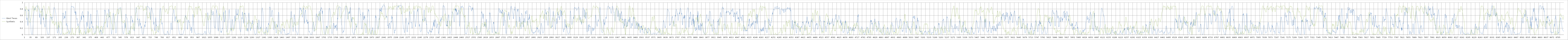
| Category | West Texas | Synthetic |
|---|---|---|
| 0 | 0.784 | 0.587 |
| 1 | 0.75 | 0.593 |
| 2 | 0.752 | 0.647 |
| 3 | 0.768 | 0.708 |
| 4 | 0.758 | 0.78 |
| 5 | 0.784 | 0.848 |
| 6 | 0.752 | 0.876 |
| 7 | 0.745 | 0.877 |
| 8 | 0.735 | 0.852 |
| 9 | 0.659 | 0.816 |
| 10 | 0.537 | 0.811 |
| 11 | 0.461 | 0.797 |
| 12 | 0.528 | 0.788 |
| 13 | 0.52 | 0.793 |
| 14 | 0.455 | 0.777 |
| 15 | 0.418 | 0.781 |
| 16 | 0.34 | 0.776 |
| 17 | 0.283 | 0.763 |
| 18 | 0.382 | 0.736 |
| 19 | 0.768 | 0.706 |
| 20 | 0.746 | 0.644 |
| 21 | 0.776 | 0.585 |
| 22 | 0.76 | 0.512 |
| 23 | 0.782 | 0.446 |
| 24 | 0.774 | 0.43 |
| 25 | 0.742 | 0.412 |
| 26 | 0.676 | 0.408 |
| 27 | 0.636 | 0.401 |
| 28 | 0.6 | 0.382 |
| 29 | 0.525 | 0.377 |
| 30 | 0.513 | 0.388 |
| 31 | 0.477 | 0.403 |
| 32 | 0.336 | 0.44 |
| 33 | 0.295 | 0.468 |
| 34 | 0.255 | 0.489 |
| 35 | 0.139 | 0.522 |
| 36 | 0.075 | 0.544 |
| 37 | 0.039 | 0.585 |
| 38 | 0.024 | 0.638 |
| 39 | 0.014 | 0.69 |
| 40 | 0.007 | 0.742 |
| 41 | 0.006 | 0.796 |
| 42 | 0.007 | 0.834 |
| 43 | 0.03 | 0.865 |
| 44 | 0.072 | 0.89 |
| 45 | 0.156 | 0.893 |
| 46 | 0.248 | 0.891 |
| 47 | 0.354 | 0.893 |
| 48 | 0.509 | 0.876 |
| 49 | 0.614 | 0.836 |
| 50 | 0.647 | 0.804 |
| 51 | 0.668 | 0.762 |
| 52 | 0.686 | 0.74 |
| 53 | 0.753 | 0.752 |
| 54 | 0.813 | 0.773 |
| 55 | 0.819 | 0.802 |
| 56 | 0.828 | 0.841 |
| 57 | 0.768 | 0.86 |
| 58 | 0.772 | 0.868 |
| 59 | 0.813 | 0.87 |
| 60 | 0.834 | 0.853 |
| 61 | 0.848 | 0.829 |
| 62 | 0.856 | 0.796 |
| 63 | 0.864 | 0.762 |
| 64 | 0.871 | 0.736 |
| 65 | 0.867 | 0.735 |
| 66 | 0.867 | 0.738 |
| 67 | 0.892 | 0.735 |
| 68 | 0.904 | 0.731 |
| 69 | 0.901 | 0.725 |
| 70 | 0.908 | 0.745 |
| 71 | 0.907 | 0.794 |
| 72 | 0.901 | 0.84 |
| 73 | 0.883 | 0.881 |
| 74 | 0.87 | 0.899 |
| 75 | 0.856 | 0.9 |
| 76 | 0.835 | 0.9 |
| 77 | 0.821 | 0.9 |
| 78 | 0.802 | 0.892 |
| 79 | 0.8 | 0.875 |
| 80 | 0.784 | 0.859 |
| 81 | 0.71 | 0.842 |
| 82 | 0.619 | 0.821 |
| 83 | 0.544 | 0.793 |
| 84 | 0.533 | 0.758 |
| 85 | 0.579 | 0.722 |
| 86 | 0.666 | 0.697 |
| 87 | 0.541 | 0.681 |
| 88 | 0.541 | 0.686 |
| 89 | 0.43 | 0.696 |
| 90 | 0.35 | 0.712 |
| 91 | 0.316 | 0.737 |
| 92 | 0.399 | 0.746 |
| 93 | 0.521 | 0.734 |
| 94 | 0.576 | 0.713 |
| 95 | 0.664 | 0.681 |
| 96 | 0.709 | 0.625 |
| 97 | 0.798 | 0.595 |
| 98 | 0.792 | 0.581 |
| 99 | 0.811 | 0.622 |
| 100 | 0.758 | 0.697 |
| 101 | 0.75 | 0.761 |
| 102 | 0.707 | 0.821 |
| 103 | 0.699 | 0.844 |
| 104 | 0.503 | 0.858 |
| 105 | 0.462 | 0.881 |
| 106 | 0.532 | 0.894 |
| 107 | 0.476 | 0.898 |
| 108 | 0.373 | 0.9 |
| 109 | 0.347 | 0.883 |
| 110 | 0.317 | 0.859 |
| 111 | 0.314 | 0.813 |
| 112 | 0.314 | 0.778 |
| 113 | 0.289 | 0.759 |
| 114 | 0.231 | 0.737 |
| 115 | 0.288 | 0.729 |
| 116 | 0.362 | 0.68 |
| 117 | 0.452 | 0.614 |
| 118 | 0.534 | 0.554 |
| 119 | 0.57 | 0.49 |
| 120 | 0.604 | 0.481 |
| 121 | 0.641 | 0.493 |
| 122 | 0.567 | 0.532 |
| 123 | 0.436 | 0.591 |
| 124 | 0.326 | 0.619 |
| 125 | 0.202 | 0.652 |
| 126 | 0.126 | 0.667 |
| 127 | 0.098 | 0.684 |
| 128 | 0.052 | 0.699 |
| 129 | 0.022 | 0.713 |
| 130 | 0.017 | 0.744 |
| 131 | 0.023 | 0.76 |
| 132 | 0.019 | 0.798 |
| 133 | 0.008 | 0.831 |
| 134 | 0.006 | 0.85 |
| 135 | 0.008 | 0.875 |
| 136 | 0.013 | 0.882 |
| 137 | 0.028 | 0.878 |
| 138 | 0.07 | 0.85 |
| 139 | 0.104 | 0.819 |
| 140 | 0.162 | 0.779 |
| 141 | 0.233 | 0.736 |
| 142 | 0.368 | 0.705 |
| 143 | 0.542 | 0.653 |
| 144 | 0.559 | 0.628 |
| 145 | 0.545 | 0.616 |
| 146 | 0.552 | 0.618 |
| 147 | 0.531 | 0.636 |
| 148 | 0.532 | 0.633 |
| 149 | 0.502 | 0.609 |
| 150 | 0.507 | 0.575 |
| 151 | 0.554 | 0.543 |
| 152 | 0.548 | 0.509 |
| 153 | 0.45 | 0.479 |
| 154 | 0.449 | 0.442 |
| 155 | 0.451 | 0.404 |
| 156 | 0.501 | 0.375 |
| 157 | 0.548 | 0.351 |
| 158 | 0.533 | 0.354 |
| 159 | 0.543 | 0.37 |
| 160 | 0.621 | 0.408 |
| 161 | 0.677 | 0.429 |
| 162 | 0.696 | 0.424 |
| 163 | 0.778 | 0.42 |
| 164 | 0.82 | 0.379 |
| 165 | 0.827 | 0.356 |
| 166 | 0.85 | 0.328 |
| 167 | 0.83 | 0.294 |
| 168 | 0.832 | 0.295 |
| 169 | 0.83 | 0.294 |
| 170 | 0.82 | 0.31 |
| 171 | 0.807 | 0.331 |
| 172 | 0.778 | 0.325 |
| 173 | 0.737 | 0.331 |
| 174 | 0.711 | 0.348 |
| 175 | 0.687 | 0.372 |
| 176 | 0.674 | 0.39 |
| 177 | 0.585 | 0.401 |
| 178 | 0.556 | 0.386 |
| 179 | 0.472 | 0.344 |
| 180 | 0.388 | 0.307 |
| 181 | 0.273 | 0.263 |
| 182 | 0.181 | 0.219 |
| 183 | 0.129 | 0.202 |
| 184 | 0.074 | 0.186 |
| 185 | 0.046 | 0.194 |
| 186 | 0.052 | 0.231 |
| 187 | 0.082 | 0.27 |
| 188 | 0.112 | 0.328 |
| 189 | 0.18 | 0.386 |
| 190 | 0.301 | 0.401 |
| 191 | 0.292 | 0.395 |
| 192 | 0.257 | 0.369 |
| 193 | 0.215 | 0.313 |
| 194 | 0.145 | 0.268 |
| 195 | 0.106 | 0.244 |
| 196 | 0.068 | 0.221 |
| 197 | 0.053 | 0.26 |
| 198 | 0.044 | 0.318 |
| 199 | 0.044 | 0.356 |
| 200 | 0.027 | 0.413 |
| 201 | 0.016 | 0.41 |
| 202 | 0.008 | 0.397 |
| 203 | 0.007 | 0.398 |
| 204 | 0.01 | 0.392 |
| 205 | 0.019 | 0.4 |
| 206 | 0.026 | 0.4 |
| 207 | 0.023 | 0.39 |
| 208 | 0.026 | 0.362 |
| 209 | 0.066 | 0.316 |
| 210 | 0.142 | 0.287 |
| 211 | 0.262 | 0.269 |
| 212 | 0.413 | 0.238 |
| 213 | 0.514 | 0.222 |
| 214 | 0.601 | 0.178 |
| 215 | 0.663 | 0.115 |
| 216 | 0.661 | 0.068 |
| 217 | 0.681 | 0.028 |
| 218 | 0.648 | 0.013 |
| 219 | 0.64 | 0.029 |
| 220 | 0.614 | 0.04 |
| 221 | 0.474 | 0.046 |
| 222 | 0.502 | 0.04 |
| 223 | 0.528 | 0.028 |
| 224 | 0.532 | 0.016 |
| 225 | 0.574 | 0.01 |
| 226 | 0.535 | 0.01 |
| 227 | 0.514 | 0 |
| 228 | 0.614 | 0.008 |
| 229 | 0.652 | 0.022 |
| 230 | 0.661 | 0.044 |
| 231 | 0.712 | 0.06 |
| 232 | 0.741 | 0.059 |
| 233 | 0.599 | 0.049 |
| 234 | 0.293 | 0.034 |
| 235 | 0.281 | 0.027 |
| 236 | 0.321 | 0.033 |
| 237 | 0.341 | 0.046 |
| 238 | 0.351 | 0.066 |
| 239 | 0.31 | 0.076 |
| 240 | 0.27 | 0.08 |
| 241 | 0.288 | 0.067 |
| 242 | 0.272 | 0.049 |
| 243 | 0.2 | 0.043 |
| 244 | 0.16 | 0.054 |
| 245 | 0.166 | 0.086 |
| 246 | 0.166 | 0.115 |
| 247 | 0.144 | 0.127 |
| 248 | 0.106 | 0.126 |
| 249 | 0.074 | 0.122 |
| 250 | 0.025 | 0.113 |
| 251 | 0.021 | 0.118 |
| 252 | 0.037 | 0.124 |
| 253 | 0.063 | 0.112 |
| 254 | 0.076 | 0.1 |
| 255 | 0.09 | 0.078 |
| 256 | 0.088 | 0.047 |
| 257 | 0.072 | 0.036 |
| 258 | 0.095 | 0.019 |
| 259 | 0.197 | 0.01 |
| 260 | 0.325 | 0.01 |
| 261 | 0.525 | 0 |
| 262 | 0.762 | 0 |
| 263 | 0.857 | 0.005 |
| 264 | 0.886 | 0.018 |
| 265 | 0.891 | 0.036 |
| 266 | 0.872 | 0.059 |
| 267 | 0.869 | 0.108 |
| 268 | 0.866 | 0.165 |
| 269 | 0.87 | 0.213 |
| 270 | 0.879 | 0.211 |
| 271 | 0.883 | 0.157 |
| 272 | 0.88 | 0.087 |
| 273 | 0.867 | 0.02 |
| 274 | 0.852 | 0 |
| 275 | 0.847 | 0.008 |
| 276 | 0.86 | 0.019 |
| 277 | 0.869 | 0.045 |
| 278 | 0.85 | 0.045 |
| 279 | 0.848 | 0.037 |
| 280 | 0.786 | 0.026 |
| 281 | 0.726 | 0 |
| 282 | 0.691 | 0 |
| 283 | 0.692 | 0 |
| 284 | 0.68 | 0 |
| 285 | 0.715 | 0 |
| 286 | 0.72 | 0.014 |
| 287 | 0.694 | 0.035 |
| 288 | 0.617 | 0.062 |
| 289 | 0.725 | 0.103 |
| 290 | 0.693 | 0.136 |
| 291 | 0.682 | 0.166 |
| 292 | 0.57 | 0.188 |
| 293 | 0.519 | 0.192 |
| 294 | 0.507 | 0.176 |
| 295 | 0.476 | 0.172 |
| 296 | 0.51 | 0.18 |
| 297 | 0.379 | 0.193 |
| 298 | 0.293 | 0.212 |
| 299 | 0.282 | 0.22 |
| 300 | 0.287 | 0.22 |
| 301 | 0.281 | 0.233 |
| 302 | 0.344 | 0.267 |
| 303 | 0.344 | 0.274 |
| 304 | 0.327 | 0.275 |
| 305 | 0.255 | 0.221 |
| 306 | 0.11 | 0.138 |
| 307 | 0.081 | 0.076 |
| 308 | 0.052 | 0.018 |
| 309 | 0.065 | 0 |
| 310 | 0.138 | 0 |
| 311 | 0.242 | 0 |
| 312 | 0.305 | 0.03 |
| 313 | 0.387 | 0.068 |
| 314 | 0.399 | 0.105 |
| 315 | 0.402 | 0.154 |
| 316 | 0.433 | 0.138 |
| 317 | 0.424 | 0.105 |
| 318 | 0.451 | 0.074 |
| 319 | 0.524 | 0.038 |
| 320 | 0.591 | 0.046 |
| 321 | 0.464 | 0.059 |
| 322 | 0.528 | 0.053 |
| 323 | 0.594 | 0.04 |
| 324 | 0.673 | 0.018 |
| 325 | 0.683 | 0 |
| 326 | 0.695 | 0 |
| 327 | 0.704 | 0 |
| 328 | 0.725 | 0 |
| 329 | 0.691 | 0 |
| 330 | 0.576 | 0 |
| 331 | 0.59 | 0 |
| 332 | 0.611 | 0.013 |
| 333 | 0.538 | 0.029 |
| 334 | 0.585 | 0.046 |
| 335 | 0.426 | 0.066 |
| 336 | 0.319 | 0.069 |
| 337 | 0.259 | 0.08 |
| 338 | 0.226 | 0.101 |
| 339 | 0.214 | 0.101 |
| 340 | 0.206 | 0.093 |
| 341 | 0.141 | 0.067 |
| 342 | 0.125 | 0.027 |
| 343 | 0.092 | 0.008 |
| 344 | 0.068 | 0 |
| 345 | 0.044 | 0 |
| 346 | 0.022 | 0 |
| 347 | 0.067 | 0.002 |
| 348 | 0.121 | 0.025 |
| 349 | 0.211 | 0.042 |
| 350 | 0.36 | 0.066 |
| 351 | 0.387 | 0.094 |
| 352 | 0.366 | 0.09 |
| 353 | 0.315 | 0.081 |
| 354 | 0.252 | 0.074 |
| 355 | 0.442 | 0.084 |
| 356 | 0.606 | 0.12 |
| 357 | 0.655 | 0.18 |
| 358 | 0.73 | 0.208 |
| 359 | 0.709 | 0.172 |
| 360 | 0.708 | 0.12 |
| 361 | 0.693 | 0.07 |
| 362 | 0.622 | 0.055 |
| 363 | 0.524 | 0.115 |
| 364 | 0.439 | 0.163 |
| 365 | 0.394 | 0.176 |
| 366 | 0.236 | 0.172 |
| 367 | 0.196 | 0.131 |
| 368 | 0.172 | 0.094 |
| 369 | 0.232 | 0.078 |
| 370 | 0.212 | 0.098 |
| 371 | 0.366 | 0.118 |
| 372 | 0.476 | 0.138 |
| 373 | 0.597 | 0.152 |
| 374 | 0.645 | 0.146 |
| 375 | 0.625 | 0.165 |
| 376 | 0.527 | 0.187 |
| 377 | 0.418 | 0.195 |
| 378 | 0.343 | 0.17 |
| 379 | 0.422 | 0.114 |
| 380 | 0.34 | 0.059 |
| 381 | 0.255 | 0.025 |
| 382 | 0.234 | 0.009 |
| 383 | 0.224 | 0.005 |
| 384 | 0.236 | 0.002 |
| 385 | 0.238 | 0.002 |
| 386 | 0.231 | 0.005 |
| 387 | 0.261 | 0.005 |
| 388 | 0.239 | 0.021 |
| 389 | 0.231 | 0.032 |
| 390 | 0.177 | 0.034 |
| 391 | 0.157 | 0.034 |
| 392 | 0.166 | 0.018 |
| 393 | 0.084 | 0.006 |
| 394 | 0.069 | 0.003 |
| 395 | 0.043 | 0.018 |
| 396 | 0.034 | 0.039 |
| 397 | 0.037 | 0.054 |
| 398 | 0.041 | 0.053 |
| 399 | 0.054 | 0.037 |
| 400 | 0.091 | 0.023 |
| 401 | 0.086 | 0.025 |
| 402 | 0.086 | 0.049 |
| 403 | 0.136 | 0.081 |
| 404 | 0.226 | 0.125 |
| 405 | 0.35 | 0.173 |
| 406 | 0.571 | 0.216 |
| 407 | 0.686 | 0.261 |
| 408 | 0.745 | 0.284 |
| 409 | 0.752 | 0.286 |
| 410 | 0.762 | 0.266 |
| 411 | 0.757 | 0.227 |
| 412 | 0.756 | 0.2 |
| 413 | 0.678 | 0.202 |
| 414 | 0.64 | 0.217 |
| 415 | 0.594 | 0.245 |
| 416 | 0.55 | 0.265 |
| 417 | 0.412 | 0.251 |
| 418 | 0.265 | 0.22 |
| 419 | 0.208 | 0.181 |
| 420 | 0.131 | 0.132 |
| 421 | 0.083 | 0.085 |
| 422 | 0.067 | 0.054 |
| 423 | 0.066 | 0.028 |
| 424 | 0.088 | 0.01 |
| 425 | 0.112 | 0.01 |
| 426 | 0.102 | 0.057 |
| 427 | 0.122 | 0.132 |
| 428 | 0.162 | 0.191 |
| 429 | 0.13 | 0.236 |
| 430 | 0.103 | 0.247 |
| 431 | 0.12 | 0.239 |
| 432 | 0.114 | 0.242 |
| 433 | 0.133 | 0.243 |
| 434 | 0.077 | 0.243 |
| 435 | 0.026 | 0.246 |
| 436 | 0.022 | 0.266 |
| 437 | 0.012 | 0.253 |
| 438 | 0.007 | 0.236 |
| 439 | 0.011 | 0.2 |
| 440 | 0.049 | 0.122 |
| 441 | 0.112 | 0.079 |
| 442 | 0.124 | 0.05 |
| 443 | 0.173 | 0.037 |
| 444 | 0.251 | 0.054 |
| 445 | 0.253 | 0.086 |
| 446 | 0.241 | 0.112 |
| 447 | 0.29 | 0.138 |
| 448 | 0.346 | 0.172 |
| 449 | 0.346 | 0.206 |
| 450 | 0.351 | 0.224 |
| 451 | 0.538 | 0.257 |
| 452 | 0.644 | 0.314 |
| 453 | 0.733 | 0.353 |
| 454 | 0.775 | 0.391 |
| 455 | 0.734 | 0.396 |
| 456 | 0.752 | 0.369 |
| 457 | 0.739 | 0.357 |
| 458 | 0.735 | 0.36 |
| 459 | 0.683 | 0.392 |
| 460 | 0.638 | 0.427 |
| 461 | 0.594 | 0.458 |
| 462 | 0.599 | 0.488 |
| 463 | 0.59 | 0.503 |
| 464 | 0.562 | 0.527 |
| 465 | 0.444 | 0.566 |
| 466 | 0.321 | 0.601 |
| 467 | 0.248 | 0.635 |
| 468 | 0.223 | 0.657 |
| 469 | 0.295 | 0.659 |
| 470 | 0.39 | 0.656 |
| 471 | 0.454 | 0.645 |
| 472 | 0.486 | 0.626 |
| 473 | 0.529 | 0.599 |
| 474 | 0.526 | 0.576 |
| 475 | 0.709 | 0.564 |
| 476 | 0.792 | 0.545 |
| 477 | 0.742 | 0.539 |
| 478 | 0.72 | 0.544 |
| 479 | 0.641 | 0.548 |
| 480 | 0.582 | 0.573 |
| 481 | 0.548 | 0.621 |
| 482 | 0.587 | 0.664 |
| 483 | 0.586 | 0.696 |
| 484 | 0.549 | 0.711 |
| 485 | 0.548 | 0.691 |
| 486 | 0.513 | 0.65 |
| 487 | 0.426 | 0.612 |
| 488 | 0.338 | 0.58 |
| 489 | 0.172 | 0.503 |
| 490 | 0.087 | 0.444 |
| 491 | 0.038 | 0.396 |
| 492 | 0.017 | 0.348 |
| 493 | 0.024 | 0.349 |
| 494 | 0.076 | 0.346 |
| 495 | 0.128 | 0.326 |
| 496 | 0.179 | 0.289 |
| 497 | 0.231 | 0.238 |
| 498 | 0.27 | 0.191 |
| 499 | 0.462 | 0.162 |
| 500 | 0.601 | 0.16 |
| 501 | 0.657 | 0.18 |
| 502 | 0.674 | 0.173 |
| 503 | 0.663 | 0.172 |
| 504 | 0.627 | 0.17 |
| 505 | 0.615 | 0.172 |
| 506 | 0.564 | 0.238 |
| 507 | 0.51 | 0.308 |
| 508 | 0.462 | 0.383 |
| 509 | 0.41 | 0.457 |
| 510 | 0.392 | 0.515 |
| 511 | 0.381 | 0.565 |
| 512 | 0.387 | 0.606 |
| 513 | 0.293 | 0.633 |
| 514 | 0.13 | 0.633 |
| 515 | 0.07 | 0.613 |
| 516 | 0.05 | 0.602 |
| 517 | 0.046 | 0.597 |
| 518 | 0.058 | 0.614 |
| 519 | 0.068 | 0.636 |
| 520 | 0.105 | 0.671 |
| 521 | 0.174 | 0.705 |
| 522 | 0.254 | 0.732 |
| 523 | 0.393 | 0.767 |
| 524 | 0.462 | 0.776 |
| 525 | 0.529 | 0.8 |
| 526 | 0.561 | 0.805 |
| 527 | 0.619 | 0.804 |
| 528 | 0.638 | 0.786 |
| 529 | 0.691 | 0.735 |
| 530 | 0.74 | 0.683 |
| 531 | 0.761 | 0.656 |
| 532 | 0.798 | 0.641 |
| 533 | 0.811 | 0.651 |
| 534 | 0.823 | 0.675 |
| 535 | 0.831 | 0.683 |
| 536 | 0.83 | 0.721 |
| 537 | 0.825 | 0.758 |
| 538 | 0.82 | 0.774 |
| 539 | 0.823 | 0.79 |
| 540 | 0.841 | 0.806 |
| 541 | 0.837 | 0.809 |
| 542 | 0.838 | 0.818 |
| 543 | 0.844 | 0.814 |
| 544 | 0.85 | 0.779 |
| 545 | 0.832 | 0.709 |
| 546 | 0.76 | 0.648 |
| 547 | 0.706 | 0.59 |
| 548 | 0.617 | 0.524 |
| 549 | 0.515 | 0.486 |
| 550 | 0.414 | 0.446 |
| 551 | 0.32 | 0.414 |
| 552 | 0.261 | 0.398 |
| 553 | 0.212 | 0.405 |
| 554 | 0.171 | 0.41 |
| 555 | 0.139 | 0.403 |
| 556 | 0.086 | 0.397 |
| 557 | 0.048 | 0.388 |
| 558 | 0.027 | 0.376 |
| 559 | 0.023 | 0.364 |
| 560 | 0.025 | 0.361 |
| 561 | 0.039 | 0.368 |
| 562 | 0.069 | 0.392 |
| 563 | 0.093 | 0.422 |
| 564 | 0.125 | 0.452 |
| 565 | 0.161 | 0.45 |
| 566 | 0.273 | 0.438 |
| 567 | 0.366 | 0.418 |
| 568 | 0.372 | 0.391 |
| 569 | 0.28 | 0.366 |
| 570 | 0.198 | 0.353 |
| 571 | 0.338 | 0.345 |
| 572 | 0.533 | 0.332 |
| 573 | 0.64 | 0.251 |
| 574 | 0.625 | 0.161 |
| 575 | 0.56 | 0.077 |
| 576 | 0.538 | 0.015 |
| 577 | 0.532 | 0.024 |
| 578 | 0.527 | 0.027 |
| 579 | 0.534 | 0.034 |
| 580 | 0.525 | 0.028 |
| 581 | 0.499 | 0.031 |
| 582 | 0.469 | 0.038 |
| 583 | 0.423 | 0.053 |
| 584 | 0.363 | 0.057 |
| 585 | 0.238 | 0.052 |
| 586 | 0.069 | 0.047 |
| 587 | 0.029 | 0.026 |
| 588 | 0.047 | 0.013 |
| 589 | 0.048 | 0.021 |
| 590 | 0.036 | 0.038 |
| 591 | 0.023 | 0.08 |
| 592 | 0.011 | 0.133 |
| 593 | 0.009 | 0.128 |
| 594 | 0.015 | 0.109 |
| 595 | 0.042 | 0.066 |
| 596 | 0.092 | 0.026 |
| 597 | 0.142 | 0.037 |
| 598 | 0.195 | 0.062 |
| 599 | 0.266 | 0.107 |
| 600 | 0.366 | 0.171 |
| 601 | 0.481 | 0.216 |
| 602 | 0.57 | 0.248 |
| 603 | 0.588 | 0.26 |
| 604 | 0.573 | 0.252 |
| 605 | 0.564 | 0.256 |
| 606 | 0.525 | 0.249 |
| 607 | 0.518 | 0.235 |
| 608 | 0.524 | 0.208 |
| 609 | 0.449 | 0.175 |
| 610 | 0.382 | 0.166 |
| 611 | 0.461 | 0.172 |
| 612 | 0.446 | 0.224 |
| 613 | 0.43 | 0.283 |
| 614 | 0.427 | 0.326 |
| 615 | 0.371 | 0.356 |
| 616 | 0.311 | 0.312 |
| 617 | 0.237 | 0.262 |
| 618 | 0.134 | 0.216 |
| 619 | 0.129 | 0.17 |
| 620 | 0.129 | 0.156 |
| 621 | 0.114 | 0.155 |
| 622 | 0.139 | 0.182 |
| 623 | 0.171 | 0.262 |
| 624 | 0.239 | 0.347 |
| 625 | 0.341 | 0.434 |
| 626 | 0.478 | 0.501 |
| 627 | 0.569 | 0.54 |
| 628 | 0.67 | 0.603 |
| 629 | 0.796 | 0.649 |
| 630 | 0.81 | 0.677 |
| 631 | 0.824 | 0.697 |
| 632 | 0.848 | 0.691 |
| 633 | 0.827 | 0.722 |
| 634 | 0.819 | 0.764 |
| 635 | 0.772 | 0.801 |
| 636 | 0.705 | 0.85 |
| 637 | 0.607 | 0.866 |
| 638 | 0.535 | 0.871 |
| 639 | 0.469 | 0.887 |
| 640 | 0.503 | 0.886 |
| 641 | 0.451 | 0.886 |
| 642 | 0.373 | 0.899 |
| 643 | 0.327 | 0.899 |
| 644 | 0.326 | 0.9 |
| 645 | 0.286 | 0.891 |
| 646 | 0.262 | 0.871 |
| 647 | 0.256 | 0.847 |
| 648 | 0.294 | 0.819 |
| 649 | 0.428 | 0.797 |
| 650 | 0.494 | 0.817 |
| 651 | 0.486 | 0.826 |
| 652 | 0.478 | 0.841 |
| 653 | 0.414 | 0.871 |
| 654 | 0.284 | 0.871 |
| 655 | 0.354 | 0.887 |
| 656 | 0.365 | 0.899 |
| 657 | 0.327 | 0.9 |
| 658 | 0.298 | 0.9 |
| 659 | 0.206 | 0.9 |
| 660 | 0.205 | 0.883 |
| 661 | 0.243 | 0.878 |
| 662 | 0.262 | 0.876 |
| 663 | 0.222 | 0.876 |
| 664 | 0.146 | 0.888 |
| 665 | 0.071 | 0.893 |
| 666 | 0.036 | 0.894 |
| 667 | 0.03 | 0.894 |
| 668 | 0.021 | 0.891 |
| 669 | 0.01 | 0.874 |
| 670 | 0.011 | 0.836 |
| 671 | 0.023 | 0.793 |
| 672 | 0.04 | 0.761 |
| 673 | 0.062 | 0.748 |
| 674 | 0.088 | 0.761 |
| 675 | 0.097 | 0.783 |
| 676 | 0.174 | 0.804 |
| 677 | 0.203 | 0.809 |
| 678 | 0.23 | 0.807 |
| 679 | 0.249 | 0.804 |
| 680 | 0.315 | 0.785 |
| 681 | 0.264 | 0.772 |
| 682 | 0.238 | 0.763 |
| 683 | 0.31 | 0.769 |
| 684 | 0.405 | 0.794 |
| 685 | 0.369 | 0.833 |
| 686 | 0.389 | 0.869 |
| 687 | 0.493 | 0.88 |
| 688 | 0.564 | 0.881 |
| 689 | 0.653 | 0.834 |
| 690 | 0.664 | 0.774 |
| 691 | 0.765 | 0.702 |
| 692 | 0.864 | 0.634 |
| 693 | 0.885 | 0.612 |
| 694 | 0.888 | 0.615 |
| 695 | 0.887 | 0.6 |
| 696 | 0.888 | 0.582 |
| 697 | 0.882 | 0.547 |
| 698 | 0.87 | 0.509 |
| 699 | 0.873 | 0.516 |
| 700 | 0.87 | 0.524 |
| 701 | 0.855 | 0.537 |
| 702 | 0.863 | 0.538 |
| 703 | 0.862 | 0.523 |
| 704 | 0.851 | 0.517 |
| 705 | 0.837 | 0.549 |
| 706 | 0.824 | 0.592 |
| 707 | 0.831 | 0.648 |
| 708 | 0.816 | 0.694 |
| 709 | 0.788 | 0.683 |
| 710 | 0.737 | 0.64 |
| 711 | 0.666 | 0.539 |
| 712 | 0.588 | 0.434 |
| 713 | 0.466 | 0.326 |
| 714 | 0.569 | 0.244 |
| 715 | 0.711 | 0.212 |
| 716 | 0.738 | 0.178 |
| 717 | 0.788 | 0.173 |
| 718 | 0.826 | 0.15 |
| 719 | 0.841 | 0.128 |
| 720 | 0.841 | 0.106 |
| 721 | 0.801 | 0.114 |
| 722 | 0.786 | 0.138 |
| 723 | 0.757 | 0.144 |
| 724 | 0.729 | 0.164 |
| 725 | 0.695 | 0.157 |
| 726 | 0.679 | 0.146 |
| 727 | 0.664 | 0.153 |
| 728 | 0.622 | 0.124 |
| 729 | 0.535 | 0.082 |
| 730 | 0.386 | 0.044 |
| 731 | 0.326 | 0.009 |
| 732 | 0.317 | 0.002 |
| 733 | 0.404 | 0 |
| 734 | 0.339 | 0 |
| 735 | 0.236 | 0 |
| 736 | 0.155 | 0 |
| 737 | 0.141 | 0.011 |
| 738 | 0.124 | 0.02 |
| 739 | 0.213 | 0.027 |
| 740 | 0.248 | 0.029 |
| 741 | 0.302 | 0.059 |
| 742 | 0.474 | 0.073 |
| 743 | 0.543 | 0.082 |
| 744 | 0.47 | 0.09 |
| 745 | 0.387 | 0.06 |
| 746 | 0.278 | 0.059 |
| 747 | 0.312 | 0.072 |
| 748 | 0.238 | 0.128 |
| 749 | 0.23 | 0.183 |
| 750 | 0.184 | 0.217 |
| 751 | 0.154 | 0.241 |
| 752 | 0.138 | 0.24 |
| 753 | 0.124 | 0.245 |
| 754 | 0.102 | 0.264 |
| 755 | 0.116 | 0.274 |
| 756 | 0.101 | 0.267 |
| 757 | 0.081 | 0.248 |
| 758 | 0.075 | 0.206 |
| 759 | 0.082 | 0.164 |
| 760 | 0.146 | 0.135 |
| 761 | 0.246 | 0.135 |
| 762 | 0.321 | 0.17 |
| 763 | 0.446 | 0.224 |
| 764 | 0.581 | 0.278 |
| 765 | 0.677 | 0.306 |
| 766 | 0.755 | 0.306 |
| 767 | 0.794 | 0.344 |
| 768 | 0.794 | 0.397 |
| 769 | 0.821 | 0.437 |
| 770 | 0.811 | 0.488 |
| 771 | 0.793 | 0.487 |
| 772 | 0.726 | 0.464 |
| 773 | 0.628 | 0.454 |
| 774 | 0.514 | 0.45 |
| 775 | 0.469 | 0.496 |
| 776 | 0.343 | 0.546 |
| 777 | 0.323 | 0.604 |
| 778 | 0.324 | 0.705 |
| 779 | 0.375 | 0.768 |
| 780 | 0.374 | 0.816 |
| 781 | 0.317 | 0.865 |
| 782 | 0.273 | 0.867 |
| 783 | 0.208 | 0.871 |
| 784 | 0.166 | 0.885 |
| 785 | 0.116 | 0.893 |
| 786 | 0.084 | 0.894 |
| 787 | 0.053 | 0.891 |
| 788 | 0.041 | 0.857 |
| 789 | 0.032 | 0.824 |
| 790 | 0.028 | 0.8 |
| 791 | 0.025 | 0.78 |
| 792 | 0.018 | 0.781 |
| 793 | 0.016 | 0.775 |
| 794 | 0.02 | 0.767 |
| 795 | 0.016 | 0.743 |
| 796 | 0.017 | 0.722 |
| 797 | 0.008 | 0.708 |
| 798 | 0.026 | 0.7 |
| 799 | 0.012 | 0.713 |
| 800 | 0.004 | 0.733 |
| 801 | 0.003 | 0.759 |
| 802 | 0.002 | 0.779 |
| 803 | 0.004 | 0.79 |
| 804 | 0.01 | 0.8 |
| 805 | 0.008 | 0.796 |
| 806 | 0.026 | 0.784 |
| 807 | 0.034 | 0.75 |
| 808 | 0.072 | 0.716 |
| 809 | 0.114 | 0.682 |
| 810 | 0.099 | 0.652 |
| 811 | 0.08 | 0.651 |
| 812 | 0.075 | 0.653 |
| 813 | 0.057 | 0.68 |
| 814 | 0.039 | 0.708 |
| 815 | 0.028 | 0.721 |
| 816 | 0.018 | 0.737 |
| 817 | 0.022 | 0.746 |
| 818 | 0.008 | 0.768 |
| 819 | 0.004 | 0.798 |
| 820 | 0.013 | 0.836 |
| 821 | 0.016 | 0.868 |
| 822 | 0.02 | 0.884 |
| 823 | 0.03 | 0.879 |
| 824 | 0.036 | 0.88 |
| 825 | 0.097 | 0.88 |
| 826 | 0.16 | 0.874 |
| 827 | 0.205 | 0.887 |
| 828 | 0.342 | 0.887 |
| 829 | 0.365 | 0.887 |
| 830 | 0.364 | 0.893 |
| 831 | 0.37 | 0.9 |
| 832 | 0.316 | 0.897 |
| 833 | 0.254 | 0.897 |
| 834 | 0.16 | 0.897 |
| 835 | 0.147 | 0.897 |
| 836 | 0.257 | 0.893 |
| 837 | 0.521 | 0.878 |
| 838 | 0.528 | 0.857 |
| 839 | 0.576 | 0.844 |
| 840 | 0.65 | 0.824 |
| 841 | 0.654 | 0.805 |
| 842 | 0.681 | 0.785 |
| 843 | 0.703 | 0.78 |
| 844 | 0.774 | 0.787 |
| 845 | 0.778 | 0.794 |
| 846 | 0.784 | 0.804 |
| 847 | 0.74 | 0.798 |
| 848 | 0.657 | 0.798 |
| 849 | 0.564 | 0.813 |
| 850 | 0.555 | 0.842 |
| 851 | 0.511 | 0.86 |
| 852 | 0.416 | 0.88 |
| 853 | 0.459 | 0.892 |
| 854 | 0.527 | 0.889 |
| 855 | 0.509 | 0.888 |
| 856 | 0.551 | 0.825 |
| 857 | 0.572 | 0.759 |
| 858 | 0.552 | 0.68 |
| 859 | 0.547 | 0.589 |
| 860 | 0.534 | 0.554 |
| 861 | 0.513 | 0.518 |
| 862 | 0.481 | 0.48 |
| 863 | 0.481 | 0.452 |
| 864 | 0.428 | 0.422 |
| 865 | 0.425 | 0.391 |
| 866 | 0.399 | 0.394 |
| 867 | 0.458 | 0.379 |
| 868 | 0.427 | 0.37 |
| 869 | 0.383 | 0.367 |
| 870 | 0.35 | 0.354 |
| 871 | 0.27 | 0.398 |
| 872 | 0.208 | 0.432 |
| 873 | 0.167 | 0.463 |
| 874 | 0.136 | 0.472 |
| 875 | 0.113 | 0.441 |
| 876 | 0.065 | 0.409 |
| 877 | 0.024 | 0.388 |
| 878 | 0.029 | 0.407 |
| 879 | 0.018 | 0.433 |
| 880 | 0.015 | 0.458 |
| 881 | 0.009 | 0.476 |
| 882 | 0.015 | 0.479 |
| 883 | 0.006 | 0.45 |
| 884 | 0.013 | 0.42 |
| 885 | 0.014 | 0.377 |
| 886 | 0.008 | 0.304 |
| 887 | 0.012 | 0.254 |
| 888 | 0.008 | 0.205 |
| 889 | 0.009 | 0.171 |
| 890 | 0.015 | 0.155 |
| 891 | 0.022 | 0.145 |
| 892 | 0.009 | 0.17 |
| 893 | 0.006 | 0.21 |
| 894 | 0.009 | 0.259 |
| 895 | 0.007 | 0.319 |
| 896 | 0.019 | 0.356 |
| 897 | 0.018 | 0.383 |
| 898 | 0.036 | 0.406 |
| 899 | 0.04 | 0.405 |
| 900 | 0.052 | 0.386 |
| 901 | 0.1 | 0.37 |
| 902 | 0.11 | 0.361 |
| 903 | 0.128 | 0.378 |
| 904 | 0.13 | 0.425 |
| 905 | 0.15 | 0.468 |
| 906 | 0.15 | 0.495 |
| 907 | 0.301 | 0.518 |
| 908 | 0.421 | 0.524 |
| 909 | 0.526 | 0.527 |
| 910 | 0.575 | 0.535 |
| 911 | 0.606 | 0.562 |
| 912 | 0.58 | 0.572 |
| 913 | 0.57 | 0.578 |
| 914 | 0.544 | 0.582 |
| 915 | 0.549 | 0.561 |
| 916 | 0.522 | 0.544 |
| 917 | 0.529 | 0.519 |
| 918 | 0.517 | 0.489 |
| 919 | 0.501 | 0.473 |
| 920 | 0.464 | 0.47 |
| 921 | 0.375 | 0.482 |
| 922 | 0.206 | 0.532 |
| 923 | 0.165 | 0.58 |
| 924 | 0.205 | 0.633 |
| 925 | 0.256 | 0.687 |
| 926 | 0.324 | 0.718 |
| 927 | 0.455 | 0.742 |
| 928 | 0.461 | 0.769 |
| 929 | 0.446 | 0.803 |
| 930 | 0.398 | 0.837 |
| 931 | 0.384 | 0.87 |
| 932 | 0.391 | 0.891 |
| 933 | 0.395 | 0.9 |
| 934 | 0.368 | 0.898 |
| 935 | 0.366 | 0.894 |
| 936 | 0.321 | 0.887 |
| 937 | 0.29 | 0.873 |
| 938 | 0.272 | 0.862 |
| 939 | 0.24 | 0.861 |
| 940 | 0.222 | 0.868 |
| 941 | 0.184 | 0.876 |
| 942 | 0.118 | 0.88 |
| 943 | 0.168 | 0.872 |
| 944 | 0.2 | 0.872 |
| 945 | 0.24 | 0.878 |
| 946 | 0.17 | 0.855 |
| 947 | 0.054 | 0.842 |
| 948 | 0.075 | 0.821 |
| 949 | 0.126 | 0.802 |
| 950 | 0.216 | 0.808 |
| 951 | 0.345 | 0.798 |
| 952 | 0.357 | 0.785 |
| 953 | 0.419 | 0.766 |
| 954 | 0.638 | 0.752 |
| 955 | 0.563 | 0.742 |
| 956 | 0.47 | 0.727 |
| 957 | 0.416 | 0.718 |
| 958 | 0.316 | 0.693 |
| 959 | 0.236 | 0.665 |
| 960 | 0.183 | 0.621 |
| 961 | 0.174 | 0.566 |
| 962 | 0.161 | 0.542 |
| 963 | 0.132 | 0.546 |
| 964 | 0.103 | 0.594 |
| 965 | 0.065 | 0.667 |
| 966 | 0.055 | 0.742 |
| 967 | 0.048 | 0.806 |
| 968 | 0.036 | 0.853 |
| 969 | 0.026 | 0.86 |
| 970 | 0.025 | 0.856 |
| 971 | 0.016 | 0.845 |
| 972 | 0.01 | 0.845 |
| 973 | 0.009 | 0.866 |
| 974 | 0.02 | 0.819 |
| 975 | 0.023 | 0.762 |
| 976 | 0.023 | 0.69 |
| 977 | 0.023 | 0.625 |
| 978 | 0.023 | 0.634 |
| 979 | 0.022 | 0.679 |
| 980 | 0.022 | 0.75 |
| 981 | 0.021 | 0.816 |
| 982 | 0.025 | 0.863 |
| 983 | 0.029 | 0.881 |
| 984 | 0.038 | 0.855 |
| 985 | 0.036 | 0.835 |
| 986 | 0.036 | 0.832 |
| 987 | 0.031 | 0.84 |
| 988 | 0.035 | 0.867 |
| 989 | 0.031 | 0.886 |
| 990 | 0.027 | 0.891 |
| 991 | 0.031 | 0.88 |
| 992 | 0.026 | 0.84 |
| 993 | 0.023 | 0.794 |
| 994 | 0.028 | 0.758 |
| 995 | 0.02 | 0.747 |
| 996 | 0.017 | 0.764 |
| 997 | 0.022 | 0.796 |
| 998 | 0.019 | 0.804 |
| 999 | 0.021 | 0.79 |
| 1000 | 0.02 | 0.754 |
| 1001 | 0.024 | 0.704 |
| 1002 | 0.02 | 0.67 |
| 1003 | 0.016 | 0.629 |
| 1004 | 0.017 | 0.616 |
| 1005 | 0.008 | 0.596 |
| 1006 | 0.004 | 0.548 |
| 1007 | 0.012 | 0.51 |
| 1008 | 0.012 | 0.458 |
| 1009 | 0.018 | 0.418 |
| 1010 | 0.016 | 0.403 |
| 1011 | 0.014 | 0.39 |
| 1012 | 0.016 | 0.363 |
| 1013 | 0.03 | 0.327 |
| 1014 | 0.031 | 0.303 |
| 1015 | 0.041 | 0.279 |
| 1016 | 0.036 | 0.269 |
| 1017 | 0.038 | 0.271 |
| 1018 | 0.044 | 0.278 |
| 1019 | 0.061 | 0.32 |
| 1020 | 0.073 | 0.374 |
| 1021 | 0.075 | 0.425 |
| 1022 | 0.111 | 0.476 |
| 1023 | 0.094 | 0.497 |
| 1024 | 0.085 | 0.537 |
| 1025 | 0.062 | 0.582 |
| 1026 | 0.03 | 0.621 |
| 1027 | 0.014 | 0.664 |
| 1028 | 0.018 | 0.669 |
| 1029 | 0.026 | 0.65 |
| 1030 | 0.041 | 0.618 |
| 1031 | 0.112 | 0.583 |
| 1032 | 0.191 | 0.566 |
| 1033 | 0.302 | 0.574 |
| 1034 | 0.402 | 0.585 |
| 1035 | 0.5 | 0.585 |
| 1036 | 0.581 | 0.573 |
| 1037 | 0.685 | 0.542 |
| 1038 | 0.684 | 0.511 |
| 1039 | 0.664 | 0.475 |
| 1040 | 0.621 | 0.45 |
| 1041 | 0.431 | 0.442 |
| 1042 | 0.249 | 0.449 |
| 1043 | 0.161 | 0.484 |
| 1044 | 0.095 | 0.513 |
| 1045 | 0.044 | 0.558 |
| 1046 | 0.048 | 0.597 |
| 1047 | 0.045 | 0.6 |
| 1048 | 0.039 | 0.598 |
| 1049 | 0.027 | 0.561 |
| 1050 | 0.024 | 0.508 |
| 1051 | 0.032 | 0.484 |
| 1052 | 0.061 | 0.466 |
| 1053 | 0.073 | 0.473 |
| 1054 | 0.097 | 0.508 |
| 1055 | 0.186 | 0.538 |
| 1056 | 0.343 | 0.586 |
| 1057 | 0.621 | 0.629 |
| 1058 | 0.767 | 0.684 |
| 1059 | 0.734 | 0.74 |
| 1060 | 0.689 | 0.776 |
| 1061 | 0.657 | 0.814 |
| 1062 | 0.61 | 0.838 |
| 1063 | 0.612 | 0.86 |
| 1064 | 0.624 | 0.882 |
| 1065 | 0.611 | 0.895 |
| 1066 | 0.64 | 0.9 |
| 1067 | 0.721 | 0.9 |
| 1068 | 0.733 | 0.9 |
| 1069 | 0.729 | 0.9 |
| 1070 | 0.665 | 0.9 |
| 1071 | 0.677 | 0.9 |
| 1072 | 0.595 | 0.891 |
| 1073 | 0.466 | 0.879 |
| 1074 | 0.337 | 0.874 |
| 1075 | 0.244 | 0.854 |
| 1076 | 0.235 | 0.836 |
| 1077 | 0.243 | 0.831 |
| 1078 | 0.232 | 0.83 |
| 1079 | 0.193 | 0.85 |
| 1080 | 0.194 | 0.878 |
| 1081 | 0.227 | 0.894 |
| 1082 | 0.262 | 0.9 |
| 1083 | 0.317 | 0.895 |
| 1084 | 0.417 | 0.893 |
| 1085 | 0.473 | 0.893 |
| 1086 | 0.582 | 0.893 |
| 1087 | 0.711 | 0.898 |
| 1088 | 0.785 | 0.896 |
| 1089 | 0.683 | 0.896 |
| 1090 | 0.676 | 0.887 |
| 1091 | 0.667 | 0.887 |
| 1092 | 0.574 | 0.876 |
| 1093 | 0.458 | 0.852 |
| 1094 | 0.32 | 0.83 |
| 1095 | 0.234 | 0.79 |
| 1096 | 0.159 | 0.754 |
| 1097 | 0.128 | 0.709 |
| 1098 | 0.11 | 0.682 |
| 1099 | 0.207 | 0.636 |
| 1100 | 0.386 | 0.608 |
| 1101 | 0.515 | 0.607 |
| 1102 | 0.539 | 0.598 |
| 1103 | 0.581 | 0.618 |
| 1104 | 0.614 | 0.636 |
| 1105 | 0.555 | 0.655 |
| 1106 | 0.486 | 0.654 |
| 1107 | 0.357 | 0.641 |
| 1108 | 0.247 | 0.623 |
| 1109 | 0.174 | 0.583 |
| 1110 | 0.108 | 0.571 |
| 1111 | 0.085 | 0.573 |
| 1112 | 0.093 | 0.573 |
| 1113 | 0.069 | 0.557 |
| 1114 | 0.066 | 0.52 |
| 1115 | 0.101 | 0.479 |
| 1116 | 0.072 | 0.44 |
| 1117 | 0.112 | 0.471 |
| 1118 | 0.121 | 0.513 |
| 1119 | 0.142 | 0.559 |
| 1120 | 0.189 | 0.621 |
| 1121 | 0.199 | 0.649 |
| 1122 | 0.176 | 0.707 |
| 1123 | 0.229 | 0.755 |
| 1124 | 0.326 | 0.812 |
| 1125 | 0.463 | 0.86 |
| 1126 | 0.598 | 0.876 |
| 1127 | 0.707 | 0.888 |
| 1128 | 0.689 | 0.872 |
| 1129 | 0.609 | 0.865 |
| 1130 | 0.552 | 0.837 |
| 1131 | 0.532 | 0.816 |
| 1132 | 0.507 | 0.788 |
| 1133 | 0.4 | 0.744 |
| 1134 | 0.388 | 0.708 |
| 1135 | 0.487 | 0.668 |
| 1136 | 0.684 | 0.62 |
| 1137 | 0.714 | 0.574 |
| 1138 | 0.755 | 0.54 |
| 1139 | 0.752 | 0.505 |
| 1140 | 0.64 | 0.489 |
| 1141 | 0.436 | 0.41 |
| 1142 | 0.275 | 0.327 |
| 1143 | 0.196 | 0.247 |
| 1144 | 0.14 | 0.148 |
| 1145 | 0.116 | 0.104 |
| 1146 | 0.086 | 0.06 |
| 1147 | 0.089 | 0.023 |
| 1148 | 0.105 | 0.006 |
| 1149 | 0.132 | 0 |
| 1150 | 0.154 | 0.002 |
| 1151 | 0.181 | 0.002 |
| 1152 | 0.233 | 0.024 |
| 1153 | 0.346 | 0.036 |
| 1154 | 0.459 | 0.036 |
| 1155 | 0.455 | 0.035 |
| 1156 | 0.497 | 0.016 |
| 1157 | 0.639 | 0.013 |
| 1158 | 0.753 | 0.027 |
| 1159 | 0.775 | 0.027 |
| 1160 | 0.786 | 0.024 |
| 1161 | 0.645 | 0.036 |
| 1162 | 0.6 | 0.047 |
| 1163 | 0.56 | 0.079 |
| 1164 | 0.491 | 0.119 |
| 1165 | 0.45 | 0.143 |
| 1166 | 0.355 | 0.167 |
| 1167 | 0.262 | 0.19 |
| 1168 | 0.19 | 0.196 |
| 1169 | 0.197 | 0.196 |
| 1170 | 0.135 | 0.174 |
| 1171 | 0.108 | 0.15 |
| 1172 | 0.184 | 0.152 |
| 1173 | 0.284 | 0.155 |
| 1174 | 0.352 | 0.182 |
| 1175 | 0.431 | 0.204 |
| 1176 | 0.458 | 0.218 |
| 1177 | 0.476 | 0.215 |
| 1178 | 0.434 | 0.201 |
| 1179 | 0.396 | 0.179 |
| 1180 | 0.339 | 0.136 |
| 1181 | 0.309 | 0.123 |
| 1182 | 0.271 | 0.117 |
| 1183 | 0.195 | 0.123 |
| 1184 | 0.182 | 0.142 |
| 1185 | 0.168 | 0.156 |
| 1186 | 0.169 | 0.169 |
| 1187 | 0.208 | 0.168 |
| 1188 | 0.255 | 0.174 |
| 1189 | 0.336 | 0.187 |
| 1190 | 0.482 | 0.207 |
| 1191 | 0.556 | 0.244 |
| 1192 | 0.589 | 0.294 |
| 1193 | 0.498 | 0.329 |
| 1194 | 0.423 | 0.358 |
| 1195 | 0.445 | 0.409 |
| 1196 | 0.622 | 0.434 |
| 1197 | 0.71 | 0.477 |
| 1198 | 0.783 | 0.508 |
| 1199 | 0.793 | 0.51 |
| 1200 | 0.704 | 0.516 |
| 1201 | 0.694 | 0.502 |
| 1202 | 0.648 | 0.496 |
| 1203 | 0.61 | 0.5 |
| 1204 | 0.637 | 0.501 |
| 1205 | 0.655 | 0.497 |
| 1206 | 0.609 | 0.488 |
| 1207 | 0.649 | 0.481 |
| 1208 | 0.681 | 0.48 |
| 1209 | 0.72 | 0.488 |
| 1210 | 0.788 | 0.511 |
| 1211 | 0.749 | 0.551 |
| 1212 | 0.684 | 0.59 |
| 1213 | 0.604 | 0.608 |
| 1214 | 0.504 | 0.619 |
| 1215 | 0.435 | 0.606 |
| 1216 | 0.418 | 0.612 |
| 1217 | 0.397 | 0.67 |
| 1218 | 0.295 | 0.736 |
| 1219 | 0.172 | 0.808 |
| 1220 | 0.171 | 0.862 |
| 1221 | 0.156 | 0.886 |
| 1222 | 0.13 | 0.892 |
| 1223 | 0.111 | 0.868 |
| 1224 | 0.09 | 0.868 |
| 1225 | 0.088 | 0.868 |
| 1226 | 0.121 | 0.864 |
| 1227 | 0.182 | 0.881 |
| 1228 | 0.241 | 0.869 |
| 1229 | 0.273 | 0.855 |
| 1230 | 0.373 | 0.859 |
| 1231 | 0.474 | 0.867 |
| 1232 | 0.539 | 0.878 |
| 1233 | 0.486 | 0.893 |
| 1234 | 0.658 | 0.899 |
| 1235 | 0.711 | 0.9 |
| 1236 | 0.672 | 0.9 |
| 1237 | 0.631 | 0.9 |
| 1238 | 0.627 | 0.9 |
| 1239 | 0.596 | 0.884 |
| 1240 | 0.549 | 0.859 |
| 1241 | 0.484 | 0.79 |
| 1242 | 0.356 | 0.712 |
| 1243 | 0.451 | 0.618 |
| 1244 | 0.632 | 0.484 |
| 1245 | 0.674 | 0.384 |
| 1246 | 0.662 | 0.3 |
| 1247 | 0.645 | 0.248 |
| 1248 | 0.648 | 0.265 |
| 1249 | 0.674 | 0.275 |
| 1250 | 0.651 | 0.278 |
| 1251 | 0.639 | 0.281 |
| 1252 | 0.624 | 0.259 |
| 1253 | 0.589 | 0.22 |
| 1254 | 0.547 | 0.166 |
| 1255 | 0.548 | 0.134 |
| 1256 | 0.476 | 0.124 |
| 1257 | 0.312 | 0.151 |
| 1258 | 0.234 | 0.226 |
| 1259 | 0.178 | 0.281 |
| 1260 | 0.132 | 0.33 |
| 1261 | 0.122 | 0.371 |
| 1262 | 0.126 | 0.377 |
| 1263 | 0.142 | 0.364 |
| 1264 | 0.205 | 0.346 |
| 1265 | 0.142 | 0.333 |
| 1266 | 0.101 | 0.33 |
| 1267 | 0.124 | 0.36 |
| 1268 | 0.222 | 0.407 |
| 1269 | 0.465 | 0.441 |
| 1270 | 0.632 | 0.463 |
| 1271 | 0.683 | 0.462 |
| 1272 | 0.657 | 0.45 |
| 1273 | 0.584 | 0.44 |
| 1274 | 0.518 | 0.433 |
| 1275 | 0.489 | 0.422 |
| 1276 | 0.364 | 0.397 |
| 1277 | 0.28 | 0.375 |
| 1278 | 0.246 | 0.354 |
| 1279 | 0.206 | 0.346 |
| 1280 | 0.158 | 0.349 |
| 1281 | 0.126 | 0.374 |
| 1282 | 0.194 | 0.379 |
| 1283 | 0.22 | 0.377 |
| 1284 | 0.21 | 0.336 |
| 1285 | 0.211 | 0.272 |
| 1286 | 0.262 | 0.22 |
| 1287 | 0.314 | 0.181 |
| 1288 | 0.336 | 0.191 |
| 1289 | 0.36 | 0.2 |
| 1290 | 0.336 | 0.225 |
| 1291 | 0.378 | 0.258 |
| 1292 | 0.418 | 0.268 |
| 1293 | 0.444 | 0.294 |
| 1294 | 0.412 | 0.32 |
| 1295 | 0.321 | 0.326 |
| 1296 | 0.295 | 0.333 |
| 1297 | 0.258 | 0.324 |
| 1298 | 0.212 | 0.312 |
| 1299 | 0.161 | 0.312 |
| 1300 | 0.152 | 0.324 |
| 1301 | 0.137 | 0.371 |
| 1302 | 0.123 | 0.424 |
| 1303 | 0.075 | 0.493 |
| 1304 | 0.054 | 0.554 |
| 1305 | 0.027 | 0.584 |
| 1306 | 0.013 | 0.595 |
| 1307 | 0.017 | 0.586 |
| 1308 | 0.008 | 0.564 |
| 1309 | 0.006 | 0.544 |
| 1310 | 0.026 | 0.523 |
| 1311 | 0.027 | 0.49 |
| 1312 | 0.022 | 0.463 |
| 1313 | 0.023 | 0.456 |
| 1314 | 0.031 | 0.46 |
| 1315 | 0.095 | 0.48 |
| 1316 | 0.151 | 0.465 |
| 1317 | 0.237 | 0.427 |
| 1318 | 0.25 | 0.377 |
| 1319 | 0.301 | 0.312 |
| 1320 | 0.342 | 0.287 |
| 1321 | 0.36 | 0.259 |
| 1322 | 0.32 | 0.215 |
| 1323 | 0.212 | 0.16 |
| 1324 | 0.161 | 0.101 |
| 1325 | 0.233 | 0.053 |
| 1326 | 0.342 | 0.049 |
| 1327 | 0.463 | 0.063 |
| 1328 | 0.46 | 0.089 |
| 1329 | 0.463 | 0.102 |
| 1330 | 0.43 | 0.089 |
| 1331 | 0.363 | 0.064 |
| 1332 | 0.302 | 0.04 |
| 1333 | 0.245 | 0.046 |
| 1334 | 0.169 | 0.067 |
| 1335 | 0.19 | 0.104 |
| 1336 | 0.184 | 0.114 |
| 1337 | 0.173 | 0.11 |
| 1338 | 0.238 | 0.112 |
| 1339 | 0.214 | 0.122 |
| 1340 | 0.212 | 0.154 |
| 1341 | 0.205 | 0.188 |
| 1342 | 0.306 | 0.193 |
| 1343 | 0.527 | 0.205 |
| 1344 | 0.676 | 0.208 |
| 1345 | 0.769 | 0.18 |
| 1346 | 0.786 | 0.169 |
| 1347 | 0.837 | 0.133 |
| 1348 | 0.829 | 0.105 |
| 1349 | 0.774 | 0.094 |
| 1350 | 0.739 | 0.082 |
| 1351 | 0.716 | 0.081 |
| 1352 | 0.625 | 0.078 |
| 1353 | 0.507 | 0.075 |
| 1354 | 0.326 | 0.069 |
| 1355 | 0.192 | 0.047 |
| 1356 | 0.121 | 0.027 |
| 1357 | 0.074 | 0.03 |
| 1358 | 0.059 | 0.032 |
| 1359 | 0.044 | 0.054 |
| 1360 | 0.03 | 0.072 |
| 1361 | 0.018 | 0.083 |
| 1362 | 0.01 | 0.081 |
| 1363 | 0.011 | 0.068 |
| 1364 | 0.025 | 0.064 |
| 1365 | 0.05 | 0.054 |
| 1366 | 0.083 | 0.071 |
| 1367 | 0.116 | 0.101 |
| 1368 | 0.157 | 0.127 |
| 1369 | 0.188 | 0.14 |
| 1370 | 0.209 | 0.136 |
| 1371 | 0.236 | 0.112 |
| 1372 | 0.239 | 0.078 |
| 1373 | 0.199 | 0.055 |
| 1374 | 0.165 | 0.032 |
| 1375 | 0.142 | 0.018 |
| 1376 | 0.13 | 0.011 |
| 1377 | 0.068 | 0 |
| 1378 | 0.101 | 0.02 |
| 1379 | 0.098 | 0.048 |
| 1380 | 0.183 | 0.077 |
| 1381 | 0.268 | 0.092 |
| 1382 | 0.341 | 0.091 |
| 1383 | 0.36 | 0.09 |
| 1384 | 0.304 | 0.118 |
| 1385 | 0.328 | 0.172 |
| 1386 | 0.415 | 0.226 |
| 1387 | 0.576 | 0.279 |
| 1388 | 0.766 | 0.307 |
| 1389 | 0.864 | 0.31 |
| 1390 | 0.849 | 0.288 |
| 1391 | 0.86 | 0.245 |
| 1392 | 0.861 | 0.199 |
| 1393 | 0.849 | 0.177 |
| 1394 | 0.81 | 0.184 |
| 1395 | 0.77 | 0.219 |
| 1396 | 0.69 | 0.259 |
| 1397 | 0.552 | 0.303 |
| 1398 | 0.602 | 0.348 |
| 1399 | 0.684 | 0.388 |
| 1400 | 0.698 | 0.43 |
| 1401 | 0.703 | 0.461 |
| 1402 | 0.75 | 0.491 |
| 1403 | 0.743 | 0.518 |
| 1404 | 0.762 | 0.52 |
| 1405 | 0.742 | 0.513 |
| 1406 | 0.696 | 0.484 |
| 1407 | 0.621 | 0.445 |
| 1408 | 0.526 | 0.42 |
| 1409 | 0.453 | 0.405 |
| 1410 | 0.277 | 0.405 |
| 1411 | 0.189 | 0.417 |
| 1412 | 0.179 | 0.411 |
| 1413 | 0.154 | 0.378 |
| 1414 | 0.163 | 0.357 |
| 1415 | 0.165 | 0.337 |
| 1416 | 0.207 | 0.322 |
| 1417 | 0.348 | 0.324 |
| 1418 | 0.39 | 0.304 |
| 1419 | 0.416 | 0.27 |
| 1420 | 0.4 | 0.253 |
| 1421 | 0.343 | 0.231 |
| 1422 | 0.295 | 0.212 |
| 1423 | 0.23 | 0.193 |
| 1424 | 0.166 | 0.208 |
| 1425 | 0.083 | 0.237 |
| 1426 | 0.049 | 0.283 |
| 1427 | 0.079 | 0.34 |
| 1428 | 0.083 | 0.333 |
| 1429 | 0.09 | 0.311 |
| 1430 | 0.108 | 0.27 |
| 1431 | 0.192 | 0.217 |
| 1432 | 0.294 | 0.181 |
| 1433 | 0.313 | 0.144 |
| 1434 | 0.232 | 0.097 |
| 1435 | 0.235 | 0.052 |
| 1436 | 0.278 | 0.032 |
| 1437 | 0.378 | 0.022 |
| 1438 | 0.593 | 0.054 |
| 1439 | 0.674 | 0.095 |
| 1440 | 0.699 | 0.121 |
| 1441 | 0.674 | 0.142 |
| 1442 | 0.632 | 0.139 |
| 1443 | 0.452 | 0.112 |
| 1444 | 0.356 | 0.107 |
| 1445 | 0.328 | 0.098 |
| 1446 | 0.275 | 0.1 |
| 1447 | 0.218 | 0.113 |
| 1448 | 0.138 | 0.11 |
| 1449 | 0.104 | 0.111 |
| 1450 | 0.084 | 0.111 |
| 1451 | 0.082 | 0.122 |
| 1452 | 0.095 | 0.145 |
| 1453 | 0.054 | 0.188 |
| 1454 | 0.027 | 0.228 |
| 1455 | 0.044 | 0.271 |
| 1456 | 0.046 | 0.316 |
| 1457 | 0.064 | 0.33 |
| 1458 | 0.1 | 0.337 |
| 1459 | 0.159 | 0.315 |
| 1460 | 0.179 | 0.294 |
| 1461 | 0.178 | 0.286 |
| 1462 | 0.178 | 0.303 |
| 1463 | 0.193 | 0.347 |
| 1464 | 0.201 | 0.373 |
| 1465 | 0.184 | 0.392 |
| 1466 | 0.16 | 0.384 |
| 1467 | 0.14 | 0.356 |
| 1468 | 0.135 | 0.335 |
| 1469 | 0.137 | 0.301 |
| 1470 | 0.122 | 0.271 |
| 1471 | 0.124 | 0.247 |
| 1472 | 0.177 | 0.213 |
| 1473 | 0.106 | 0.209 |
| 1474 | 0.075 | 0.21 |
| 1475 | 0.053 | 0.216 |
| 1476 | 0.039 | 0.252 |
| 1477 | 0.039 | 0.287 |
| 1478 | 0.024 | 0.318 |
| 1479 | 0.016 | 0.344 |
| 1480 | 0.012 | 0.376 |
| 1481 | 0.007 | 0.388 |
| 1482 | 0.009 | 0.398 |
| 1483 | 0.007 | 0.422 |
| 1484 | 0.003 | 0.424 |
| 1485 | 0.007 | 0.437 |
| 1486 | 0.01 | 0.459 |
| 1487 | 0.011 | 0.462 |
| 1488 | 0.017 | 0.469 |
| 1489 | 0.037 | 0.465 |
| 1490 | 0.019 | 0.438 |
| 1491 | 0.013 | 0.416 |
| 1492 | 0.014 | 0.387 |
| 1493 | 0.016 | 0.358 |
| 1494 | 0.032 | 0.342 |
| 1495 | 0.05 | 0.324 |
| 1496 | 0.05 | 0.308 |
| 1497 | 0.026 | 0.286 |
| 1498 | 0.024 | 0.254 |
| 1499 | 0.022 | 0.226 |
| 1500 | 0.038 | 0.204 |
| 1501 | 0.036 | 0.201 |
| 1502 | 0.044 | 0.232 |
| 1503 | 0.057 | 0.285 |
| 1504 | 0.101 | 0.351 |
| 1505 | 0.19 | 0.412 |
| 1506 | 0.221 | 0.468 |
| 1507 | 0.313 | 0.505 |
| 1508 | 0.418 | 0.5 |
| 1509 | 0.57 | 0.498 |
| 1510 | 0.687 | 0.486 |
| 1511 | 0.724 | 0.481 |
| 1512 | 0.729 | 0.495 |
| 1513 | 0.672 | 0.5 |
| 1514 | 0.597 | 0.516 |
| 1515 | 0.54 | 0.521 |
| 1516 | 0.547 | 0.51 |
| 1517 | 0.495 | 0.482 |
| 1518 | 0.454 | 0.421 |
| 1519 | 0.391 | 0.354 |
| 1520 | 0.243 | 0.289 |
| 1521 | 0.136 | 0.26 |
| 1522 | 0.099 | 0.245 |
| 1523 | 0.097 | 0.233 |
| 1524 | 0.179 | 0.261 |
| 1525 | 0.28 | 0.275 |
| 1526 | 0.372 | 0.3 |
| 1527 | 0.476 | 0.336 |
| 1528 | 0.586 | 0.369 |
| 1529 | 0.629 | 0.388 |
| 1530 | 0.557 | 0.382 |
| 1531 | 0.496 | 0.371 |
| 1532 | 0.503 | 0.339 |
| 1533 | 0.41 | 0.315 |
| 1534 | 0.308 | 0.32 |
| 1535 | 0.272 | 0.318 |
| 1536 | 0.212 | 0.31 |
| 1537 | 0.165 | 0.294 |
| 1538 | 0.106 | 0.284 |
| 1539 | 0.117 | 0.288 |
| 1540 | 0.11 | 0.308 |
| 1541 | 0.095 | 0.337 |
| 1542 | 0.09 | 0.354 |
| 1543 | 0.073 | 0.378 |
| 1544 | 0.049 | 0.4 |
| 1545 | 0.024 | 0.396 |
| 1546 | 0.011 | 0.391 |
| 1547 | 0.008 | 0.36 |
| 1548 | 0.008 | 0.324 |
| 1549 | 0.009 | 0.31 |
| 1550 | 0.017 | 0.3 |
| 1551 | 0.044 | 0.316 |
| 1552 | 0.085 | 0.346 |
| 1553 | 0.142 | 0.397 |
| 1554 | 0.221 | 0.442 |
| 1555 | 0.308 | 0.48 |
| 1556 | 0.47 | 0.504 |
| 1557 | 0.598 | 0.514 |
| 1558 | 0.736 | 0.533 |
| 1559 | 0.779 | 0.539 |
| 1560 | 0.81 | 0.555 |
| 1561 | 0.837 | 0.562 |
| 1562 | 0.841 | 0.576 |
| 1563 | 0.805 | 0.601 |
| 1564 | 0.789 | 0.622 |
| 1565 | 0.786 | 0.636 |
| 1566 | 0.806 | 0.632 |
| 1567 | 0.823 | 0.641 |
| 1568 | 0.782 | 0.647 |
| 1569 | 0.738 | 0.656 |
| 1570 | 0.762 | 0.662 |
| 1571 | 0.703 | 0.64 |
| 1572 | 0.64 | 0.644 |
| 1573 | 0.597 | 0.671 |
| 1574 | 0.576 | 0.7 |
| 1575 | 0.541 | 0.746 |
| 1576 | 0.55 | 0.779 |
| 1577 | 0.585 | 0.811 |
| 1578 | 0.655 | 0.849 |
| 1579 | 0.692 | 0.88 |
| 1580 | 0.824 | 0.898 |
| 1581 | 0.833 | 0.9 |
| 1582 | 0.839 | 0.899 |
| 1583 | 0.763 | 0.887 |
| 1584 | 0.649 | 0.881 |
| 1585 | 0.552 | 0.881 |
| 1586 | 0.402 | 0.882 |
| 1587 | 0.348 | 0.888 |
| 1588 | 0.483 | 0.887 |
| 1589 | 0.643 | 0.871 |
| 1590 | 0.691 | 0.853 |
| 1591 | 0.721 | 0.835 |
| 1592 | 0.755 | 0.816 |
| 1593 | 0.776 | 0.806 |
| 1594 | 0.7 | 0.801 |
| 1595 | 0.627 | 0.806 |
| 1596 | 0.484 | 0.82 |
| 1597 | 0.472 | 0.844 |
| 1598 | 0.475 | 0.866 |
| 1599 | 0.407 | 0.886 |
| 1600 | 0.409 | 0.893 |
| 1601 | 0.464 | 0.882 |
| 1602 | 0.433 | 0.867 |
| 1603 | 0.346 | 0.836 |
| 1604 | 0.366 | 0.819 |
| 1605 | 0.386 | 0.826 |
| 1606 | 0.354 | 0.841 |
| 1607 | 0.369 | 0.872 |
| 1608 | 0.405 | 0.894 |
| 1609 | 0.366 | 0.9 |
| 1610 | 0.315 | 0.9 |
| 1611 | 0.162 | 0.892 |
| 1612 | 0.098 | 0.89 |
| 1613 | 0.084 | 0.89 |
| 1614 | 0.094 | 0.89 |
| 1615 | 0.109 | 0.898 |
| 1616 | 0.095 | 0.9 |
| 1617 | 0.062 | 0.896 |
| 1618 | 0.049 | 0.889 |
| 1619 | 0.048 | 0.888 |
| 1620 | 0.044 | 0.883 |
| 1621 | 0.013 | 0.863 |
| 1622 | 0.008 | 0.826 |
| 1623 | 0.008 | 0.788 |
| 1624 | 0.008 | 0.76 |
| 1625 | 0.009 | 0.755 |
| 1626 | 0.008 | 0.758 |
| 1627 | 0.009 | 0.754 |
| 1628 | 0.011 | 0.723 |
| 1629 | 0.03 | 0.673 |
| 1630 | 0.074 | 0.622 |
| 1631 | 0.096 | 0.569 |
| 1632 | 0.177 | 0.525 |
| 1633 | 0.241 | 0.485 |
| 1634 | 0.307 | 0.44 |
| 1635 | 0.311 | 0.412 |
| 1636 | 0.358 | 0.388 |
| 1637 | 0.403 | 0.366 |
| 1638 | 0.35 | 0.361 |
| 1639 | 0.268 | 0.337 |
| 1640 | 0.212 | 0.286 |
| 1641 | 0.096 | 0.242 |
| 1642 | 0.121 | 0.19 |
| 1643 | 0.161 | 0.144 |
| 1644 | 0.17 | 0.127 |
| 1645 | 0.2 | 0.114 |
| 1646 | 0.238 | 0.115 |
| 1647 | 0.254 | 0.121 |
| 1648 | 0.276 | 0.143 |
| 1649 | 0.312 | 0.158 |
| 1650 | 0.308 | 0.169 |
| 1651 | 0.341 | 0.168 |
| 1652 | 0.511 | 0.155 |
| 1653 | 0.613 | 0.142 |
| 1654 | 0.64 | 0.158 |
| 1655 | 0.657 | 0.181 |
| 1656 | 0.63 | 0.208 |
| 1657 | 0.612 | 0.243 |
| 1658 | 0.574 | 0.286 |
| 1659 | 0.559 | 0.331 |
| 1660 | 0.574 | 0.398 |
| 1661 | 0.576 | 0.475 |
| 1662 | 0.54 | 0.529 |
| 1663 | 0.552 | 0.585 |
| 1664 | 0.531 | 0.627 |
| 1665 | 0.443 | 0.646 |
| 1666 | 0.441 | 0.646 |
| 1667 | 0.454 | 0.62 |
| 1668 | 0.58 | 0.6 |
| 1669 | 0.647 | 0.579 |
| 1670 | 0.713 | 0.584 |
| 1671 | 0.733 | 0.621 |
| 1672 | 0.72 | 0.643 |
| 1673 | 0.714 | 0.657 |
| 1674 | 0.607 | 0.675 |
| 1675 | 0.41 | 0.682 |
| 1676 | 0.428 | 0.621 |
| 1677 | 0.733 | 0.571 |
| 1678 | 0.782 | 0.488 |
| 1679 | 0.741 | 0.4 |
| 1680 | 0.782 | 0.382 |
| 1681 | 0.844 | 0.356 |
| 1682 | 0.819 | 0.323 |
| 1683 | 0.826 | 0.291 |
| 1684 | 0.84 | 0.249 |
| 1685 | 0.823 | 0.198 |
| 1686 | 0.81 | 0.155 |
| 1687 | 0.766 | 0.118 |
| 1688 | 0.647 | 0.095 |
| 1689 | 0.748 | 0.074 |
| 1690 | 0.701 | 0.054 |
| 1691 | 0.597 | 0.034 |
| 1692 | 0.458 | 0.007 |
| 1693 | 0.368 | 0.001 |
| 1694 | 0.306 | 0.001 |
| 1695 | 0.219 | 0.001 |
| 1696 | 0.174 | 0.002 |
| 1697 | 0.142 | 0.001 |
| 1698 | 0.1 | 0.001 |
| 1699 | 0.054 | 0.001 |
| 1700 | 0.045 | 0 |
| 1701 | 0.038 | 0 |
| 1702 | 0.024 | 0 |
| 1703 | 0.023 | 0 |
| 1704 | 0.024 | 0 |
| 1705 | 0.027 | 0.003 |
| 1706 | 0.03 | 0.006 |
| 1707 | 0.046 | 0.028 |
| 1708 | 0.094 | 0.061 |
| 1709 | 0.106 | 0.093 |
| 1710 | 0.181 | 0.127 |
| 1711 | 0.262 | 0.149 |
| 1712 | 0.276 | 0.183 |
| 1713 | 0.237 | 0.208 |
| 1714 | 0.269 | 0.23 |
| 1715 | 0.206 | 0.239 |
| 1716 | 0.182 | 0.216 |
| 1717 | 0.232 | 0.156 |
| 1718 | 0.246 | 0.097 |
| 1719 | 0.241 | 0.05 |
| 1720 | 0.276 | 0.024 |
| 1721 | 0.364 | 0.046 |
| 1722 | 0.459 | 0.078 |
| 1723 | 0.463 | 0.113 |
| 1724 | 0.627 | 0.138 |
| 1725 | 0.764 | 0.173 |
| 1726 | 0.79 | 0.202 |
| 1727 | 0.821 | 0.229 |
| 1728 | 0.827 | 0.259 |
| 1729 | 0.806 | 0.277 |
| 1730 | 0.802 | 0.282 |
| 1731 | 0.808 | 0.276 |
| 1732 | 0.766 | 0.251 |
| 1733 | 0.732 | 0.22 |
| 1734 | 0.692 | 0.182 |
| 1735 | 0.672 | 0.192 |
| 1736 | 0.54 | 0.23 |
| 1737 | 0.42 | 0.275 |
| 1738 | 0.384 | 0.344 |
| 1739 | 0.237 | 0.406 |
| 1740 | 0.119 | 0.454 |
| 1741 | 0.063 | 0.508 |
| 1742 | 0.04 | 0.544 |
| 1743 | 0.03 | 0.538 |
| 1744 | 0.028 | 0.551 |
| 1745 | 0.046 | 0.56 |
| 1746 | 0.08 | 0.579 |
| 1747 | 0.101 | 0.607 |
| 1748 | 0.194 | 0.627 |
| 1749 | 0.301 | 0.634 |
| 1750 | 0.308 | 0.647 |
| 1751 | 0.323 | 0.651 |
| 1752 | 0.351 | 0.672 |
| 1753 | 0.333 | 0.697 |
| 1754 | 0.35 | 0.695 |
| 1755 | 0.26 | 0.7 |
| 1756 | 0.18 | 0.666 |
| 1757 | 0.184 | 0.631 |
| 1758 | 0.213 | 0.613 |
| 1759 | 0.226 | 0.614 |
| 1760 | 0.273 | 0.63 |
| 1761 | 0.233 | 0.664 |
| 1762 | 0.287 | 0.701 |
| 1763 | 0.256 | 0.729 |
| 1764 | 0.201 | 0.759 |
| 1765 | 0.252 | 0.77 |
| 1766 | 0.296 | 0.788 |
| 1767 | 0.289 | 0.8 |
| 1768 | 0.31 | 0.825 |
| 1769 | 0.285 | 0.856 |
| 1770 | 0.263 | 0.88 |
| 1771 | 0.122 | 0.9 |
| 1772 | 0.197 | 0.9 |
| 1773 | 0.43 | 0.9 |
| 1774 | 0.527 | 0.9 |
| 1775 | 0.519 | 0.9 |
| 1776 | 0.478 | 0.9 |
| 1777 | 0.675 | 0.9 |
| 1778 | 0.797 | 0.9 |
| 1779 | 0.814 | 0.896 |
| 1780 | 0.815 | 0.896 |
| 1781 | 0.828 | 0.896 |
| 1782 | 0.862 | 0.896 |
| 1783 | 0.864 | 0.847 |
| 1784 | 0.851 | 0.782 |
| 1785 | 0.857 | 0.712 |
| 1786 | 0.869 | 0.635 |
| 1787 | 0.868 | 0.603 |
| 1788 | 0.862 | 0.582 |
| 1789 | 0.864 | 0.561 |
| 1790 | 0.855 | 0.537 |
| 1791 | 0.844 | 0.531 |
| 1792 | 0.852 | 0.524 |
| 1793 | 0.848 | 0.511 |
| 1794 | 0.79 | 0.518 |
| 1795 | 0.572 | 0.536 |
| 1796 | 0.373 | 0.552 |
| 1797 | 0.309 | 0.58 |
| 1798 | 0.297 | 0.606 |
| 1799 | 0.283 | 0.621 |
| 1800 | 0.192 | 0.64 |
| 1801 | 0.113 | 0.667 |
| 1802 | 0.066 | 0.679 |
| 1803 | 0.049 | 0.684 |
| 1804 | 0.052 | 0.691 |
| 1805 | 0.051 | 0.698 |
| 1806 | 0.056 | 0.723 |
| 1807 | 0.08 | 0.736 |
| 1808 | 0.128 | 0.739 |
| 1809 | 0.092 | 0.743 |
| 1810 | 0.109 | 0.743 |
| 1811 | 0.122 | 0.754 |
| 1812 | 0.16 | 0.783 |
| 1813 | 0.215 | 0.808 |
| 1814 | 0.286 | 0.834 |
| 1815 | 0.416 | 0.847 |
| 1816 | 0.502 | 0.866 |
| 1817 | 0.616 | 0.879 |
| 1818 | 0.642 | 0.884 |
| 1819 | 0.663 | 0.895 |
| 1820 | 0.811 | 0.895 |
| 1821 | 0.849 | 0.895 |
| 1822 | 0.888 | 0.891 |
| 1823 | 0.89 | 0.893 |
| 1824 | 0.891 | 0.893 |
| 1825 | 0.88 | 0.893 |
| 1826 | 0.861 | 0.897 |
| 1827 | 0.852 | 0.9 |
| 1828 | 0.822 | 0.885 |
| 1829 | 0.795 | 0.86 |
| 1830 | 0.756 | 0.825 |
| 1831 | 0.707 | 0.794 |
| 1832 | 0.589 | 0.773 |
| 1833 | 0.476 | 0.755 |
| 1834 | 0.499 | 0.706 |
| 1835 | 0.582 | 0.644 |
| 1836 | 0.622 | 0.573 |
| 1837 | 0.69 | 0.497 |
| 1838 | 0.703 | 0.473 |
| 1839 | 0.686 | 0.435 |
| 1840 | 0.655 | 0.419 |
| 1841 | 0.668 | 0.424 |
| 1842 | 0.727 | 0.408 |
| 1843 | 0.7 | 0.414 |
| 1844 | 0.656 | 0.379 |
| 1845 | 0.781 | 0.319 |
| 1846 | 0.846 | 0.273 |
| 1847 | 0.842 | 0.231 |
| 1848 | 0.846 | 0.215 |
| 1849 | 0.795 | 0.223 |
| 1850 | 0.731 | 0.227 |
| 1851 | 0.566 | 0.234 |
| 1852 | 0.498 | 0.265 |
| 1853 | 0.417 | 0.311 |
| 1854 | 0.392 | 0.365 |
| 1855 | 0.495 | 0.421 |
| 1856 | 0.485 | 0.459 |
| 1857 | 0.553 | 0.487 |
| 1858 | 0.466 | 0.518 |
| 1859 | 0.269 | 0.53 |
| 1860 | 0.142 | 0.544 |
| 1861 | 0.089 | 0.525 |
| 1862 | 0.052 | 0.498 |
| 1863 | 0.041 | 0.484 |
| 1864 | 0.029 | 0.481 |
| 1865 | 0.015 | 0.506 |
| 1866 | 0.009 | 0.52 |
| 1867 | 0.011 | 0.541 |
| 1868 | 0.02 | 0.532 |
| 1869 | 0.052 | 0.497 |
| 1870 | 0.067 | 0.452 |
| 1871 | 0.083 | 0.406 |
| 1872 | 0.103 | 0.367 |
| 1873 | 0.143 | 0.347 |
| 1874 | 0.171 | 0.338 |
| 1875 | 0.175 | 0.31 |
| 1876 | 0.158 | 0.311 |
| 1877 | 0.167 | 0.311 |
| 1878 | 0.207 | 0.329 |
| 1879 | 0.304 | 0.354 |
| 1880 | 0.33 | 0.327 |
| 1881 | 0.243 | 0.276 |
| 1882 | 0.269 | 0.191 |
| 1883 | 0.255 | 0.1 |
| 1884 | 0.224 | 0.049 |
| 1885 | 0.238 | 0.027 |
| 1886 | 0.269 | 0.021 |
| 1887 | 0.281 | 0.021 |
| 1888 | 0.295 | 0.013 |
| 1889 | 0.324 | 0.002 |
| 1890 | 0.354 | 0 |
| 1891 | 0.41 | 0 |
| 1892 | 0.63 | 0 |
| 1893 | 0.779 | 0 |
| 1894 | 0.801 | 0 |
| 1895 | 0.834 | 0 |
| 1896 | 0.828 | 0 |
| 1897 | 0.838 | 0 |
| 1898 | 0.832 | 0 |
| 1899 | 0.808 | 0 |
| 1900 | 0.798 | 0 |
| 1901 | 0.776 | 0.008 |
| 1902 | 0.76 | 0.008 |
| 1903 | 0.715 | 0.008 |
| 1904 | 0.633 | 0.008 |
| 1905 | 0.624 | 0 |
| 1906 | 0.641 | 0 |
| 1907 | 0.568 | 0.005 |
| 1908 | 0.42 | 0.018 |
| 1909 | 0.291 | 0.018 |
| 1910 | 0.242 | 0.018 |
| 1911 | 0.184 | 0.013 |
| 1912 | 0.174 | 0 |
| 1913 | 0.172 | 0.013 |
| 1914 | 0.184 | 0.032 |
| 1915 | 0.29 | 0.052 |
| 1916 | 0.518 | 0.065 |
| 1917 | 0.625 | 0.052 |
| 1918 | 0.687 | 0.033 |
| 1919 | 0.705 | 0.013 |
| 1920 | 0.627 | 0 |
| 1921 | 0.516 | 0 |
| 1922 | 0.487 | 0.026 |
| 1923 | 0.455 | 0.073 |
| 1924 | 0.511 | 0.127 |
| 1925 | 0.577 | 0.206 |
| 1926 | 0.54 | 0.266 |
| 1927 | 0.502 | 0.319 |
| 1928 | 0.517 | 0.356 |
| 1929 | 0.599 | 0.372 |
| 1930 | 0.512 | 0.363 |
| 1931 | 0.36 | 0.331 |
| 1932 | 0.206 | 0.308 |
| 1933 | 0.114 | 0.294 |
| 1934 | 0.082 | 0.312 |
| 1935 | 0.054 | 0.342 |
| 1936 | 0.05 | 0.331 |
| 1937 | 0.061 | 0.307 |
| 1938 | 0.069 | 0.27 |
| 1939 | 0.108 | 0.234 |
| 1940 | 0.222 | 0.241 |
| 1941 | 0.254 | 0.24 |
| 1942 | 0.408 | 0.23 |
| 1943 | 0.491 | 0.212 |
| 1944 | 0.544 | 0.196 |
| 1945 | 0.6 | 0.159 |
| 1946 | 0.662 | 0.121 |
| 1947 | 0.727 | 0.078 |
| 1948 | 0.772 | 0.029 |
| 1949 | 0.796 | 0.011 |
| 1950 | 0.775 | 0.016 |
| 1951 | 0.73 | 0.048 |
| 1952 | 0.763 | 0.086 |
| 1953 | 0.747 | 0.145 |
| 1954 | 0.65 | 0.18 |
| 1955 | 0.529 | 0.189 |
| 1956 | 0.423 | 0.179 |
| 1957 | 0.327 | 0.126 |
| 1958 | 0.236 | 0.076 |
| 1959 | 0.152 | 0.036 |
| 1960 | 0.099 | 0.007 |
| 1961 | 0.062 | 0 |
| 1962 | 0.044 | 0 |
| 1963 | 0.027 | 0 |
| 1964 | 0.03 | 0 |
| 1965 | 0.044 | 0 |
| 1966 | 0.066 | 0 |
| 1967 | 0.075 | 0 |
| 1968 | 0.106 | 0.006 |
| 1969 | 0.14 | 0.039 |
| 1970 | 0.143 | 0.08 |
| 1971 | 0.135 | 0.118 |
| 1972 | 0.134 | 0.139 |
| 1973 | 0.185 | 0.106 |
| 1974 | 0.224 | 0.064 |
| 1975 | 0.19 | 0.027 |
| 1976 | 0.128 | 0 |
| 1977 | 0.114 | 0 |
| 1978 | 0.092 | 0 |
| 1979 | 0.029 | 0 |
| 1980 | 0.029 | 0 |
| 1981 | 0.008 | 0 |
| 1982 | 0.007 | 0 |
| 1983 | 0.016 | 0 |
| 1984 | 0.038 | 0.03 |
| 1985 | 0.092 | 0.071 |
| 1986 | 0.152 | 0.113 |
| 1987 | 0.208 | 0.134 |
| 1988 | 0.418 | 0.114 |
| 1989 | 0.555 | 0.074 |
| 1990 | 0.603 | 0.032 |
| 1991 | 0.526 | 0.011 |
| 1992 | 0.549 | 0.002 |
| 1993 | 0.567 | 0.01 |
| 1994 | 0.571 | 0.01 |
| 1995 | 0.556 | 0.01 |
| 1996 | 0.475 | 0.009 |
| 1997 | 0.454 | 0.006 |
| 1998 | 0.4 | 0.022 |
| 1999 | 0.33 | 0.031 |
| 2000 | 0.272 | 0.051 |
| 2001 | 0.272 | 0.078 |
| 2002 | 0.256 | 0.097 |
| 2003 | 0.205 | 0.146 |
| 2004 | 0.167 | 0.195 |
| 2005 | 0.168 | 0.228 |
| 2006 | 0.183 | 0.249 |
| 2007 | 0.247 | 0.244 |
| 2008 | 0.307 | 0.24 |
| 2009 | 0.397 | 0.249 |
| 2010 | 0.497 | 0.308 |
| 2011 | 0.475 | 0.365 |
| 2012 | 0.568 | 0.433 |
| 2013 | 0.712 | 0.496 |
| 2014 | 0.79 | 0.506 |
| 2015 | 0.818 | 0.525 |
| 2016 | 0.743 | 0.533 |
| 2017 | 0.727 | 0.544 |
| 2018 | 0.766 | 0.586 |
| 2019 | 0.767 | 0.634 |
| 2020 | 0.742 | 0.676 |
| 2021 | 0.78 | 0.716 |
| 2022 | 0.841 | 0.716 |
| 2023 | 0.822 | 0.702 |
| 2024 | 0.747 | 0.667 |
| 2025 | 0.706 | 0.639 |
| 2026 | 0.751 | 0.648 |
| 2027 | 0.787 | 0.66 |
| 2028 | 0.87 | 0.683 |
| 2029 | 0.88 | 0.683 |
| 2030 | 0.859 | 0.651 |
| 2031 | 0.866 | 0.61 |
| 2032 | 0.886 | 0.582 |
| 2033 | 0.917 | 0.569 |
| 2034 | 0.919 | 0.571 |
| 2035 | 0.928 | 0.575 |
| 2036 | 0.933 | 0.571 |
| 2037 | 0.931 | 0.566 |
| 2038 | 0.935 | 0.548 |
| 2039 | 0.927 | 0.534 |
| 2040 | 0.927 | 0.52 |
| 2041 | 0.9 | 0.498 |
| 2042 | 0.883 | 0.486 |
| 2043 | 0.891 | 0.47 |
| 2044 | 0.876 | 0.474 |
| 2045 | 0.839 | 0.489 |
| 2046 | 0.798 | 0.494 |
| 2047 | 0.736 | 0.525 |
| 2048 | 0.616 | 0.532 |
| 2049 | 0.555 | 0.538 |
| 2050 | 0.524 | 0.562 |
| 2051 | 0.542 | 0.562 |
| 2052 | 0.578 | 0.568 |
| 2053 | 0.56 | 0.564 |
| 2054 | 0.555 | 0.577 |
| 2055 | 0.558 | 0.601 |
| 2056 | 0.571 | 0.632 |
| 2057 | 0.52 | 0.672 |
| 2058 | 0.471 | 0.688 |
| 2059 | 0.278 | 0.72 |
| 2060 | 0.304 | 0.752 |
| 2061 | 0.302 | 0.79 |
| 2062 | 0.249 | 0.832 |
| 2063 | 0.188 | 0.858 |
| 2064 | 0.23 | 0.88 |
| 2065 | 0.256 | 0.884 |
| 2066 | 0.31 | 0.88 |
| 2067 | 0.335 | 0.864 |
| 2068 | 0.322 | 0.842 |
| 2069 | 0.365 | 0.82 |
| 2070 | 0.34 | 0.809 |
| 2071 | 0.266 | 0.826 |
| 2072 | 0.211 | 0.848 |
| 2073 | 0.186 | 0.868 |
| 2074 | 0.206 | 0.877 |
| 2075 | 0.264 | 0.854 |
| 2076 | 0.271 | 0.853 |
| 2077 | 0.325 | 0.86 |
| 2078 | 0.405 | 0.86 |
| 2079 | 0.418 | 0.849 |
| 2080 | 0.385 | 0.838 |
| 2081 | 0.424 | 0.826 |
| 2082 | 0.598 | 0.81 |
| 2083 | 0.501 | 0.804 |
| 2084 | 0.509 | 0.784 |
| 2085 | 0.542 | 0.79 |
| 2086 | 0.547 | 0.818 |
| 2087 | 0.489 | 0.858 |
| 2088 | 0.456 | 0.889 |
| 2089 | 0.393 | 0.887 |
| 2090 | 0.367 | 0.856 |
| 2091 | 0.326 | 0.824 |
| 2092 | 0.314 | 0.792 |
| 2093 | 0.238 | 0.784 |
| 2094 | 0.169 | 0.815 |
| 2095 | 0.129 | 0.847 |
| 2096 | 0.069 | 0.881 |
| 2097 | 0.041 | 0.9 |
| 2098 | 0.077 | 0.9 |
| 2099 | 0.152 | 0.889 |
| 2100 | 0.144 | 0.876 |
| 2101 | 0.129 | 0.858 |
| 2102 | 0.127 | 0.858 |
| 2103 | 0.124 | 0.868 |
| 2104 | 0.137 | 0.882 |
| 2105 | 0.169 | 0.9 |
| 2106 | 0.221 | 0.9 |
| 2107 | 0.247 | 0.9 |
| 2108 | 0.395 | 0.9 |
| 2109 | 0.526 | 0.9 |
| 2110 | 0.645 | 0.9 |
| 2111 | 0.723 | 0.9 |
| 2112 | 0.809 | 0.9 |
| 2113 | 0.864 | 0.9 |
| 2114 | 0.873 | 0.9 |
| 2115 | 0.884 | 0.9 |
| 2116 | 0.887 | 0.9 |
| 2117 | 0.886 | 0.9 |
| 2118 | 0.88 | 0.9 |
| 2119 | 0.88 | 0.9 |
| 2120 | 0.844 | 0.9 |
| 2121 | 0.896 | 0.9 |
| 2122 | 0.911 | 0.9 |
| 2123 | 0.908 | 0.893 |
| 2124 | 0.899 | 0.878 |
| 2125 | 0.898 | 0.852 |
| 2126 | 0.894 | 0.837 |
| 2127 | 0.892 | 0.808 |
| 2128 | 0.903 | 0.793 |
| 2129 | 0.909 | 0.798 |
| 2130 | 0.906 | 0.807 |
| 2131 | 0.898 | 0.836 |
| 2132 | 0.913 | 0.818 |
| 2133 | 0.918 | 0.787 |
| 2134 | 0.921 | 0.747 |
| 2135 | 0.92 | 0.711 |
| 2136 | 0.912 | 0.691 |
| 2137 | 0.903 | 0.666 |
| 2138 | 0.894 | 0.641 |
| 2139 | 0.873 | 0.664 |
| 2140 | 0.813 | 0.722 |
| 2141 | 0.762 | 0.799 |
| 2142 | 0.683 | 0.87 |
| 2143 | 0.602 | 0.89 |
| 2144 | 0.507 | 0.9 |
| 2145 | 0.427 | 0.881 |
| 2146 | 0.316 | 0.864 |
| 2147 | 0.29 | 0.853 |
| 2148 | 0.196 | 0.835 |
| 2149 | 0.19 | 0.808 |
| 2150 | 0.197 | 0.775 |
| 2151 | 0.172 | 0.728 |
| 2152 | 0.154 | 0.683 |
| 2153 | 0.113 | 0.689 |
| 2154 | 0.065 | 0.692 |
| 2155 | 0.064 | 0.687 |
| 2156 | 0.093 | 0.692 |
| 2157 | 0.11 | 0.687 |
| 2158 | 0.207 | 0.7 |
| 2159 | 0.363 | 0.735 |
| 2160 | 0.355 | 0.765 |
| 2161 | 0.381 | 0.766 |
| 2162 | 0.466 | 0.758 |
| 2163 | 0.501 | 0.734 |
| 2164 | 0.527 | 0.715 |
| 2165 | 0.418 | 0.729 |
| 2166 | 0.314 | 0.744 |
| 2167 | 0.26 | 0.771 |
| 2168 | 0.154 | 0.815 |
| 2169 | 0.106 | 0.821 |
| 2170 | 0.084 | 0.813 |
| 2171 | 0.13 | 0.792 |
| 2172 | 0.208 | 0.749 |
| 2173 | 0.254 | 0.72 |
| 2174 | 0.283 | 0.734 |
| 2175 | 0.322 | 0.762 |
| 2176 | 0.375 | 0.796 |
| 2177 | 0.374 | 0.846 |
| 2178 | 0.348 | 0.868 |
| 2179 | 0.316 | 0.884 |
| 2180 | 0.382 | 0.896 |
| 2181 | 0.544 | 0.891 |
| 2182 | 0.7 | 0.868 |
| 2183 | 0.733 | 0.846 |
| 2184 | 0.685 | 0.83 |
| 2185 | 0.663 | 0.81 |
| 2186 | 0.642 | 0.793 |
| 2187 | 0.594 | 0.774 |
| 2188 | 0.552 | 0.743 |
| 2189 | 0.519 | 0.709 |
| 2190 | 0.458 | 0.682 |
| 2191 | 0.425 | 0.66 |
| 2192 | 0.36 | 0.649 |
| 2193 | 0.384 | 0.661 |
| 2194 | 0.38 | 0.683 |
| 2195 | 0.359 | 0.691 |
| 2196 | 0.291 | 0.702 |
| 2197 | 0.205 | 0.713 |
| 2198 | 0.191 | 0.731 |
| 2199 | 0.232 | 0.762 |
| 2200 | 0.301 | 0.766 |
| 2201 | 0.361 | 0.776 |
| 2202 | 0.403 | 0.778 |
| 2203 | 0.409 | 0.788 |
| 2204 | 0.458 | 0.803 |
| 2205 | 0.521 | 0.817 |
| 2206 | 0.603 | 0.842 |
| 2207 | 0.719 | 0.857 |
| 2208 | 0.752 | 0.883 |
| 2209 | 0.731 | 0.894 |
| 2210 | 0.712 | 0.855 |
| 2211 | 0.66 | 0.808 |
| 2212 | 0.531 | 0.799 |
| 2213 | 0.478 | 0.788 |
| 2214 | 0.411 | 0.808 |
| 2215 | 0.353 | 0.845 |
| 2216 | 0.262 | 0.849 |
| 2217 | 0.241 | 0.867 |
| 2218 | 0.32 | 0.885 |
| 2219 | 0.339 | 0.895 |
| 2220 | 0.358 | 0.899 |
| 2221 | 0.447 | 0.899 |
| 2222 | 0.51 | 0.899 |
| 2223 | 0.597 | 0.899 |
| 2224 | 0.695 | 0.9 |
| 2225 | 0.73 | 0.9 |
| 2226 | 0.752 | 0.895 |
| 2227 | 0.763 | 0.872 |
| 2228 | 0.754 | 0.84 |
| 2229 | 0.725 | 0.823 |
| 2230 | 0.8 | 0.814 |
| 2231 | 0.818 | 0.826 |
| 2232 | 0.767 | 0.853 |
| 2233 | 0.693 | 0.87 |
| 2234 | 0.607 | 0.884 |
| 2235 | 0.464 | 0.888 |
| 2236 | 0.38 | 0.888 |
| 2237 | 0.324 | 0.888 |
| 2238 | 0.258 | 0.888 |
| 2239 | 0.29 | 0.881 |
| 2240 | 0.293 | 0.855 |
| 2241 | 0.33 | 0.834 |
| 2242 | 0.261 | 0.834 |
| 2243 | 0.148 | 0.849 |
| 2244 | 0.111 | 0.872 |
| 2245 | 0.097 | 0.877 |
| 2246 | 0.086 | 0.871 |
| 2247 | 0.083 | 0.859 |
| 2248 | 0.101 | 0.837 |
| 2249 | 0.105 | 0.826 |
| 2250 | 0.136 | 0.804 |
| 2251 | 0.13 | 0.736 |
| 2252 | 0.185 | 0.687 |
| 2253 | 0.267 | 0.653 |
| 2254 | 0.341 | 0.611 |
| 2255 | 0.389 | 0.593 |
| 2256 | 0.443 | 0.579 |
| 2257 | 0.484 | 0.536 |
| 2258 | 0.464 | 0.48 |
| 2259 | 0.432 | 0.443 |
| 2260 | 0.472 | 0.408 |
| 2261 | 0.465 | 0.391 |
| 2262 | 0.467 | 0.404 |
| 2263 | 0.56 | 0.433 |
| 2264 | 0.641 | 0.453 |
| 2265 | 0.726 | 0.464 |
| 2266 | 0.773 | 0.464 |
| 2267 | 0.759 | 0.451 |
| 2268 | 0.576 | 0.441 |
| 2269 | 0.421 | 0.443 |
| 2270 | 0.439 | 0.478 |
| 2271 | 0.481 | 0.52 |
| 2272 | 0.532 | 0.597 |
| 2273 | 0.504 | 0.705 |
| 2274 | 0.498 | 0.782 |
| 2275 | 0.44 | 0.859 |
| 2276 | 0.436 | 0.899 |
| 2277 | 0.447 | 0.892 |
| 2278 | 0.389 | 0.889 |
| 2279 | 0.311 | 0.889 |
| 2280 | 0.328 | 0.889 |
| 2281 | 0.339 | 0.891 |
| 2282 | 0.214 | 0.881 |
| 2283 | 0.092 | 0.872 |
| 2284 | 0.087 | 0.872 |
| 2285 | 0.075 | 0.868 |
| 2286 | 0.066 | 0.866 |
| 2287 | 0.082 | 0.828 |
| 2288 | 0.076 | 0.77 |
| 2289 | 0.044 | 0.716 |
| 2290 | 0.027 | 0.687 |
| 2291 | 0.058 | 0.727 |
| 2292 | 0.053 | 0.776 |
| 2293 | 0.074 | 0.823 |
| 2294 | 0.084 | 0.852 |
| 2295 | 0.09 | 0.848 |
| 2296 | 0.122 | 0.829 |
| 2297 | 0.151 | 0.802 |
| 2298 | 0.161 | 0.767 |
| 2299 | 0.107 | 0.726 |
| 2300 | 0.117 | 0.694 |
| 2301 | 0.091 | 0.69 |
| 2302 | 0.1 | 0.71 |
| 2303 | 0.076 | 0.739 |
| 2304 | 0.084 | 0.765 |
| 2305 | 0.099 | 0.772 |
| 2306 | 0.11 | 0.755 |
| 2307 | 0.1 | 0.744 |
| 2308 | 0.068 | 0.77 |
| 2309 | 0.118 | 0.803 |
| 2310 | 0.144 | 0.85 |
| 2311 | 0.194 | 0.884 |
| 2312 | 0.145 | 0.892 |
| 2313 | 0.182 | 0.899 |
| 2314 | 0.234 | 0.894 |
| 2315 | 0.249 | 0.894 |
| 2316 | 0.237 | 0.894 |
| 2317 | 0.286 | 0.886 |
| 2318 | 0.324 | 0.877 |
| 2319 | 0.404 | 0.848 |
| 2320 | 0.264 | 0.814 |
| 2321 | 0.352 | 0.785 |
| 2322 | 0.426 | 0.765 |
| 2323 | 0.463 | 0.746 |
| 2324 | 0.387 | 0.711 |
| 2325 | 0.252 | 0.674 |
| 2326 | 0.251 | 0.637 |
| 2327 | 0.344 | 0.635 |
| 2328 | 0.429 | 0.644 |
| 2329 | 0.441 | 0.647 |
| 2330 | 0.472 | 0.655 |
| 2331 | 0.462 | 0.639 |
| 2332 | 0.437 | 0.623 |
| 2333 | 0.385 | 0.615 |
| 2334 | 0.363 | 0.579 |
| 2335 | 0.314 | 0.554 |
| 2336 | 0.206 | 0.552 |
| 2337 | 0.216 | 0.556 |
| 2338 | 0.249 | 0.569 |
| 2339 | 0.253 | 0.568 |
| 2340 | 0.28 | 0.551 |
| 2341 | 0.299 | 0.538 |
| 2342 | 0.344 | 0.536 |
| 2343 | 0.33 | 0.531 |
| 2344 | 0.275 | 0.519 |
| 2345 | 0.229 | 0.498 |
| 2346 | 0.152 | 0.446 |
| 2347 | 0.051 | 0.392 |
| 2348 | 0.034 | 0.349 |
| 2349 | 0.063 | 0.301 |
| 2350 | 0.089 | 0.308 |
| 2351 | 0.128 | 0.328 |
| 2352 | 0.164 | 0.353 |
| 2353 | 0.211 | 0.388 |
| 2354 | 0.274 | 0.394 |
| 2355 | 0.314 | 0.388 |
| 2356 | 0.363 | 0.373 |
| 2357 | 0.425 | 0.338 |
| 2358 | 0.444 | 0.301 |
| 2359 | 0.478 | 0.275 |
| 2360 | 0.414 | 0.26 |
| 2361 | 0.418 | 0.278 |
| 2362 | 0.538 | 0.308 |
| 2363 | 0.528 | 0.342 |
| 2364 | 0.5 | 0.373 |
| 2365 | 0.476 | 0.401 |
| 2366 | 0.457 | 0.425 |
| 2367 | 0.473 | 0.454 |
| 2368 | 0.488 | 0.483 |
| 2369 | 0.521 | 0.511 |
| 2370 | 0.587 | 0.551 |
| 2371 | 0.617 | 0.571 |
| 2372 | 0.784 | 0.577 |
| 2373 | 0.886 | 0.571 |
| 2374 | 0.909 | 0.54 |
| 2375 | 0.902 | 0.524 |
| 2376 | 0.909 | 0.502 |
| 2377 | 0.902 | 0.475 |
| 2378 | 0.88 | 0.449 |
| 2379 | 0.894 | 0.426 |
| 2380 | 0.886 | 0.439 |
| 2381 | 0.853 | 0.489 |
| 2382 | 0.856 | 0.552 |
| 2383 | 0.836 | 0.617 |
| 2384 | 0.757 | 0.651 |
| 2385 | 0.734 | 0.655 |
| 2386 | 0.692 | 0.634 |
| 2387 | 0.632 | 0.6 |
| 2388 | 0.542 | 0.565 |
| 2389 | 0.426 | 0.53 |
| 2390 | 0.335 | 0.511 |
| 2391 | 0.282 | 0.493 |
| 2392 | 0.3 | 0.48 |
| 2393 | 0.306 | 0.461 |
| 2394 | 0.309 | 0.436 |
| 2395 | 0.259 | 0.406 |
| 2396 | 0.309 | 0.352 |
| 2397 | 0.266 | 0.311 |
| 2398 | 0.423 | 0.296 |
| 2399 | 0.4 | 0.283 |
| 2400 | 0.402 | 0.29 |
| 2401 | 0.44 | 0.28 |
| 2402 | 0.515 | 0.26 |
| 2403 | 0.573 | 0.251 |
| 2404 | 0.614 | 0.234 |
| 2405 | 0.605 | 0.232 |
| 2406 | 0.619 | 0.217 |
| 2407 | 0.519 | 0.192 |
| 2408 | 0.272 | 0.233 |
| 2409 | 0.114 | 0.288 |
| 2410 | 0.049 | 0.361 |
| 2411 | 0.031 | 0.437 |
| 2412 | 0.026 | 0.423 |
| 2413 | 0.032 | 0.38 |
| 2414 | 0.038 | 0.325 |
| 2415 | 0.045 | 0.275 |
| 2416 | 0.057 | 0.266 |
| 2417 | 0.095 | 0.28 |
| 2418 | 0.112 | 0.302 |
| 2419 | 0.152 | 0.349 |
| 2420 | 0.22 | 0.393 |
| 2421 | 0.306 | 0.431 |
| 2422 | 0.472 | 0.472 |
| 2423 | 0.619 | 0.49 |
| 2424 | 0.717 | 0.517 |
| 2425 | 0.704 | 0.542 |
| 2426 | 0.709 | 0.566 |
| 2427 | 0.702 | 0.6 |
| 2428 | 0.675 | 0.632 |
| 2429 | 0.648 | 0.682 |
| 2430 | 0.661 | 0.731 |
| 2431 | 0.644 | 0.762 |
| 2432 | 0.6 | 0.79 |
| 2433 | 0.598 | 0.808 |
| 2434 | 0.499 | 0.804 |
| 2435 | 0.437 | 0.807 |
| 2436 | 0.4 | 0.788 |
| 2437 | 0.397 | 0.764 |
| 2438 | 0.444 | 0.767 |
| 2439 | 0.531 | 0.778 |
| 2440 | 0.605 | 0.821 |
| 2441 | 0.753 | 0.861 |
| 2442 | 0.819 | 0.884 |
| 2443 | 0.748 | 0.9 |
| 2444 | 0.776 | 0.9 |
| 2445 | 0.82 | 0.9 |
| 2446 | 0.754 | 0.885 |
| 2447 | 0.81 | 0.885 |
| 2448 | 0.717 | 0.885 |
| 2449 | 0.718 | 0.885 |
| 2450 | 0.786 | 0.9 |
| 2451 | 0.72 | 0.9 |
| 2452 | 0.6 | 0.891 |
| 2453 | 0.606 | 0.891 |
| 2454 | 0.646 | 0.891 |
| 2455 | 0.694 | 0.891 |
| 2456 | 0.672 | 0.9 |
| 2457 | 0.656 | 0.9 |
| 2458 | 0.625 | 0.9 |
| 2459 | 0.641 | 0.886 |
| 2460 | 0.677 | 0.886 |
| 2461 | 0.719 | 0.886 |
| 2462 | 0.755 | 0.867 |
| 2463 | 0.77 | 0.851 |
| 2464 | 0.725 | 0.818 |
| 2465 | 0.623 | 0.779 |
| 2466 | 0.44 | 0.744 |
| 2467 | 0.257 | 0.713 |
| 2468 | 0.323 | 0.677 |
| 2469 | 0.403 | 0.646 |
| 2470 | 0.647 | 0.643 |
| 2471 | 0.754 | 0.657 |
| 2472 | 0.788 | 0.678 |
| 2473 | 0.817 | 0.692 |
| 2474 | 0.835 | 0.701 |
| 2475 | 0.884 | 0.71 |
| 2476 | 0.883 | 0.734 |
| 2477 | 0.87 | 0.782 |
| 2478 | 0.848 | 0.82 |
| 2479 | 0.839 | 0.836 |
| 2480 | 0.876 | 0.826 |
| 2481 | 0.876 | 0.785 |
| 2482 | 0.885 | 0.738 |
| 2483 | 0.898 | 0.704 |
| 2484 | 0.889 | 0.681 |
| 2485 | 0.87 | 0.654 |
| 2486 | 0.844 | 0.65 |
| 2487 | 0.837 | 0.628 |
| 2488 | 0.848 | 0.609 |
| 2489 | 0.844 | 0.61 |
| 2490 | 0.826 | 0.608 |
| 2491 | 0.735 | 0.603 |
| 2492 | 0.528 | 0.59 |
| 2493 | 0.444 | 0.575 |
| 2494 | 0.41 | 0.544 |
| 2495 | 0.358 | 0.543 |
| 2496 | 0.282 | 0.555 |
| 2497 | 0.194 | 0.578 |
| 2498 | 0.149 | 0.605 |
| 2499 | 0.076 | 0.607 |
| 2500 | 0.034 | 0.571 |
| 2501 | 0.027 | 0.494 |
| 2502 | 0.03 | 0.406 |
| 2503 | 0.043 | 0.331 |
| 2504 | 0.028 | 0.267 |
| 2505 | 0.034 | 0.231 |
| 2506 | 0.026 | 0.206 |
| 2507 | 0.031 | 0.187 |
| 2508 | 0.045 | 0.195 |
| 2509 | 0.072 | 0.2 |
| 2510 | 0.111 | 0.21 |
| 2511 | 0.177 | 0.225 |
| 2512 | 0.221 | 0.241 |
| 2513 | 0.276 | 0.266 |
| 2514 | 0.306 | 0.289 |
| 2515 | 0.296 | 0.3 |
| 2516 | 0.466 | 0.279 |
| 2517 | 0.737 | 0.254 |
| 2518 | 0.821 | 0.268 |
| 2519 | 0.88 | 0.291 |
| 2520 | 0.894 | 0.339 |
| 2521 | 0.897 | 0.388 |
| 2522 | 0.893 | 0.383 |
| 2523 | 0.897 | 0.359 |
| 2524 | 0.891 | 0.309 |
| 2525 | 0.878 | 0.235 |
| 2526 | 0.892 | 0.162 |
| 2527 | 0.883 | 0.089 |
| 2528 | 0.868 | 0.042 |
| 2529 | 0.881 | 0.044 |
| 2530 | 0.869 | 0.063 |
| 2531 | 0.847 | 0.105 |
| 2532 | 0.8 | 0.145 |
| 2533 | 0.785 | 0.173 |
| 2534 | 0.769 | 0.198 |
| 2535 | 0.733 | 0.219 |
| 2536 | 0.743 | 0.228 |
| 2537 | 0.783 | 0.224 |
| 2538 | 0.837 | 0.18 |
| 2539 | 0.811 | 0.118 |
| 2540 | 0.777 | 0.066 |
| 2541 | 0.818 | 0.016 |
| 2542 | 0.855 | 0.011 |
| 2543 | 0.843 | 0.024 |
| 2544 | 0.829 | 0.046 |
| 2545 | 0.812 | 0.046 |
| 2546 | 0.801 | 0.041 |
| 2547 | 0.74 | 0.037 |
| 2548 | 0.644 | 0.034 |
| 2549 | 0.413 | 0.062 |
| 2550 | 0.217 | 0.102 |
| 2551 | 0.191 | 0.141 |
| 2552 | 0.166 | 0.176 |
| 2553 | 0.178 | 0.198 |
| 2554 | 0.107 | 0.206 |
| 2555 | 0.084 | 0.217 |
| 2556 | 0.058 | 0.211 |
| 2557 | 0.055 | 0.207 |
| 2558 | 0.049 | 0.196 |
| 2559 | 0.078 | 0.137 |
| 2560 | 0.109 | 0.09 |
| 2561 | 0.189 | 0.043 |
| 2562 | 0.26 | 0 |
| 2563 | 0.262 | 0 |
| 2564 | 0.259 | 0 |
| 2565 | 0.266 | 0 |
| 2566 | 0.199 | 0 |
| 2567 | 0.152 | 0 |
| 2568 | 0.094 | 0.008 |
| 2569 | 0.069 | 0.025 |
| 2570 | 0.055 | 0.039 |
| 2571 | 0.054 | 0.051 |
| 2572 | 0.041 | 0.043 |
| 2573 | 0.023 | 0.026 |
| 2574 | 0.014 | 0.012 |
| 2575 | 0.012 | 0 |
| 2576 | 0.007 | 0 |
| 2577 | 0.008 | 0.004 |
| 2578 | 0.022 | 0.024 |
| 2579 | 0.032 | 0.051 |
| 2580 | 0.031 | 0.077 |
| 2581 | 0.034 | 0.106 |
| 2582 | 0.044 | 0.102 |
| 2583 | 0.066 | 0.092 |
| 2584 | 0.087 | 0.086 |
| 2585 | 0.118 | 0.082 |
| 2586 | 0.164 | 0.103 |
| 2587 | 0.21 | 0.126 |
| 2588 | 0.289 | 0.182 |
| 2589 | 0.395 | 0.237 |
| 2590 | 0.465 | 0.278 |
| 2591 | 0.571 | 0.316 |
| 2592 | 0.692 | 0.326 |
| 2593 | 0.722 | 0.332 |
| 2594 | 0.673 | 0.341 |
| 2595 | 0.672 | 0.353 |
| 2596 | 0.673 | 0.358 |
| 2597 | 0.634 | 0.36 |
| 2598 | 0.592 | 0.344 |
| 2599 | 0.547 | 0.317 |
| 2600 | 0.498 | 0.288 |
| 2601 | 0.65 | 0.265 |
| 2602 | 0.655 | 0.254 |
| 2603 | 0.568 | 0.255 |
| 2604 | 0.53 | 0.252 |
| 2605 | 0.435 | 0.243 |
| 2606 | 0.302 | 0.28 |
| 2607 | 0.333 | 0.326 |
| 2608 | 0.262 | 0.381 |
| 2609 | 0.275 | 0.395 |
| 2610 | 0.335 | 0.364 |
| 2611 | 0.331 | 0.319 |
| 2612 | 0.277 | 0.276 |
| 2613 | 0.27 | 0.297 |
| 2614 | 0.23 | 0.338 |
| 2615 | 0.231 | 0.371 |
| 2616 | 0.26 | 0.386 |
| 2617 | 0.296 | 0.363 |
| 2618 | 0.441 | 0.318 |
| 2619 | 0.486 | 0.275 |
| 2620 | 0.416 | 0.24 |
| 2621 | 0.25 | 0.199 |
| 2622 | 0.171 | 0.164 |
| 2623 | 0.127 | 0.116 |
| 2624 | 0.088 | 0.064 |
| 2625 | 0.098 | 0.034 |
| 2626 | 0.094 | 0.006 |
| 2627 | 0.1 | 0 |
| 2628 | 0.155 | 0 |
| 2629 | 0.159 | 0 |
| 2630 | 0.149 | 0.003 |
| 2631 | 0.149 | 0.051 |
| 2632 | 0.169 | 0.093 |
| 2633 | 0.18 | 0.126 |
| 2634 | 0.235 | 0.128 |
| 2635 | 0.313 | 0.093 |
| 2636 | 0.47 | 0.051 |
| 2637 | 0.612 | 0.018 |
| 2638 | 0.687 | 0.013 |
| 2639 | 0.661 | 0 |
| 2640 | 0.68 | 0 |
| 2641 | 0.626 | 0 |
| 2642 | 0.598 | 0 |
| 2643 | 0.569 | 0 |
| 2644 | 0.523 | 0.001 |
| 2645 | 0.474 | 0.009 |
| 2646 | 0.448 | 0.014 |
| 2647 | 0.364 | 0.018 |
| 2648 | 0.303 | 0.021 |
| 2649 | 0.242 | 0.018 |
| 2650 | 0.14 | 0.02 |
| 2651 | 0.073 | 0.016 |
| 2652 | 0.062 | 0.013 |
| 2653 | 0.062 | 0.008 |
| 2654 | 0.074 | 0 |
| 2655 | 0.13 | 0 |
| 2656 | 0.219 | 0 |
| 2657 | 0.322 | 0.002 |
| 2658 | 0.357 | 0.009 |
| 2659 | 0.378 | 0.016 |
| 2660 | 0.356 | 0.016 |
| 2661 | 0.397 | 0.014 |
| 2662 | 0.346 | 0.007 |
| 2663 | 0.303 | 0 |
| 2664 | 0.24 | 0 |
| 2665 | 0.175 | 0 |
| 2666 | 0.122 | 0.001 |
| 2667 | 0.104 | 0.005 |
| 2668 | 0.081 | 0.019 |
| 2669 | 0.075 | 0.04 |
| 2670 | 0.081 | 0.072 |
| 2671 | 0.068 | 0.1 |
| 2672 | 0.04 | 0.096 |
| 2673 | 0.09 | 0.079 |
| 2674 | 0.077 | 0.047 |
| 2675 | 0.057 | 0.024 |
| 2676 | 0.045 | 0.03 |
| 2677 | 0.045 | 0.043 |
| 2678 | 0.052 | 0.061 |
| 2679 | 0.063 | 0.072 |
| 2680 | 0.084 | 0.062 |
| 2681 | 0.125 | 0.044 |
| 2682 | 0.164 | 0.026 |
| 2683 | 0.231 | 0.02 |
| 2684 | 0.359 | 0.024 |
| 2685 | 0.501 | 0.033 |
| 2686 | 0.615 | 0.053 |
| 2687 | 0.682 | 0.065 |
| 2688 | 0.735 | 0.065 |
| 2689 | 0.759 | 0.056 |
| 2690 | 0.789 | 0.036 |
| 2691 | 0.822 | 0.011 |
| 2692 | 0.797 | 0.017 |
| 2693 | 0.804 | 0.017 |
| 2694 | 0.775 | 0.028 |
| 2695 | 0.743 | 0.082 |
| 2696 | 0.681 | 0.135 |
| 2697 | 0.72 | 0.21 |
| 2698 | 0.768 | 0.277 |
| 2699 | 0.761 | 0.324 |
| 2700 | 0.744 | 0.363 |
| 2701 | 0.718 | 0.415 |
| 2702 | 0.684 | 0.465 |
| 2703 | 0.662 | 0.502 |
| 2704 | 0.691 | 0.53 |
| 2705 | 0.722 | 0.543 |
| 2706 | 0.702 | 0.575 |
| 2707 | 0.661 | 0.607 |
| 2708 | 0.703 | 0.651 |
| 2709 | 0.779 | 0.673 |
| 2710 | 0.749 | 0.672 |
| 2711 | 0.762 | 0.644 |
| 2712 | 0.766 | 0.604 |
| 2713 | 0.705 | 0.573 |
| 2714 | 0.639 | 0.554 |
| 2715 | 0.638 | 0.556 |
| 2716 | 0.394 | 0.58 |
| 2717 | 0.273 | 0.617 |
| 2718 | 0.322 | 0.652 |
| 2719 | 0.35 | 0.694 |
| 2720 | 0.581 | 0.723 |
| 2721 | 0.701 | 0.754 |
| 2722 | 0.644 | 0.771 |
| 2723 | 0.499 | 0.768 |
| 2724 | 0.442 | 0.765 |
| 2725 | 0.459 | 0.767 |
| 2726 | 0.381 | 0.766 |
| 2727 | 0.278 | 0.765 |
| 2728 | 0.168 | 0.746 |
| 2729 | 0.092 | 0.722 |
| 2730 | 0.055 | 0.715 |
| 2731 | 0.03 | 0.727 |
| 2732 | 0.043 | 0.742 |
| 2733 | 0.078 | 0.741 |
| 2734 | 0.133 | 0.726 |
| 2735 | 0.19 | 0.695 |
| 2736 | 0.236 | 0.657 |
| 2737 | 0.346 | 0.623 |
| 2738 | 0.453 | 0.578 |
| 2739 | 0.51 | 0.531 |
| 2740 | 0.521 | 0.482 |
| 2741 | 0.56 | 0.42 |
| 2742 | 0.604 | 0.359 |
| 2743 | 0.632 | 0.297 |
| 2744 | 0.594 | 0.245 |
| 2745 | 0.672 | 0.223 |
| 2746 | 0.707 | 0.236 |
| 2747 | 0.668 | 0.264 |
| 2748 | 0.636 | 0.302 |
| 2749 | 0.544 | 0.308 |
| 2750 | 0.477 | 0.292 |
| 2751 | 0.466 | 0.262 |
| 2752 | 0.523 | 0.226 |
| 2753 | 0.562 | 0.212 |
| 2754 | 0.638 | 0.184 |
| 2755 | 0.688 | 0.159 |
| 2756 | 0.756 | 0.125 |
| 2757 | 0.837 | 0.084 |
| 2758 | 0.861 | 0.062 |
| 2759 | 0.874 | 0.037 |
| 2760 | 0.888 | 0.021 |
| 2761 | 0.844 | 0.05 |
| 2762 | 0.822 | 0.09 |
| 2763 | 0.823 | 0.094 |
| 2764 | 0.822 | 0.101 |
| 2765 | 0.771 | 0.072 |
| 2766 | 0.73 | 0.034 |
| 2767 | 0.701 | 0.05 |
| 2768 | 0.692 | 0.074 |
| 2769 | 0.668 | 0.109 |
| 2770 | 0.667 | 0.146 |
| 2771 | 0.591 | 0.186 |
| 2772 | 0.505 | 0.215 |
| 2773 | 0.49 | 0.23 |
| 2774 | 0.569 | 0.25 |
| 2775 | 0.654 | 0.261 |
| 2776 | 0.73 | 0.253 |
| 2777 | 0.793 | 0.242 |
| 2778 | 0.757 | 0.222 |
| 2779 | 0.803 | 0.218 |
| 2780 | 0.819 | 0.241 |
| 2781 | 0.87 | 0.262 |
| 2782 | 0.858 | 0.283 |
| 2783 | 0.827 | 0.296 |
| 2784 | 0.799 | 0.302 |
| 2785 | 0.792 | 0.327 |
| 2786 | 0.712 | 0.367 |
| 2787 | 0.616 | 0.404 |
| 2788 | 0.6 | 0.428 |
| 2789 | 0.462 | 0.427 |
| 2790 | 0.339 | 0.423 |
| 2791 | 0.24 | 0.412 |
| 2792 | 0.319 | 0.401 |
| 2793 | 0.55 | 0.399 |
| 2794 | 0.756 | 0.366 |
| 2795 | 0.802 | 0.319 |
| 2796 | 0.778 | 0.276 |
| 2797 | 0.722 | 0.224 |
| 2798 | 0.767 | 0.184 |
| 2799 | 0.784 | 0.178 |
| 2800 | 0.795 | 0.172 |
| 2801 | 0.798 | 0.168 |
| 2802 | 0.795 | 0.181 |
| 2803 | 0.746 | 0.179 |
| 2804 | 0.553 | 0.188 |
| 2805 | 0.407 | 0.228 |
| 2806 | 0.422 | 0.279 |
| 2807 | 0.496 | 0.319 |
| 2808 | 0.548 | 0.35 |
| 2809 | 0.513 | 0.359 |
| 2810 | 0.494 | 0.329 |
| 2811 | 0.492 | 0.298 |
| 2812 | 0.438 | 0.274 |
| 2813 | 0.388 | 0.252 |
| 2814 | 0.316 | 0.259 |
| 2815 | 0.258 | 0.274 |
| 2816 | 0.175 | 0.293 |
| 2817 | 0.43 | 0.33 |
| 2818 | 0.6 | 0.361 |
| 2819 | 0.671 | 0.38 |
| 2820 | 0.65 | 0.378 |
| 2821 | 0.634 | 0.348 |
| 2822 | 0.623 | 0.33 |
| 2823 | 0.621 | 0.326 |
| 2824 | 0.616 | 0.345 |
| 2825 | 0.617 | 0.381 |
| 2826 | 0.528 | 0.401 |
| 2827 | 0.361 | 0.42 |
| 2828 | 0.234 | 0.42 |
| 2829 | 0.277 | 0.409 |
| 2830 | 0.43 | 0.384 |
| 2831 | 0.396 | 0.349 |
| 2832 | 0.433 | 0.315 |
| 2833 | 0.505 | 0.276 |
| 2834 | 0.51 | 0.257 |
| 2835 | 0.496 | 0.236 |
| 2836 | 0.487 | 0.22 |
| 2837 | 0.39 | 0.202 |
| 2838 | 0.379 | 0.17 |
| 2839 | 0.379 | 0.143 |
| 2840 | 0.582 | 0.12 |
| 2841 | 0.731 | 0.114 |
| 2842 | 0.679 | 0.119 |
| 2843 | 0.654 | 0.16 |
| 2844 | 0.655 | 0.203 |
| 2845 | 0.648 | 0.241 |
| 2846 | 0.681 | 0.299 |
| 2847 | 0.738 | 0.332 |
| 2848 | 0.746 | 0.372 |
| 2849 | 0.759 | 0.41 |
| 2850 | 0.737 | 0.419 |
| 2851 | 0.629 | 0.418 |
| 2852 | 0.466 | 0.396 |
| 2853 | 0.366 | 0.365 |
| 2854 | 0.289 | 0.347 |
| 2855 | 0.418 | 0.333 |
| 2856 | 0.488 | 0.311 |
| 2857 | 0.502 | 0.287 |
| 2858 | 0.49 | 0.251 |
| 2859 | 0.466 | 0.209 |
| 2860 | 0.463 | 0.193 |
| 2861 | 0.536 | 0.174 |
| 2862 | 0.532 | 0.145 |
| 2863 | 0.494 | 0.11 |
| 2864 | 0.637 | 0.063 |
| 2865 | 0.507 | 0.027 |
| 2866 | 0.463 | 0.023 |
| 2867 | 0.399 | 0.05 |
| 2868 | 0.351 | 0.132 |
| 2869 | 0.342 | 0.221 |
| 2870 | 0.328 | 0.306 |
| 2871 | 0.273 | 0.384 |
| 2872 | 0.276 | 0.419 |
| 2873 | 0.232 | 0.448 |
| 2874 | 0.21 | 0.478 |
| 2875 | 0.15 | 0.506 |
| 2876 | 0.134 | 0.539 |
| 2877 | 0.156 | 0.588 |
| 2878 | 0.091 | 0.582 |
| 2879 | 0.077 | 0.541 |
| 2880 | 0.077 | 0.464 |
| 2881 | 0.076 | 0.403 |
| 2882 | 0.068 | 0.389 |
| 2883 | 0.055 | 0.407 |
| 2884 | 0.052 | 0.448 |
| 2885 | 0.051 | 0.448 |
| 2886 | 0.072 | 0.431 |
| 2887 | 0.073 | 0.412 |
| 2888 | 0.026 | 0.399 |
| 2889 | 0.038 | 0.384 |
| 2890 | 0.068 | 0.384 |
| 2891 | 0.081 | 0.397 |
| 2892 | 0.077 | 0.408 |
| 2893 | 0.065 | 0.432 |
| 2894 | 0.065 | 0.446 |
| 2895 | 0.06 | 0.447 |
| 2896 | 0.071 | 0.448 |
| 2897 | 0.089 | 0.448 |
| 2898 | 0.117 | 0.449 |
| 2899 | 0.104 | 0.436 |
| 2900 | 0.095 | 0.451 |
| 2901 | 0.121 | 0.465 |
| 2902 | 0.12 | 0.484 |
| 2903 | 0.142 | 0.504 |
| 2904 | 0.157 | 0.486 |
| 2905 | 0.2 | 0.455 |
| 2906 | 0.236 | 0.406 |
| 2907 | 0.222 | 0.354 |
| 2908 | 0.173 | 0.298 |
| 2909 | 0.197 | 0.252 |
| 2910 | 0.216 | 0.233 |
| 2911 | 0.173 | 0.228 |
| 2912 | 0.071 | 0.241 |
| 2913 | 0.069 | 0.259 |
| 2914 | 0.086 | 0.271 |
| 2915 | 0.11 | 0.279 |
| 2916 | 0.131 | 0.292 |
| 2917 | 0.156 | 0.301 |
| 2918 | 0.162 | 0.315 |
| 2919 | 0.164 | 0.333 |
| 2920 | 0.155 | 0.388 |
| 2921 | 0.135 | 0.454 |
| 2922 | 0.098 | 0.544 |
| 2923 | 0.034 | 0.608 |
| 2924 | 0.015 | 0.618 |
| 2925 | 0.024 | 0.594 |
| 2926 | 0.063 | 0.551 |
| 2927 | 0.14 | 0.539 |
| 2928 | 0.217 | 0.538 |
| 2929 | 0.304 | 0.567 |
| 2930 | 0.361 | 0.597 |
| 2931 | 0.356 | 0.633 |
| 2932 | 0.323 | 0.659 |
| 2933 | 0.293 | 0.673 |
| 2934 | 0.293 | 0.682 |
| 2935 | 0.247 | 0.678 |
| 2936 | 0.138 | 0.691 |
| 2937 | 0.095 | 0.717 |
| 2938 | 0.082 | 0.742 |
| 2939 | 0.048 | 0.749 |
| 2940 | 0.047 | 0.701 |
| 2941 | 0.046 | 0.624 |
| 2942 | 0.051 | 0.54 |
| 2943 | 0.066 | 0.493 |
| 2944 | 0.081 | 0.504 |
| 2945 | 0.097 | 0.536 |
| 2946 | 0.12 | 0.59 |
| 2947 | 0.171 | 0.611 |
| 2948 | 0.303 | 0.627 |
| 2949 | 0.491 | 0.633 |
| 2950 | 0.651 | 0.633 |
| 2951 | 0.722 | 0.63 |
| 2952 | 0.756 | 0.613 |
| 2953 | 0.768 | 0.599 |
| 2954 | 0.782 | 0.566 |
| 2955 | 0.777 | 0.536 |
| 2956 | 0.766 | 0.507 |
| 2957 | 0.683 | 0.478 |
| 2958 | 0.637 | 0.455 |
| 2959 | 0.696 | 0.444 |
| 2960 | 0.64 | 0.491 |
| 2961 | 0.619 | 0.55 |
| 2962 | 0.557 | 0.624 |
| 2963 | 0.489 | 0.692 |
| 2964 | 0.447 | 0.712 |
| 2965 | 0.403 | 0.734 |
| 2966 | 0.344 | 0.73 |
| 2967 | 0.315 | 0.721 |
| 2968 | 0.296 | 0.72 |
| 2969 | 0.286 | 0.705 |
| 2970 | 0.296 | 0.706 |
| 2971 | 0.331 | 0.696 |
| 2972 | 0.551 | 0.66 |
| 2973 | 0.748 | 0.626 |
| 2974 | 0.832 | 0.584 |
| 2975 | 0.856 | 0.556 |
| 2976 | 0.855 | 0.533 |
| 2977 | 0.843 | 0.494 |
| 2978 | 0.826 | 0.43 |
| 2979 | 0.81 | 0.367 |
| 2980 | 0.792 | 0.303 |
| 2981 | 0.758 | 0.255 |
| 2982 | 0.698 | 0.223 |
| 2983 | 0.591 | 0.199 |
| 2984 | 0.546 | 0.198 |
| 2985 | 0.438 | 0.214 |
| 2986 | 0.298 | 0.263 |
| 2987 | 0.224 | 0.312 |
| 2988 | 0.206 | 0.355 |
| 2989 | 0.212 | 0.39 |
| 2990 | 0.229 | 0.406 |
| 2991 | 0.238 | 0.416 |
| 2992 | 0.289 | 0.429 |
| 2993 | 0.248 | 0.46 |
| 2994 | 0.271 | 0.491 |
| 2995 | 0.283 | 0.521 |
| 2996 | 0.372 | 0.532 |
| 2997 | 0.564 | 0.521 |
| 2998 | 0.706 | 0.509 |
| 2999 | 0.732 | 0.504 |
| 3000 | 0.665 | 0.502 |
| 3001 | 0.612 | 0.492 |
| 3002 | 0.591 | 0.477 |
| 3003 | 0.602 | 0.459 |
| 3004 | 0.558 | 0.452 |
| 3005 | 0.516 | 0.451 |
| 3006 | 0.513 | 0.439 |
| 3007 | 0.46 | 0.423 |
| 3008 | 0.349 | 0.421 |
| 3009 | 0.311 | 0.436 |
| 3010 | 0.21 | 0.496 |
| 3011 | 0.16 | 0.543 |
| 3012 | 0.162 | 0.589 |
| 3013 | 0.2 | 0.63 |
| 3014 | 0.28 | 0.654 |
| 3015 | 0.437 | 0.695 |
| 3016 | 0.484 | 0.731 |
| 3017 | 0.506 | 0.746 |
| 3018 | 0.479 | 0.753 |
| 3019 | 0.338 | 0.777 |
| 3020 | 0.359 | 0.795 |
| 3021 | 0.359 | 0.824 |
| 3022 | 0.412 | 0.83 |
| 3023 | 0.593 | 0.816 |
| 3024 | 0.707 | 0.779 |
| 3025 | 0.614 | 0.733 |
| 3026 | 0.608 | 0.685 |
| 3027 | 0.632 | 0.633 |
| 3028 | 0.628 | 0.615 |
| 3029 | 0.638 | 0.636 |
| 3030 | 0.597 | 0.68 |
| 3031 | 0.526 | 0.722 |
| 3032 | 0.568 | 0.737 |
| 3033 | 0.551 | 0.729 |
| 3034 | 0.475 | 0.73 |
| 3035 | 0.462 | 0.742 |
| 3036 | 0.51 | 0.772 |
| 3037 | 0.529 | 0.782 |
| 3038 | 0.626 | 0.787 |
| 3039 | 0.723 | 0.791 |
| 3040 | 0.777 | 0.799 |
| 3041 | 0.749 | 0.834 |
| 3042 | 0.726 | 0.864 |
| 3043 | 0.619 | 0.877 |
| 3044 | 0.571 | 0.883 |
| 3045 | 0.724 | 0.87 |
| 3046 | 0.748 | 0.85 |
| 3047 | 0.71 | 0.822 |
| 3048 | 0.718 | 0.79 |
| 3049 | 0.592 | 0.738 |
| 3050 | 0.507 | 0.686 |
| 3051 | 0.293 | 0.649 |
| 3052 | 0.237 | 0.614 |
| 3053 | 0.203 | 0.616 |
| 3054 | 0.181 | 0.641 |
| 3055 | 0.17 | 0.677 |
| 3056 | 0.128 | 0.697 |
| 3057 | 0.088 | 0.711 |
| 3058 | 0.087 | 0.706 |
| 3059 | 0.129 | 0.698 |
| 3060 | 0.183 | 0.725 |
| 3061 | 0.158 | 0.749 |
| 3062 | 0.201 | 0.758 |
| 3063 | 0.344 | 0.756 |
| 3064 | 0.457 | 0.73 |
| 3065 | 0.483 | 0.692 |
| 3066 | 0.433 | 0.672 |
| 3067 | 0.301 | 0.646 |
| 3068 | 0.231 | 0.606 |
| 3069 | 0.249 | 0.588 |
| 3070 | 0.325 | 0.548 |
| 3071 | 0.326 | 0.498 |
| 3072 | 0.293 | 0.452 |
| 3073 | 0.3 | 0.384 |
| 3074 | 0.212 | 0.317 |
| 3075 | 0.283 | 0.272 |
| 3076 | 0.222 | 0.249 |
| 3077 | 0.165 | 0.257 |
| 3078 | 0.123 | 0.281 |
| 3079 | 0.117 | 0.312 |
| 3080 | 0.074 | 0.34 |
| 3081 | 0.059 | 0.346 |
| 3082 | 0.039 | 0.356 |
| 3083 | 0.028 | 0.35 |
| 3084 | 0.018 | 0.314 |
| 3085 | 0.013 | 0.273 |
| 3086 | 0.025 | 0.243 |
| 3087 | 0.035 | 0.228 |
| 3088 | 0.045 | 0.249 |
| 3089 | 0.058 | 0.29 |
| 3090 | 0.051 | 0.319 |
| 3091 | 0.09 | 0.339 |
| 3092 | 0.086 | 0.332 |
| 3093 | 0.184 | 0.311 |
| 3094 | 0.482 | 0.285 |
| 3095 | 0.691 | 0.257 |
| 3096 | 0.746 | 0.235 |
| 3097 | 0.684 | 0.204 |
| 3098 | 0.674 | 0.171 |
| 3099 | 0.611 | 0.172 |
| 3100 | 0.528 | 0.178 |
| 3101 | 0.488 | 0.183 |
| 3102 | 0.446 | 0.189 |
| 3103 | 0.385 | 0.181 |
| 3104 | 0.312 | 0.185 |
| 3105 | 0.319 | 0.199 |
| 3106 | 0.331 | 0.211 |
| 3107 | 0.372 | 0.218 |
| 3108 | 0.375 | 0.213 |
| 3109 | 0.42 | 0.238 |
| 3110 | 0.478 | 0.275 |
| 3111 | 0.491 | 0.314 |
| 3112 | 0.501 | 0.366 |
| 3113 | 0.504 | 0.381 |
| 3114 | 0.544 | 0.407 |
| 3115 | 0.497 | 0.438 |
| 3116 | 0.592 | 0.464 |
| 3117 | 0.738 | 0.501 |
| 3118 | 0.832 | 0.527 |
| 3119 | 0.846 | 0.55 |
| 3120 | 0.835 | 0.574 |
| 3121 | 0.855 | 0.598 |
| 3122 | 0.837 | 0.606 |
| 3123 | 0.827 | 0.596 |
| 3124 | 0.816 | 0.566 |
| 3125 | 0.824 | 0.522 |
| 3126 | 0.823 | 0.491 |
| 3127 | 0.82 | 0.455 |
| 3128 | 0.838 | 0.428 |
| 3129 | 0.836 | 0.406 |
| 3130 | 0.814 | 0.395 |
| 3131 | 0.781 | 0.412 |
| 3132 | 0.754 | 0.449 |
| 3133 | 0.756 | 0.497 |
| 3134 | 0.776 | 0.524 |
| 3135 | 0.806 | 0.525 |
| 3136 | 0.805 | 0.495 |
| 3137 | 0.802 | 0.46 |
| 3138 | 0.81 | 0.442 |
| 3139 | 0.815 | 0.439 |
| 3140 | 0.835 | 0.453 |
| 3141 | 0.855 | 0.493 |
| 3142 | 0.865 | 0.518 |
| 3143 | 0.866 | 0.549 |
| 3144 | 0.853 | 0.58 |
| 3145 | 0.799 | 0.588 |
| 3146 | 0.674 | 0.608 |
| 3147 | 0.569 | 0.602 |
| 3148 | 0.489 | 0.565 |
| 3149 | 0.453 | 0.52 |
| 3150 | 0.445 | 0.475 |
| 3151 | 0.477 | 0.435 |
| 3152 | 0.546 | 0.406 |
| 3153 | 0.487 | 0.403 |
| 3154 | 0.447 | 0.402 |
| 3155 | 0.406 | 0.426 |
| 3156 | 0.394 | 0.47 |
| 3157 | 0.382 | 0.468 |
| 3158 | 0.407 | 0.455 |
| 3159 | 0.317 | 0.417 |
| 3160 | 0.346 | 0.384 |
| 3161 | 0.443 | 0.363 |
| 3162 | 0.502 | 0.366 |
| 3163 | 0.543 | 0.398 |
| 3164 | 0.602 | 0.412 |
| 3165 | 0.684 | 0.453 |
| 3166 | 0.741 | 0.484 |
| 3167 | 0.781 | 0.461 |
| 3168 | 0.84 | 0.448 |
| 3169 | 0.818 | 0.412 |
| 3170 | 0.81 | 0.363 |
| 3171 | 0.777 | 0.376 |
| 3172 | 0.717 | 0.38 |
| 3173 | 0.617 | 0.402 |
| 3174 | 0.54 | 0.469 |
| 3175 | 0.661 | 0.514 |
| 3176 | 0.744 | 0.559 |
| 3177 | 0.78 | 0.589 |
| 3178 | 0.759 | 0.586 |
| 3179 | 0.699 | 0.57 |
| 3180 | 0.602 | 0.58 |
| 3181 | 0.547 | 0.603 |
| 3182 | 0.496 | 0.639 |
| 3183 | 0.574 | 0.688 |
| 3184 | 0.628 | 0.726 |
| 3185 | 0.704 | 0.762 |
| 3186 | 0.643 | 0.785 |
| 3187 | 0.373 | 0.809 |
| 3188 | 0.166 | 0.807 |
| 3189 | 0.109 | 0.791 |
| 3190 | 0.088 | 0.769 |
| 3191 | 0.087 | 0.733 |
| 3192 | 0.089 | 0.711 |
| 3193 | 0.097 | 0.697 |
| 3194 | 0.133 | 0.643 |
| 3195 | 0.204 | 0.596 |
| 3196 | 0.263 | 0.555 |
| 3197 | 0.296 | 0.504 |
| 3198 | 0.307 | 0.496 |
| 3199 | 0.242 | 0.495 |
| 3200 | 0.105 | 0.498 |
| 3201 | 0.159 | 0.503 |
| 3202 | 0.321 | 0.516 |
| 3203 | 0.318 | 0.52 |
| 3204 | 0.273 | 0.529 |
| 3205 | 0.243 | 0.526 |
| 3206 | 0.242 | 0.538 |
| 3207 | 0.265 | 0.553 |
| 3208 | 0.266 | 0.559 |
| 3209 | 0.269 | 0.572 |
| 3210 | 0.219 | 0.578 |
| 3211 | 0.125 | 0.58 |
| 3212 | 0.046 | 0.581 |
| 3213 | 0.029 | 0.58 |
| 3214 | 0.026 | 0.571 |
| 3215 | 0.034 | 0.559 |
| 3216 | 0.034 | 0.553 |
| 3217 | 0.057 | 0.584 |
| 3218 | 0.104 | 0.63 |
| 3219 | 0.178 | 0.683 |
| 3220 | 0.219 | 0.742 |
| 3221 | 0.222 | 0.774 |
| 3222 | 0.211 | 0.791 |
| 3223 | 0.186 | 0.817 |
| 3224 | 0.114 | 0.84 |
| 3225 | 0.157 | 0.869 |
| 3226 | 0.204 | 0.893 |
| 3227 | 0.212 | 0.9 |
| 3228 | 0.168 | 0.9 |
| 3229 | 0.134 | 0.9 |
| 3230 | 0.146 | 0.885 |
| 3231 | 0.148 | 0.864 |
| 3232 | 0.169 | 0.854 |
| 3233 | 0.18 | 0.851 |
| 3234 | 0.205 | 0.849 |
| 3235 | 0.193 | 0.856 |
| 3236 | 0.281 | 0.847 |
| 3237 | 0.458 | 0.829 |
| 3238 | 0.58 | 0.827 |
| 3239 | 0.62 | 0.832 |
| 3240 | 0.608 | 0.845 |
| 3241 | 0.549 | 0.868 |
| 3242 | 0.486 | 0.886 |
| 3243 | 0.41 | 0.895 |
| 3244 | 0.333 | 0.899 |
| 3245 | 0.325 | 0.894 |
| 3246 | 0.297 | 0.884 |
| 3247 | 0.294 | 0.872 |
| 3248 | 0.254 | 0.861 |
| 3249 | 0.375 | 0.832 |
| 3250 | 0.392 | 0.838 |
| 3251 | 0.4 | 0.846 |
| 3252 | 0.442 | 0.843 |
| 3253 | 0.469 | 0.858 |
| 3254 | 0.465 | 0.831 |
| 3255 | 0.464 | 0.791 |
| 3256 | 0.413 | 0.758 |
| 3257 | 0.44 | 0.726 |
| 3258 | 0.451 | 0.705 |
| 3259 | 0.473 | 0.685 |
| 3260 | 0.624 | 0.664 |
| 3261 | 0.738 | 0.649 |
| 3262 | 0.815 | 0.632 |
| 3263 | 0.852 | 0.621 |
| 3264 | 0.855 | 0.601 |
| 3265 | 0.849 | 0.553 |
| 3266 | 0.807 | 0.502 |
| 3267 | 0.75 | 0.456 |
| 3268 | 0.628 | 0.425 |
| 3269 | 0.354 | 0.412 |
| 3270 | 0.217 | 0.397 |
| 3271 | 0.166 | 0.375 |
| 3272 | 0.119 | 0.347 |
| 3273 | 0.093 | 0.317 |
| 3274 | 0.079 | 0.282 |
| 3275 | 0.079 | 0.249 |
| 3276 | 0.07 | 0.202 |
| 3277 | 0.062 | 0.169 |
| 3278 | 0.055 | 0.149 |
| 3279 | 0.066 | 0.134 |
| 3280 | 0.077 | 0.152 |
| 3281 | 0.1 | 0.151 |
| 3282 | 0.152 | 0.147 |
| 3283 | 0.204 | 0.142 |
| 3284 | 0.329 | 0.125 |
| 3285 | 0.456 | 0.109 |
| 3286 | 0.482 | 0.089 |
| 3287 | 0.402 | 0.069 |
| 3288 | 0.337 | 0.049 |
| 3289 | 0.38 | 0.029 |
| 3290 | 0.302 | 0.018 |
| 3291 | 0.294 | 0.01 |
| 3292 | 0.317 | 0 |
| 3293 | 0.36 | 0 |
| 3294 | 0.375 | 0 |
| 3295 | 0.403 | 0 |
| 3296 | 0.497 | 0 |
| 3297 | 0.529 | 0 |
| 3298 | 0.555 | 0.007 |
| 3299 | 0.505 | 0.025 |
| 3300 | 0.499 | 0.053 |
| 3301 | 0.542 | 0.102 |
| 3302 | 0.591 | 0.148 |
| 3303 | 0.68 | 0.193 |
| 3304 | 0.749 | 0.226 |
| 3305 | 0.807 | 0.231 |
| 3306 | 0.851 | 0.214 |
| 3307 | 0.862 | 0.18 |
| 3308 | 0.872 | 0.158 |
| 3309 | 0.886 | 0.144 |
| 3310 | 0.894 | 0.148 |
| 3311 | 0.89 | 0.165 |
| 3312 | 0.889 | 0.164 |
| 3313 | 0.875 | 0.156 |
| 3314 | 0.864 | 0.117 |
| 3315 | 0.857 | 0.083 |
| 3316 | 0.835 | 0.064 |
| 3317 | 0.812 | 0.045 |
| 3318 | 0.832 | 0.055 |
| 3319 | 0.847 | 0.043 |
| 3320 | 0.862 | 0.024 |
| 3321 | 0.85 | 0.01 |
| 3322 | 0.823 | 0 |
| 3323 | 0.801 | 0.008 |
| 3324 | 0.766 | 0.025 |
| 3325 | 0.727 | 0.058 |
| 3326 | 0.695 | 0.098 |
| 3327 | 0.671 | 0.136 |
| 3328 | 0.66 | 0.176 |
| 3329 | 0.692 | 0.211 |
| 3330 | 0.709 | 0.221 |
| 3331 | 0.737 | 0.22 |
| 3332 | 0.798 | 0.195 |
| 3333 | 0.87 | 0.147 |
| 3334 | 0.888 | 0.109 |
| 3335 | 0.888 | 0.093 |
| 3336 | 0.869 | 0.097 |
| 3337 | 0.858 | 0.091 |
| 3338 | 0.83 | 0.089 |
| 3339 | 0.786 | 0.078 |
| 3340 | 0.771 | 0.067 |
| 3341 | 0.766 | 0.084 |
| 3342 | 0.749 | 0.118 |
| 3343 | 0.69 | 0.135 |
| 3344 | 0.701 | 0.163 |
| 3345 | 0.591 | 0.191 |
| 3346 | 0.561 | 0.218 |
| 3347 | 0.541 | 0.261 |
| 3348 | 0.474 | 0.306 |
| 3349 | 0.415 | 0.41 |
| 3350 | 0.411 | 0.51 |
| 3351 | 0.477 | 0.616 |
| 3352 | 0.53 | 0.707 |
| 3353 | 0.612 | 0.747 |
| 3354 | 0.717 | 0.786 |
| 3355 | 0.769 | 0.813 |
| 3356 | 0.776 | 0.837 |
| 3357 | 0.794 | 0.857 |
| 3358 | 0.809 | 0.873 |
| 3359 | 0.828 | 0.888 |
| 3360 | 0.807 | 0.899 |
| 3361 | 0.79 | 0.9 |
| 3362 | 0.78 | 0.884 |
| 3363 | 0.734 | 0.874 |
| 3364 | 0.68 | 0.872 |
| 3365 | 0.594 | 0.849 |
| 3366 | 0.556 | 0.849 |
| 3367 | 0.622 | 0.835 |
| 3368 | 0.762 | 0.787 |
| 3369 | 0.73 | 0.754 |
| 3370 | 0.637 | 0.703 |
| 3371 | 0.538 | 0.652 |
| 3372 | 0.46 | 0.624 |
| 3373 | 0.431 | 0.585 |
| 3374 | 0.479 | 0.557 |
| 3375 | 0.539 | 0.506 |
| 3376 | 0.577 | 0.451 |
| 3377 | 0.664 | 0.421 |
| 3378 | 0.666 | 0.395 |
| 3379 | 0.586 | 0.411 |
| 3380 | 0.492 | 0.438 |
| 3381 | 0.517 | 0.462 |
| 3382 | 0.584 | 0.488 |
| 3383 | 0.641 | 0.503 |
| 3384 | 0.642 | 0.513 |
| 3385 | 0.692 | 0.502 |
| 3386 | 0.725 | 0.454 |
| 3387 | 0.682 | 0.407 |
| 3388 | 0.631 | 0.379 |
| 3389 | 0.575 | 0.366 |
| 3390 | 0.528 | 0.381 |
| 3391 | 0.452 | 0.385 |
| 3392 | 0.492 | 0.382 |
| 3393 | 0.46 | 0.397 |
| 3394 | 0.355 | 0.41 |
| 3395 | 0.298 | 0.411 |
| 3396 | 0.28 | 0.397 |
| 3397 | 0.239 | 0.362 |
| 3398 | 0.201 | 0.336 |
| 3399 | 0.202 | 0.337 |
| 3400 | 0.256 | 0.342 |
| 3401 | 0.429 | 0.332 |
| 3402 | 0.501 | 0.318 |
| 3403 | 0.404 | 0.28 |
| 3404 | 0.273 | 0.236 |
| 3405 | 0.292 | 0.198 |
| 3406 | 0.344 | 0.129 |
| 3407 | 0.372 | 0.077 |
| 3408 | 0.426 | 0.034 |
| 3409 | 0.462 | 0.009 |
| 3410 | 0.494 | 0.059 |
| 3411 | 0.455 | 0.118 |
| 3412 | 0.376 | 0.197 |
| 3413 | 0.337 | 0.262 |
| 3414 | 0.258 | 0.285 |
| 3415 | 0.238 | 0.28 |
| 3416 | 0.298 | 0.251 |
| 3417 | 0.369 | 0.245 |
| 3418 | 0.386 | 0.272 |
| 3419 | 0.335 | 0.322 |
| 3420 | 0.266 | 0.384 |
| 3421 | 0.26 | 0.437 |
| 3422 | 0.279 | 0.47 |
| 3423 | 0.371 | 0.506 |
| 3424 | 0.451 | 0.547 |
| 3425 | 0.445 | 0.597 |
| 3426 | 0.414 | 0.634 |
| 3427 | 0.415 | 0.71 |
| 3428 | 0.486 | 0.781 |
| 3429 | 0.467 | 0.833 |
| 3430 | 0.445 | 0.889 |
| 3431 | 0.399 | 0.897 |
| 3432 | 0.388 | 0.9 |
| 3433 | 0.527 | 0.897 |
| 3434 | 0.553 | 0.891 |
| 3435 | 0.522 | 0.876 |
| 3436 | 0.497 | 0.806 |
| 3437 | 0.402 | 0.734 |
| 3438 | 0.29 | 0.659 |
| 3439 | 0.243 | 0.59 |
| 3440 | 0.204 | 0.576 |
| 3441 | 0.243 | 0.561 |
| 3442 | 0.238 | 0.544 |
| 3443 | 0.263 | 0.547 |
| 3444 | 0.323 | 0.559 |
| 3445 | 0.361 | 0.578 |
| 3446 | 0.31 | 0.67 |
| 3447 | 0.272 | 0.736 |
| 3448 | 0.28 | 0.79 |
| 3449 | 0.297 | 0.841 |
| 3450 | 0.318 | 0.82 |
| 3451 | 0.393 | 0.8 |
| 3452 | 0.44 | 0.777 |
| 3453 | 0.529 | 0.748 |
| 3454 | 0.511 | 0.719 |
| 3455 | 0.518 | 0.688 |
| 3456 | 0.56 | 0.647 |
| 3457 | 0.507 | 0.604 |
| 3458 | 0.525 | 0.55 |
| 3459 | 0.427 | 0.507 |
| 3460 | 0.371 | 0.496 |
| 3461 | 0.334 | 0.515 |
| 3462 | 0.217 | 0.544 |
| 3463 | 0.185 | 0.537 |
| 3464 | 0.212 | 0.529 |
| 3465 | 0.257 | 0.49 |
| 3466 | 0.309 | 0.457 |
| 3467 | 0.314 | 0.454 |
| 3468 | 0.325 | 0.407 |
| 3469 | 0.42 | 0.349 |
| 3470 | 0.352 | 0.312 |
| 3471 | 0.348 | 0.283 |
| 3472 | 0.281 | 0.288 |
| 3473 | 0.239 | 0.326 |
| 3474 | 0.182 | 0.349 |
| 3475 | 0.177 | 0.357 |
| 3476 | 0.251 | 0.364 |
| 3477 | 0.318 | 0.361 |
| 3478 | 0.384 | 0.348 |
| 3479 | 0.39 | 0.34 |
| 3480 | 0.268 | 0.316 |
| 3481 | 0.296 | 0.256 |
| 3482 | 0.353 | 0.196 |
| 3483 | 0.312 | 0.142 |
| 3484 | 0.26 | 0.141 |
| 3485 | 0.246 | 0.183 |
| 3486 | 0.35 | 0.222 |
| 3487 | 0.18 | 0.257 |
| 3488 | 0.173 | 0.25 |
| 3489 | 0.172 | 0.235 |
| 3490 | 0.164 | 0.228 |
| 3491 | 0.092 | 0.223 |
| 3492 | 0.06 | 0.214 |
| 3493 | 0.062 | 0.203 |
| 3494 | 0.101 | 0.193 |
| 3495 | 0.176 | 0.189 |
| 3496 | 0.263 | 0.192 |
| 3497 | 0.277 | 0.203 |
| 3498 | 0.214 | 0.215 |
| 3499 | 0.273 | 0.218 |
| 3500 | 0.245 | 0.215 |
| 3501 | 0.234 | 0.204 |
| 3502 | 0.149 | 0.19 |
| 3503 | 0.168 | 0.168 |
| 3504 | 0.154 | 0.162 |
| 3505 | 0.153 | 0.19 |
| 3506 | 0.196 | 0.213 |
| 3507 | 0.152 | 0.256 |
| 3508 | 0.136 | 0.295 |
| 3509 | 0.092 | 0.289 |
| 3510 | 0.077 | 0.287 |
| 3511 | 0.071 | 0.273 |
| 3512 | 0.06 | 0.248 |
| 3513 | 0.061 | 0.225 |
| 3514 | 0.044 | 0.215 |
| 3515 | 0.036 | 0.202 |
| 3516 | 0.042 | 0.187 |
| 3517 | 0.066 | 0.14 |
| 3518 | 0.123 | 0.088 |
| 3519 | 0.176 | 0.041 |
| 3520 | 0.201 | 0.001 |
| 3521 | 0.223 | 0.001 |
| 3522 | 0.223 | 0.001 |
| 3523 | 0.186 | 0 |
| 3524 | 0.145 | 0 |
| 3525 | 0.167 | 0 |
| 3526 | 0.16 | 0 |
| 3527 | 0.109 | 0.02 |
| 3528 | 0.092 | 0.049 |
| 3529 | 0.1 | 0.085 |
| 3530 | 0.104 | 0.109 |
| 3531 | 0.065 | 0.13 |
| 3532 | 0.038 | 0.137 |
| 3533 | 0.045 | 0.16 |
| 3534 | 0.081 | 0.194 |
| 3535 | 0.061 | 0.197 |
| 3536 | 0.062 | 0.196 |
| 3537 | 0.136 | 0.165 |
| 3538 | 0.165 | 0.116 |
| 3539 | 0.202 | 0.079 |
| 3540 | 0.213 | 0.042 |
| 3541 | 0.205 | 0.022 |
| 3542 | 0.195 | 0.012 |
| 3543 | 0.158 | 0.007 |
| 3544 | 0.138 | 0.007 |
| 3545 | 0.151 | 0 |
| 3546 | 0.162 | 0 |
| 3547 | 0.134 | 0.006 |
| 3548 | 0.104 | 0.031 |
| 3549 | 0.114 | 0.064 |
| 3550 | 0.108 | 0.104 |
| 3551 | 0.094 | 0.154 |
| 3552 | 0.06 | 0.198 |
| 3553 | 0.04 | 0.244 |
| 3554 | 0.028 | 0.293 |
| 3555 | 0.023 | 0.334 |
| 3556 | 0.018 | 0.371 |
| 3557 | 0.015 | 0.408 |
| 3558 | 0.011 | 0.451 |
| 3559 | 0.009 | 0.492 |
| 3560 | 0 | 0.529 |
| 3561 | 0.007 | 0.562 |
| 3562 | 0.017 | 0.539 |
| 3563 | 0.035 | 0.501 |
| 3564 | 0.04 | 0.456 |
| 3565 | 0.049 | 0.422 |
| 3566 | 0.056 | 0.436 |
| 3567 | 0.057 | 0.466 |
| 3568 | 0.055 | 0.517 |
| 3569 | 0.044 | 0.542 |
| 3570 | 0.031 | 0.562 |
| 3571 | 0.019 | 0.587 |
| 3572 | 0.021 | 0.581 |
| 3573 | 0.031 | 0.542 |
| 3574 | 0.037 | 0.507 |
| 3575 | 0.047 | 0.464 |
| 3576 | 0.055 | 0.427 |
| 3577 | 0.052 | 0.354 |
| 3578 | 0.052 | 0.278 |
| 3579 | 0.047 | 0.205 |
| 3580 | 0.047 | 0.149 |
| 3581 | 0.042 | 0.192 |
| 3582 | 0.035 | 0.226 |
| 3583 | 0.027 | 0.248 |
| 3584 | 0.008 | 0.229 |
| 3585 | 0.007 | 0.184 |
| 3586 | 0.013 | 0.131 |
| 3587 | 0.02 | 0.118 |
| 3588 | 0.038 | 0.145 |
| 3589 | 0.05 | 0.158 |
| 3590 | 0.059 | 0.185 |
| 3591 | 0.066 | 0.167 |
| 3592 | 0.069 | 0.132 |
| 3593 | 0.064 | 0.112 |
| 3594 | 0.057 | 0.094 |
| 3595 | 0.058 | 0.079 |
| 3596 | 0.065 | 0.081 |
| 3597 | 0.094 | 0.086 |
| 3598 | 0.118 | 0.095 |
| 3599 | 0.128 | 0.112 |
| 3600 | 0.146 | 0.115 |
| 3601 | 0.191 | 0.101 |
| 3602 | 0.176 | 0.075 |
| 3603 | 0.148 | 0.052 |
| 3604 | 0.11 | 0.049 |
| 3605 | 0.065 | 0.066 |
| 3606 | 0.043 | 0.103 |
| 3607 | 0.022 | 0.144 |
| 3608 | 0.011 | 0.166 |
| 3609 | 0.011 | 0.165 |
| 3610 | 0.014 | 0.15 |
| 3611 | 0.019 | 0.113 |
| 3612 | 0.019 | 0.067 |
| 3613 | 0.025 | 0.038 |
| 3614 | 0.021 | 0.013 |
| 3615 | 0.019 | 0 |
| 3616 | 0.029 | 0 |
| 3617 | 0.028 | 0.008 |
| 3618 | 0.045 | 0.027 |
| 3619 | 0.074 | 0.057 |
| 3620 | 0.143 | 0.097 |
| 3621 | 0.238 | 0.137 |
| 3622 | 0.306 | 0.146 |
| 3623 | 0.378 | 0.142 |
| 3624 | 0.412 | 0.115 |
| 3625 | 0.444 | 0.078 |
| 3626 | 0.429 | 0.05 |
| 3627 | 0.389 | 0.024 |
| 3628 | 0.369 | 0.011 |
| 3629 | 0.35 | 0.017 |
| 3630 | 0.309 | 0.047 |
| 3631 | 0.229 | 0.078 |
| 3632 | 0.228 | 0.09 |
| 3633 | 0.214 | 0.073 |
| 3634 | 0.218 | 0.05 |
| 3635 | 0.238 | 0.021 |
| 3636 | 0.225 | 0.016 |
| 3637 | 0.272 | 0.046 |
| 3638 | 0.302 | 0.083 |
| 3639 | 0.364 | 0.135 |
| 3640 | 0.469 | 0.174 |
| 3641 | 0.507 | 0.194 |
| 3642 | 0.551 | 0.178 |
| 3643 | 0.559 | 0.143 |
| 3644 | 0.574 | 0.096 |
| 3645 | 0.715 | 0.053 |
| 3646 | 0.778 | 0.046 |
| 3647 | 0.792 | 0.048 |
| 3648 | 0.803 | 0.048 |
| 3649 | 0.792 | 0.043 |
| 3650 | 0.772 | 0.02 |
| 3651 | 0.768 | 0.018 |
| 3652 | 0.769 | 0.042 |
| 3653 | 0.76 | 0.052 |
| 3654 | 0.735 | 0.057 |
| 3655 | 0.712 | 0.039 |
| 3656 | 0.705 | 0.015 |
| 3657 | 0.61 | 0.012 |
| 3658 | 0.305 | 0.019 |
| 3659 | 0.278 | 0.029 |
| 3660 | 0.29 | 0.029 |
| 3661 | 0.324 | 0.022 |
| 3662 | 0.341 | 0.01 |
| 3663 | 0.323 | 0 |
| 3664 | 0.308 | 0 |
| 3665 | 0.328 | 0 |
| 3666 | 0.342 | 0 |
| 3667 | 0.395 | 0 |
| 3668 | 0.4 | 0 |
| 3669 | 0.455 | 0.001 |
| 3670 | 0.508 | 0.016 |
| 3671 | 0.536 | 0.072 |
| 3672 | 0.543 | 0.132 |
| 3673 | 0.534 | 0.21 |
| 3674 | 0.556 | 0.265 |
| 3675 | 0.572 | 0.277 |
| 3676 | 0.53 | 0.293 |
| 3677 | 0.484 | 0.289 |
| 3678 | 0.446 | 0.316 |
| 3679 | 0.371 | 0.356 |
| 3680 | 0.398 | 0.39 |
| 3681 | 0.33 | 0.434 |
| 3682 | 0.272 | 0.422 |
| 3683 | 0.257 | 0.382 |
| 3684 | 0.265 | 0.34 |
| 3685 | 0.3 | 0.3 |
| 3686 | 0.35 | 0.284 |
| 3687 | 0.409 | 0.286 |
| 3688 | 0.455 | 0.278 |
| 3689 | 0.503 | 0.256 |
| 3690 | 0.559 | 0.252 |
| 3691 | 0.608 | 0.261 |
| 3692 | 0.569 | 0.279 |
| 3693 | 0.623 | 0.313 |
| 3694 | 0.704 | 0.33 |
| 3695 | 0.762 | 0.325 |
| 3696 | 0.793 | 0.326 |
| 3697 | 0.787 | 0.316 |
| 3698 | 0.783 | 0.312 |
| 3699 | 0.755 | 0.311 |
| 3700 | 0.743 | 0.261 |
| 3701 | 0.718 | 0.201 |
| 3702 | 0.68 | 0.122 |
| 3703 | 0.634 | 0.049 |
| 3704 | 0.656 | 0.027 |
| 3705 | 0.594 | 0.009 |
| 3706 | 0.5 | 0.009 |
| 3707 | 0.435 | 0.009 |
| 3708 | 0.456 | 0.001 |
| 3709 | 0.508 | 0.002 |
| 3710 | 0.558 | 0.019 |
| 3711 | 0.591 | 0.037 |
| 3712 | 0.619 | 0.072 |
| 3713 | 0.649 | 0.097 |
| 3714 | 0.691 | 0.094 |
| 3715 | 0.66 | 0.076 |
| 3716 | 0.644 | 0.039 |
| 3717 | 0.702 | 0.013 |
| 3718 | 0.766 | 0 |
| 3719 | 0.804 | 0 |
| 3720 | 0.827 | 0.01 |
| 3721 | 0.804 | 0.03 |
| 3722 | 0.801 | 0.043 |
| 3723 | 0.796 | 0.043 |
| 3724 | 0.758 | 0.037 |
| 3725 | 0.715 | 0.033 |
| 3726 | 0.697 | 0.055 |
| 3727 | 0.63 | 0.102 |
| 3728 | 0.674 | 0.145 |
| 3729 | 0.62 | 0.179 |
| 3730 | 0.466 | 0.2 |
| 3731 | 0.386 | 0.204 |
| 3732 | 0.302 | 0.207 |
| 3733 | 0.316 | 0.2 |
| 3734 | 0.409 | 0.176 |
| 3735 | 0.501 | 0.164 |
| 3736 | 0.562 | 0.149 |
| 3737 | 0.548 | 0.12 |
| 3738 | 0.56 | 0.097 |
| 3739 | 0.552 | 0.068 |
| 3740 | 0.495 | 0.058 |
| 3741 | 0.548 | 0.079 |
| 3742 | 0.605 | 0.098 |
| 3743 | 0.599 | 0.139 |
| 3744 | 0.516 | 0.153 |
| 3745 | 0.546 | 0.154 |
| 3746 | 0.61 | 0.139 |
| 3747 | 0.52 | 0.105 |
| 3748 | 0.406 | 0.103 |
| 3749 | 0.316 | 0.116 |
| 3750 | 0.199 | 0.14 |
| 3751 | 0.19 | 0.157 |
| 3752 | 0.228 | 0.155 |
| 3753 | 0.298 | 0.15 |
| 3754 | 0.454 | 0.17 |
| 3755 | 0.534 | 0.195 |
| 3756 | 0.594 | 0.217 |
| 3757 | 0.668 | 0.2 |
| 3758 | 0.743 | 0.17 |
| 3759 | 0.775 | 0.147 |
| 3760 | 0.814 | 0.092 |
| 3761 | 0.833 | 0.099 |
| 3762 | 0.836 | 0.081 |
| 3763 | 0.841 | 0.052 |
| 3764 | 0.831 | 0.055 |
| 3765 | 0.823 | 0.022 |
| 3766 | 0.775 | 0.013 |
| 3767 | 0.685 | 0.006 |
| 3768 | 0.523 | 0 |
| 3769 | 0.225 | 0.003 |
| 3770 | 0.276 | 0.011 |
| 3771 | 0.37 | 0.014 |
| 3772 | 0.486 | 0.016 |
| 3773 | 0.547 | 0.013 |
| 3774 | 0.49 | 0.005 |
| 3775 | 0.545 | 0.002 |
| 3776 | 0.66 | 0 |
| 3777 | 0.682 | 0 |
| 3778 | 0.714 | 0.002 |
| 3779 | 0.656 | 0.002 |
| 3780 | 0.634 | 0.002 |
| 3781 | 0.491 | 0.004 |
| 3782 | 0.408 | 0.023 |
| 3783 | 0.325 | 0.035 |
| 3784 | 0.304 | 0.039 |
| 3785 | 0.298 | 0.037 |
| 3786 | 0.36 | 0.016 |
| 3787 | 0.436 | 0.004 |
| 3788 | 0.464 | 0.007 |
| 3789 | 0.44 | 0.021 |
| 3790 | 0.499 | 0.054 |
| 3791 | 0.572 | 0.079 |
| 3792 | 0.605 | 0.08 |
| 3793 | 0.631 | 0.07 |
| 3794 | 0.328 | 0.072 |
| 3795 | 0.495 | 0.095 |
| 3796 | 0.493 | 0.142 |
| 3797 | 0.254 | 0.215 |
| 3798 | 0.303 | 0.254 |
| 3799 | 0.448 | 0.262 |
| 3800 | 0.38 | 0.264 |
| 3801 | 0.224 | 0.257 |
| 3802 | 0.189 | 0.278 |
| 3803 | 0.17 | 0.324 |
| 3804 | 0.166 | 0.386 |
| 3805 | 0.159 | 0.44 |
| 3806 | 0.116 | 0.477 |
| 3807 | 0.145 | 0.515 |
| 3808 | 0.234 | 0.523 |
| 3809 | 0.201 | 0.534 |
| 3810 | 0.172 | 0.536 |
| 3811 | 0.159 | 0.515 |
| 3812 | 0.174 | 0.488 |
| 3813 | 0.152 | 0.48 |
| 3814 | 0.176 | 0.465 |
| 3815 | 0.221 | 0.464 |
| 3816 | 0.331 | 0.502 |
| 3817 | 0.588 | 0.527 |
| 3818 | 0.612 | 0.545 |
| 3819 | 0.41 | 0.53 |
| 3820 | 0.73 | 0.486 |
| 3821 | 0.622 | 0.429 |
| 3822 | 0.409 | 0.373 |
| 3823 | 0.24 | 0.357 |
| 3824 | 0.14 | 0.351 |
| 3825 | 0.3 | 0.367 |
| 3826 | 0.26 | 0.402 |
| 3827 | 0.197 | 0.444 |
| 3828 | 0.188 | 0.5 |
| 3829 | 0.138 | 0.531 |
| 3830 | 0.143 | 0.555 |
| 3831 | 0.172 | 0.583 |
| 3832 | 0.238 | 0.598 |
| 3833 | 0.317 | 0.627 |
| 3834 | 0.367 | 0.641 |
| 3835 | 0.234 | 0.631 |
| 3836 | 0.126 | 0.608 |
| 3837 | 0.154 | 0.569 |
| 3838 | 0.214 | 0.541 |
| 3839 | 0.239 | 0.505 |
| 3840 | 0.323 | 0.458 |
| 3841 | 0.263 | 0.443 |
| 3842 | 0.309 | 0.408 |
| 3843 | 0.345 | 0.386 |
| 3844 | 0.373 | 0.366 |
| 3845 | 0.35 | 0.317 |
| 3846 | 0.339 | 0.276 |
| 3847 | 0.25 | 0.258 |
| 3848 | 0.191 | 0.232 |
| 3849 | 0.138 | 0.191 |
| 3850 | 0.114 | 0.164 |
| 3851 | 0.083 | 0.116 |
| 3852 | 0.068 | 0.086 |
| 3853 | 0.06 | 0.076 |
| 3854 | 0.047 | 0.069 |
| 3855 | 0.035 | 0.066 |
| 3856 | 0.023 | 0.057 |
| 3857 | 0.017 | 0.047 |
| 3858 | 0.023 | 0.031 |
| 3859 | 0.029 | 0.013 |
| 3860 | 0.049 | 0.011 |
| 3861 | 0.113 | 0.022 |
| 3862 | 0.191 | 0.024 |
| 3863 | 0.29 | 0.024 |
| 3864 | 0.352 | 0.024 |
| 3865 | 0.424 | 0.01 |
| 3866 | 0.49 | 0.015 |
| 3867 | 0.503 | 0.024 |
| 3868 | 0.567 | 0.032 |
| 3869 | 0.589 | 0.056 |
| 3870 | 0.628 | 0.059 |
| 3871 | 0.599 | 0.05 |
| 3872 | 0.513 | 0.056 |
| 3873 | 0.505 | 0.076 |
| 3874 | 0.489 | 0.117 |
| 3875 | 0.445 | 0.18 |
| 3876 | 0.417 | 0.227 |
| 3877 | 0.422 | 0.254 |
| 3878 | 0.414 | 0.277 |
| 3879 | 0.436 | 0.296 |
| 3880 | 0.458 | 0.311 |
| 3881 | 0.484 | 0.322 |
| 3882 | 0.424 | 0.337 |
| 3883 | 0.591 | 0.359 |
| 3884 | 0.666 | 0.381 |
| 3885 | 0.721 | 0.408 |
| 3886 | 0.713 | 0.409 |
| 3887 | 0.712 | 0.396 |
| 3888 | 0.726 | 0.379 |
| 3889 | 0.724 | 0.35 |
| 3890 | 0.716 | 0.334 |
| 3891 | 0.716 | 0.308 |
| 3892 | 0.676 | 0.267 |
| 3893 | 0.581 | 0.276 |
| 3894 | 0.399 | 0.282 |
| 3895 | 0.263 | 0.292 |
| 3896 | 0.29 | 0.328 |
| 3897 | 0.293 | 0.328 |
| 3898 | 0.235 | 0.329 |
| 3899 | 0.182 | 0.327 |
| 3900 | 0.128 | 0.313 |
| 3901 | 0.099 | 0.311 |
| 3902 | 0.1 | 0.31 |
| 3903 | 0.134 | 0.306 |
| 3904 | 0.144 | 0.291 |
| 3905 | 0.276 | 0.252 |
| 3906 | 0.416 | 0.202 |
| 3907 | 0.473 | 0.16 |
| 3908 | 0.46 | 0.128 |
| 3909 | 0.415 | 0.09 |
| 3910 | 0.359 | 0.059 |
| 3911 | 0.294 | 0.031 |
| 3912 | 0.244 | 0.016 |
| 3913 | 0.201 | 0.018 |
| 3914 | 0.172 | 0.023 |
| 3915 | 0.183 | 0.024 |
| 3916 | 0.192 | 0.036 |
| 3917 | 0.174 | 0.045 |
| 3918 | 0.13 | 0.05 |
| 3919 | 0.067 | 0.059 |
| 3920 | 0.043 | 0.042 |
| 3921 | 0.032 | 0.023 |
| 3922 | 0.027 | 0.014 |
| 3923 | 0.021 | 0.004 |
| 3924 | 0.019 | 0 |
| 3925 | 0.021 | 0.01 |
| 3926 | 0.029 | 0.03 |
| 3927 | 0.048 | 0.048 |
| 3928 | 0.093 | 0.064 |
| 3929 | 0.149 | 0.06 |
| 3930 | 0.262 | 0.043 |
| 3931 | 0.418 | 0.024 |
| 3932 | 0.398 | 0.009 |
| 3933 | 0.417 | 0.016 |
| 3934 | 0.403 | 0.013 |
| 3935 | 0.465 | 0.028 |
| 3936 | 0.482 | 0.052 |
| 3937 | 0.408 | 0.085 |
| 3938 | 0.348 | 0.138 |
| 3939 | 0.28 | 0.19 |
| 3940 | 0.347 | 0.254 |
| 3941 | 0.364 | 0.306 |
| 3942 | 0.408 | 0.369 |
| 3943 | 0.514 | 0.451 |
| 3944 | 0.504 | 0.493 |
| 3945 | 0.556 | 0.509 |
| 3946 | 0.631 | 0.495 |
| 3947 | 0.672 | 0.446 |
| 3948 | 0.696 | 0.404 |
| 3949 | 0.678 | 0.376 |
| 3950 | 0.646 | 0.352 |
| 3951 | 0.591 | 0.329 |
| 3952 | 0.541 | 0.289 |
| 3953 | 0.573 | 0.24 |
| 3954 | 0.655 | 0.2 |
| 3955 | 0.708 | 0.16 |
| 3956 | 0.782 | 0.143 |
| 3957 | 0.843 | 0.122 |
| 3958 | 0.849 | 0.102 |
| 3959 | 0.852 | 0.102 |
| 3960 | 0.866 | 0.115 |
| 3961 | 0.864 | 0.148 |
| 3962 | 0.814 | 0.197 |
| 3963 | 0.806 | 0.236 |
| 3964 | 0.831 | 0.272 |
| 3965 | 0.806 | 0.309 |
| 3966 | 0.76 | 0.324 |
| 3967 | 0.706 | 0.321 |
| 3968 | 0.658 | 0.324 |
| 3969 | 0.598 | 0.325 |
| 3970 | 0.403 | 0.33 |
| 3971 | 0.247 | 0.345 |
| 3972 | 0.164 | 0.335 |
| 3973 | 0.134 | 0.312 |
| 3974 | 0.148 | 0.288 |
| 3975 | 0.181 | 0.263 |
| 3976 | 0.258 | 0.25 |
| 3977 | 0.394 | 0.244 |
| 3978 | 0.579 | 0.236 |
| 3979 | 0.649 | 0.226 |
| 3980 | 0.718 | 0.227 |
| 3981 | 0.671 | 0.207 |
| 3982 | 0.724 | 0.19 |
| 3983 | 0.747 | 0.198 |
| 3984 | 0.74 | 0.212 |
| 3985 | 0.729 | 0.256 |
| 3986 | 0.705 | 0.3 |
| 3987 | 0.704 | 0.316 |
| 3988 | 0.695 | 0.317 |
| 3989 | 0.703 | 0.305 |
| 3990 | 0.707 | 0.27 |
| 3991 | 0.706 | 0.234 |
| 3992 | 0.742 | 0.197 |
| 3993 | 0.737 | 0.155 |
| 3994 | 0.7 | 0.13 |
| 3995 | 0.693 | 0.106 |
| 3996 | 0.7 | 0.07 |
| 3997 | 0.709 | 0.045 |
| 3998 | 0.695 | 0.043 |
| 3999 | 0.649 | 0.049 |
| 4000 | 0.615 | 0.053 |
| 4001 | 0.65 | 0.052 |
| 4002 | 0.696 | 0.031 |
| 4003 | 0.671 | 0.017 |
| 4004 | 0.642 | 0.033 |
| 4005 | 0.644 | 0.054 |
| 4006 | 0.666 | 0.114 |
| 4007 | 0.698 | 0.16 |
| 4008 | 0.747 | 0.208 |
| 4009 | 0.769 | 0.271 |
| 4010 | 0.773 | 0.306 |
| 4011 | 0.768 | 0.349 |
| 4012 | 0.738 | 0.372 |
| 4013 | 0.729 | 0.366 |
| 4014 | 0.728 | 0.329 |
| 4015 | 0.753 | 0.249 |
| 4016 | 0.787 | 0.172 |
| 4017 | 0.816 | 0.104 |
| 4018 | 0.792 | 0.059 |
| 4019 | 0.73 | 0.047 |
| 4020 | 0.675 | 0.035 |
| 4021 | 0.611 | 0.022 |
| 4022 | 0.574 | 0.008 |
| 4023 | 0.552 | 0 |
| 4024 | 0.581 | 0 |
| 4025 | 0.622 | 0.013 |
| 4026 | 0.67 | 0.033 |
| 4027 | 0.693 | 0.064 |
| 4028 | 0.647 | 0.083 |
| 4029 | 0.659 | 0.089 |
| 4030 | 0.612 | 0.094 |
| 4031 | 0.501 | 0.089 |
| 4032 | 0.427 | 0.093 |
| 4033 | 0.408 | 0.096 |
| 4034 | 0.515 | 0.09 |
| 4035 | 0.634 | 0.073 |
| 4036 | 0.683 | 0.054 |
| 4037 | 0.669 | 0.047 |
| 4038 | 0.638 | 0.028 |
| 4039 | 0.636 | 0.019 |
| 4040 | 0.688 | 0.015 |
| 4041 | 0.72 | 0 |
| 4042 | 0.727 | 0.072 |
| 4043 | 0.664 | 0.157 |
| 4044 | 0.617 | 0.247 |
| 4045 | 0.535 | 0.341 |
| 4046 | 0.495 | 0.374 |
| 4047 | 0.484 | 0.375 |
| 4048 | 0.528 | 0.376 |
| 4049 | 0.503 | 0.379 |
| 4050 | 0.495 | 0.339 |
| 4051 | 0.554 | 0.309 |
| 4052 | 0.53 | 0.283 |
| 4053 | 0.372 | 0.252 |
| 4054 | 0.38 | 0.266 |
| 4055 | 0.56 | 0.29 |
| 4056 | 0.766 | 0.318 |
| 4057 | 0.785 | 0.339 |
| 4058 | 0.798 | 0.34 |
| 4059 | 0.791 | 0.346 |
| 4060 | 0.661 | 0.348 |
| 4061 | 0.637 | 0.346 |
| 4062 | 0.557 | 0.338 |
| 4063 | 0.501 | 0.319 |
| 4064 | 0.531 | 0.273 |
| 4065 | 0.559 | 0.229 |
| 4066 | 0.514 | 0.191 |
| 4067 | 0.506 | 0.154 |
| 4068 | 0.49 | 0.128 |
| 4069 | 0.45 | 0.116 |
| 4070 | 0.429 | 0.122 |
| 4071 | 0.506 | 0.142 |
| 4072 | 0.547 | 0.176 |
| 4073 | 0.605 | 0.207 |
| 4074 | 0.612 | 0.236 |
| 4075 | 0.591 | 0.255 |
| 4076 | 0.599 | 0.281 |
| 4077 | 0.517 | 0.302 |
| 4078 | 0.332 | 0.301 |
| 4079 | 0.19 | 0.299 |
| 4080 | 0.136 | 0.303 |
| 4081 | 0.107 | 0.291 |
| 4082 | 0.13 | 0.276 |
| 4083 | 0.198 | 0.252 |
| 4084 | 0.238 | 0.203 |
| 4085 | 0.235 | 0.178 |
| 4086 | 0.249 | 0.175 |
| 4087 | 0.171 | 0.192 |
| 4088 | 0.145 | 0.198 |
| 4089 | 0.116 | 0.189 |
| 4090 | 0.109 | 0.166 |
| 4091 | 0.118 | 0.134 |
| 4092 | 0.138 | 0.14 |
| 4093 | 0.141 | 0.171 |
| 4094 | 0.11 | 0.219 |
| 4095 | 0.131 | 0.264 |
| 4096 | 0.15 | 0.3 |
| 4097 | 0.151 | 0.343 |
| 4098 | 0.133 | 0.384 |
| 4099 | 0.11 | 0.426 |
| 4100 | 0.158 | 0.459 |
| 4101 | 0.194 | 0.471 |
| 4102 | 0.191 | 0.484 |
| 4103 | 0.198 | 0.515 |
| 4104 | 0.269 | 0.547 |
| 4105 | 0.302 | 0.575 |
| 4106 | 0.323 | 0.618 |
| 4107 | 0.315 | 0.642 |
| 4108 | 0.267 | 0.656 |
| 4109 | 0.316 | 0.664 |
| 4110 | 0.469 | 0.631 |
| 4111 | 0.443 | 0.6 |
| 4112 | 0.501 | 0.594 |
| 4113 | 0.38 | 0.599 |
| 4114 | 0.306 | 0.63 |
| 4115 | 0.253 | 0.666 |
| 4116 | 0.213 | 0.691 |
| 4117 | 0.217 | 0.724 |
| 4118 | 0.248 | 0.737 |
| 4119 | 0.265 | 0.723 |
| 4120 | 0.286 | 0.693 |
| 4121 | 0.334 | 0.645 |
| 4122 | 0.34 | 0.601 |
| 4123 | 0.296 | 0.578 |
| 4124 | 0.26 | 0.562 |
| 4125 | 0.312 | 0.552 |
| 4126 | 0.354 | 0.571 |
| 4127 | 0.327 | 0.597 |
| 4128 | 0.306 | 0.636 |
| 4129 | 0.361 | 0.684 |
| 4130 | 0.382 | 0.721 |
| 4131 | 0.381 | 0.762 |
| 4132 | 0.316 | 0.788 |
| 4133 | 0.319 | 0.799 |
| 4134 | 0.358 | 0.791 |
| 4135 | 0.37 | 0.768 |
| 4136 | 0.373 | 0.732 |
| 4137 | 0.436 | 0.719 |
| 4138 | 0.407 | 0.717 |
| 4139 | 0.332 | 0.738 |
| 4140 | 0.257 | 0.774 |
| 4141 | 0.214 | 0.787 |
| 4142 | 0.175 | 0.792 |
| 4143 | 0.175 | 0.731 |
| 4144 | 0.175 | 0.661 |
| 4145 | 0.243 | 0.588 |
| 4146 | 0.368 | 0.511 |
| 4147 | 0.425 | 0.489 |
| 4148 | 0.364 | 0.486 |
| 4149 | 0.407 | 0.49 |
| 4150 | 0.503 | 0.496 |
| 4151 | 0.591 | 0.498 |
| 4152 | 0.632 | 0.495 |
| 4153 | 0.641 | 0.494 |
| 4154 | 0.514 | 0.508 |
| 4155 | 0.414 | 0.516 |
| 4156 | 0.332 | 0.526 |
| 4157 | 0.53 | 0.537 |
| 4158 | 0.629 | 0.538 |
| 4159 | 0.554 | 0.545 |
| 4160 | 0.529 | 0.546 |
| 4161 | 0.292 | 0.546 |
| 4162 | 0.233 | 0.571 |
| 4163 | 0.183 | 0.594 |
| 4164 | 0.132 | 0.624 |
| 4165 | 0.056 | 0.656 |
| 4166 | 0.047 | 0.675 |
| 4167 | 0.051 | 0.714 |
| 4168 | 0.059 | 0.755 |
| 4169 | 0.077 | 0.8 |
| 4170 | 0.099 | 0.839 |
| 4171 | 0.127 | 0.848 |
| 4172 | 0.142 | 0.859 |
| 4173 | 0.171 | 0.866 |
| 4174 | 0.185 | 0.874 |
| 4175 | 0.169 | 0.891 |
| 4176 | 0.149 | 0.894 |
| 4177 | 0.164 | 0.894 |
| 4178 | 0.119 | 0.894 |
| 4179 | 0.104 | 0.856 |
| 4180 | 0.147 | 0.82 |
| 4181 | 0.152 | 0.782 |
| 4182 | 0.171 | 0.738 |
| 4183 | 0.104 | 0.742 |
| 4184 | 0.118 | 0.765 |
| 4185 | 0.182 | 0.796 |
| 4186 | 0.194 | 0.841 |
| 4187 | 0.182 | 0.875 |
| 4188 | 0.119 | 0.891 |
| 4189 | 0.187 | 0.877 |
| 4190 | 0.231 | 0.861 |
| 4191 | 0.213 | 0.853 |
| 4192 | 0.11 | 0.842 |
| 4193 | 0.124 | 0.85 |
| 4194 | 0.226 | 0.85 |
| 4195 | 0.235 | 0.832 |
| 4196 | 0.249 | 0.826 |
| 4197 | 0.306 | 0.833 |
| 4198 | 0.351 | 0.85 |
| 4199 | 0.393 | 0.871 |
| 4200 | 0.409 | 0.877 |
| 4201 | 0.455 | 0.874 |
| 4202 | 0.356 | 0.854 |
| 4203 | 0.332 | 0.837 |
| 4204 | 0.238 | 0.818 |
| 4205 | 0.184 | 0.788 |
| 4206 | 0.2 | 0.762 |
| 4207 | 0.139 | 0.726 |
| 4208 | 0.109 | 0.692 |
| 4209 | 0.12 | 0.655 |
| 4210 | 0.074 | 0.613 |
| 4211 | 0.056 | 0.575 |
| 4212 | 0.07 | 0.542 |
| 4213 | 0.078 | 0.515 |
| 4214 | 0.077 | 0.501 |
| 4215 | 0.178 | 0.472 |
| 4216 | 0.203 | 0.436 |
| 4217 | 0.195 | 0.403 |
| 4218 | 0.204 | 0.363 |
| 4219 | 0.336 | 0.315 |
| 4220 | 0.339 | 0.256 |
| 4221 | 0.496 | 0.208 |
| 4222 | 0.498 | 0.16 |
| 4223 | 0.431 | 0.151 |
| 4224 | 0.461 | 0.178 |
| 4225 | 0.45 | 0.201 |
| 4226 | 0.39 | 0.216 |
| 4227 | 0.294 | 0.222 |
| 4228 | 0.326 | 0.207 |
| 4229 | 0.322 | 0.182 |
| 4230 | 0.294 | 0.152 |
| 4231 | 0.263 | 0.101 |
| 4232 | 0.327 | 0.056 |
| 4233 | 0.382 | 0.025 |
| 4234 | 0.371 | 0.006 |
| 4235 | 0.365 | 0.006 |
| 4236 | 0.397 | 0.006 |
| 4237 | 0.45 | 0.006 |
| 4238 | 0.436 | 0.025 |
| 4239 | 0.522 | 0.092 |
| 4240 | 0.557 | 0.159 |
| 4241 | 0.606 | 0.226 |
| 4242 | 0.658 | 0.277 |
| 4243 | 0.691 | 0.275 |
| 4244 | 0.632 | 0.234 |
| 4245 | 0.638 | 0.175 |
| 4246 | 0.722 | 0.14 |
| 4247 | 0.754 | 0.089 |
| 4248 | 0.796 | 0.065 |
| 4249 | 0.8 | 0.052 |
| 4250 | 0.793 | 0.017 |
| 4251 | 0.777 | 0.002 |
| 4252 | 0.757 | 0 |
| 4253 | 0.761 | 0 |
| 4254 | 0.786 | 0 |
| 4255 | 0.796 | 0 |
| 4256 | 0.852 | 0.005 |
| 4257 | 0.863 | 0.005 |
| 4258 | 0.865 | 0.028 |
| 4259 | 0.867 | 0.042 |
| 4260 | 0.852 | 0.047 |
| 4261 | 0.848 | 0.052 |
| 4262 | 0.825 | 0.03 |
| 4263 | 0.797 | 0.015 |
| 4264 | 0.797 | 0.005 |
| 4265 | 0.821 | 0.011 |
| 4266 | 0.854 | 0.011 |
| 4267 | 0.858 | 0.011 |
| 4268 | 0.883 | 0.014 |
| 4269 | 0.883 | 0.002 |
| 4270 | 0.886 | 0.002 |
| 4271 | 0.844 | 0.002 |
| 4272 | 0.836 | 0 |
| 4273 | 0.81 | 0 |
| 4274 | 0.821 | 0.002 |
| 4275 | 0.831 | 0.016 |
| 4276 | 0.811 | 0.035 |
| 4277 | 0.819 | 0.051 |
| 4278 | 0.822 | 0.064 |
| 4279 | 0.818 | 0.067 |
| 4280 | 0.829 | 0.07 |
| 4281 | 0.851 | 0.064 |
| 4282 | 0.835 | 0.059 |
| 4283 | 0.772 | 0.051 |
| 4284 | 0.703 | 0.048 |
| 4285 | 0.64 | 0.064 |
| 4286 | 0.627 | 0.101 |
| 4287 | 0.643 | 0.145 |
| 4288 | 0.679 | 0.185 |
| 4289 | 0.711 | 0.208 |
| 4290 | 0.78 | 0.206 |
| 4291 | 0.786 | 0.19 |
| 4292 | 0.8 | 0.164 |
| 4293 | 0.792 | 0.148 |
| 4294 | 0.806 | 0.118 |
| 4295 | 0.806 | 0.092 |
| 4296 | 0.808 | 0.066 |
| 4297 | 0.807 | 0.045 |
| 4298 | 0.792 | 0.041 |
| 4299 | 0.792 | 0.05 |
| 4300 | 0.788 | 0.072 |
| 4301 | 0.768 | 0.097 |
| 4302 | 0.744 | 0.122 |
| 4303 | 0.736 | 0.152 |
| 4304 | 0.796 | 0.177 |
| 4305 | 0.806 | 0.216 |
| 4306 | 0.769 | 0.27 |
| 4307 | 0.718 | 0.298 |
| 4308 | 0.682 | 0.316 |
| 4309 | 0.714 | 0.302 |
| 4310 | 0.743 | 0.265 |
| 4311 | 0.766 | 0.237 |
| 4312 | 0.787 | 0.201 |
| 4313 | 0.803 | 0.168 |
| 4314 | 0.814 | 0.124 |
| 4315 | 0.786 | 0.091 |
| 4316 | 0.744 | 0.094 |
| 4317 | 0.718 | 0.113 |
| 4318 | 0.723 | 0.19 |
| 4319 | 0.748 | 0.262 |
| 4320 | 0.781 | 0.32 |
| 4321 | 0.803 | 0.38 |
| 4322 | 0.807 | 0.408 |
| 4323 | 0.804 | 0.427 |
| 4324 | 0.805 | 0.389 |
| 4325 | 0.797 | 0.343 |
| 4326 | 0.812 | 0.294 |
| 4327 | 0.791 | 0.255 |
| 4328 | 0.844 | 0.299 |
| 4329 | 0.854 | 0.334 |
| 4330 | 0.845 | 0.357 |
| 4331 | 0.824 | 0.387 |
| 4332 | 0.808 | 0.366 |
| 4333 | 0.81 | 0.371 |
| 4334 | 0.804 | 0.392 |
| 4335 | 0.798 | 0.404 |
| 4336 | 0.812 | 0.45 |
| 4337 | 0.834 | 0.458 |
| 4338 | 0.841 | 0.45 |
| 4339 | 0.828 | 0.419 |
| 4340 | 0.794 | 0.368 |
| 4341 | 0.774 | 0.319 |
| 4342 | 0.794 | 0.275 |
| 4343 | 0.844 | 0.234 |
| 4344 | 0.838 | 0.175 |
| 4345 | 0.836 | 0.121 |
| 4346 | 0.738 | 0.064 |
| 4347 | 0.773 | 0.025 |
| 4348 | 0.702 | 0.012 |
| 4349 | 0.473 | 0.02 |
| 4350 | 0.24 | 0.02 |
| 4351 | 0.23 | 0.02 |
| 4352 | 0.211 | 0.016 |
| 4353 | 0.189 | 0 |
| 4354 | 0.229 | 0 |
| 4355 | 0.284 | 0 |
| 4356 | 0.421 | 0.006 |
| 4357 | 0.451 | 0.05 |
| 4358 | 0.268 | 0.099 |
| 4359 | 0.176 | 0.155 |
| 4360 | 0.152 | 0.22 |
| 4361 | 0.156 | 0.253 |
| 4362 | 0.188 | 0.29 |
| 4363 | 0.246 | 0.308 |
| 4364 | 0.245 | 0.321 |
| 4365 | 0.285 | 0.32 |
| 4366 | 0.296 | 0.321 |
| 4367 | 0.347 | 0.336 |
| 4368 | 0.396 | 0.345 |
| 4369 | 0.408 | 0.389 |
| 4370 | 0.369 | 0.414 |
| 4371 | 0.386 | 0.435 |
| 4372 | 0.408 | 0.447 |
| 4373 | 0.299 | 0.421 |
| 4374 | 0.236 | 0.378 |
| 4375 | 0.193 | 0.334 |
| 4376 | 0.153 | 0.285 |
| 4377 | 0.092 | 0.263 |
| 4378 | 0.054 | 0.275 |
| 4379 | 0.053 | 0.292 |
| 4380 | 0.049 | 0.311 |
| 4381 | 0.108 | 0.3 |
| 4382 | 0.203 | 0.272 |
| 4383 | 0.227 | 0.248 |
| 4384 | 0.281 | 0.241 |
| 4385 | 0.337 | 0.251 |
| 4386 | 0.358 | 0.267 |
| 4387 | 0.322 | 0.273 |
| 4388 | 0.281 | 0.269 |
| 4389 | 0.243 | 0.236 |
| 4390 | 0.235 | 0.227 |
| 4391 | 0.214 | 0.216 |
| 4392 | 0.21 | 0.216 |
| 4393 | 0.194 | 0.242 |
| 4394 | 0.188 | 0.265 |
| 4395 | 0.158 | 0.262 |
| 4396 | 0.141 | 0.23 |
| 4397 | 0.135 | 0.187 |
| 4398 | 0.109 | 0.13 |
| 4399 | 0.087 | 0.15 |
| 4400 | 0.084 | 0.179 |
| 4401 | 0.091 | 0.208 |
| 4402 | 0.133 | 0.23 |
| 4403 | 0.167 | 0.192 |
| 4404 | 0.195 | 0.16 |
| 4405 | 0.242 | 0.132 |
| 4406 | 0.263 | 0.116 |
| 4407 | 0.263 | 0.093 |
| 4408 | 0.231 | 0.074 |
| 4409 | 0.219 | 0.052 |
| 4410 | 0.246 | 0.021 |
| 4411 | 0.29 | 0.011 |
| 4412 | 0.361 | 0.006 |
| 4413 | 0.402 | 0.02 |
| 4414 | 0.376 | 0.02 |
| 4415 | 0.378 | 0.02 |
| 4416 | 0.381 | 0.014 |
| 4417 | 0.409 | 0 |
| 4418 | 0.386 | 0.002 |
| 4419 | 0.353 | 0.014 |
| 4420 | 0.327 | 0.036 |
| 4421 | 0.336 | 0.088 |
| 4422 | 0.331 | 0.141 |
| 4423 | 0.284 | 0.192 |
| 4424 | 0.279 | 0.252 |
| 4425 | 0.263 | 0.274 |
| 4426 | 0.151 | 0.29 |
| 4427 | 0.125 | 0.293 |
| 4428 | 0.145 | 0.268 |
| 4429 | 0.203 | 0.24 |
| 4430 | 0.266 | 0.212 |
| 4431 | 0.32 | 0.175 |
| 4432 | 0.346 | 0.159 |
| 4433 | 0.353 | 0.152 |
| 4434 | 0.387 | 0.138 |
| 4435 | 0.413 | 0.155 |
| 4436 | 0.375 | 0.18 |
| 4437 | 0.439 | 0.205 |
| 4438 | 0.514 | 0.251 |
| 4439 | 0.564 | 0.254 |
| 4440 | 0.544 | 0.189 |
| 4441 | 0.493 | 0.124 |
| 4442 | 0.466 | 0.049 |
| 4443 | 0.434 | 0 |
| 4444 | 0.416 | 0 |
| 4445 | 0.423 | 0 |
| 4446 | 0.398 | 0.004 |
| 4447 | 0.339 | 0.012 |
| 4448 | 0.406 | 0.022 |
| 4449 | 0.342 | 0.049 |
| 4450 | 0.291 | 0.06 |
| 4451 | 0.292 | 0.051 |
| 4452 | 0.271 | 0.05 |
| 4453 | 0.254 | 0.031 |
| 4454 | 0.263 | 0.02 |
| 4455 | 0.264 | 0.034 |
| 4456 | 0.239 | 0.043 |
| 4457 | 0.243 | 0.056 |
| 4458 | 0.293 | 0.087 |
| 4459 | 0.351 | 0.116 |
| 4460 | 0.373 | 0.134 |
| 4461 | 0.412 | 0.151 |
| 4462 | 0.436 | 0.147 |
| 4463 | 0.45 | 0.13 |
| 4464 | 0.442 | 0.141 |
| 4465 | 0.438 | 0.215 |
| 4466 | 0.393 | 0.304 |
| 4467 | 0.471 | 0.402 |
| 4468 | 0.506 | 0.514 |
| 4469 | 0.501 | 0.575 |
| 4470 | 0.477 | 0.629 |
| 4471 | 0.369 | 0.683 |
| 4472 | 0.371 | 0.677 |
| 4473 | 0.273 | 0.65 |
| 4474 | 0.188 | 0.617 |
| 4475 | 0.155 | 0.551 |
| 4476 | 0.152 | 0.498 |
| 4477 | 0.142 | 0.454 |
| 4478 | 0.106 | 0.427 |
| 4479 | 0.082 | 0.457 |
| 4480 | 0.096 | 0.515 |
| 4481 | 0.107 | 0.594 |
| 4482 | 0.117 | 0.668 |
| 4483 | 0.124 | 0.729 |
| 4484 | 0.159 | 0.764 |
| 4485 | 0.201 | 0.773 |
| 4486 | 0.261 | 0.77 |
| 4487 | 0.294 | 0.741 |
| 4488 | 0.313 | 0.721 |
| 4489 | 0.3 | 0.702 |
| 4490 | 0.288 | 0.681 |
| 4491 | 0.31 | 0.653 |
| 4492 | 0.34 | 0.626 |
| 4493 | 0.349 | 0.615 |
| 4494 | 0.362 | 0.616 |
| 4495 | 0.309 | 0.647 |
| 4496 | 0.348 | 0.682 |
| 4497 | 0.287 | 0.709 |
| 4498 | 0.221 | 0.736 |
| 4499 | 0.17 | 0.738 |
| 4500 | 0.168 | 0.698 |
| 4501 | 0.189 | 0.652 |
| 4502 | 0.218 | 0.587 |
| 4503 | 0.223 | 0.522 |
| 4504 | 0.228 | 0.473 |
| 4505 | 0.281 | 0.427 |
| 4506 | 0.317 | 0.398 |
| 4507 | 0.381 | 0.376 |
| 4508 | 0.387 | 0.363 |
| 4509 | 0.457 | 0.329 |
| 4510 | 0.545 | 0.289 |
| 4511 | 0.59 | 0.283 |
| 4512 | 0.567 | 0.286 |
| 4513 | 0.54 | 0.299 |
| 4514 | 0.468 | 0.3 |
| 4515 | 0.428 | 0.262 |
| 4516 | 0.442 | 0.229 |
| 4517 | 0.422 | 0.202 |
| 4518 | 0.404 | 0.198 |
| 4519 | 0.303 | 0.21 |
| 4520 | 0.29 | 0.186 |
| 4521 | 0.243 | 0.156 |
| 4522 | 0.182 | 0.113 |
| 4523 | 0.109 | 0.052 |
| 4524 | 0.083 | 0.036 |
| 4525 | 0.081 | 0.04 |
| 4526 | 0.098 | 0.056 |
| 4527 | 0.102 | 0.082 |
| 4528 | 0.137 | 0.107 |
| 4529 | 0.172 | 0.112 |
| 4530 | 0.236 | 0.111 |
| 4531 | 0.274 | 0.104 |
| 4532 | 0.291 | 0.074 |
| 4533 | 0.378 | 0.07 |
| 4534 | 0.436 | 0.059 |
| 4535 | 0.412 | 0.075 |
| 4536 | 0.396 | 0.131 |
| 4537 | 0.397 | 0.177 |
| 4538 | 0.423 | 0.238 |
| 4539 | 0.422 | 0.285 |
| 4540 | 0.389 | 0.314 |
| 4541 | 0.352 | 0.36 |
| 4542 | 0.298 | 0.422 |
| 4543 | 0.237 | 0.476 |
| 4544 | 0.256 | 0.531 |
| 4545 | 0.182 | 0.57 |
| 4546 | 0.099 | 0.592 |
| 4547 | 0.09 | 0.615 |
| 4548 | 0.143 | 0.638 |
| 4549 | 0.171 | 0.654 |
| 4550 | 0.248 | 0.654 |
| 4551 | 0.274 | 0.644 |
| 4552 | 0.278 | 0.622 |
| 4553 | 0.278 | 0.582 |
| 4554 | 0.355 | 0.565 |
| 4555 | 0.377 | 0.563 |
| 4556 | 0.354 | 0.569 |
| 4557 | 0.334 | 0.586 |
| 4558 | 0.356 | 0.579 |
| 4559 | 0.448 | 0.557 |
| 4560 | 0.499 | 0.531 |
| 4561 | 0.472 | 0.485 |
| 4562 | 0.428 | 0.447 |
| 4563 | 0.416 | 0.375 |
| 4564 | 0.417 | 0.298 |
| 4565 | 0.41 | 0.237 |
| 4566 | 0.383 | 0.16 |
| 4567 | 0.302 | 0.11 |
| 4568 | 0.371 | 0.063 |
| 4569 | 0.323 | 0.028 |
| 4570 | 0.333 | 0.011 |
| 4571 | 0.344 | 0.005 |
| 4572 | 0.347 | 0.002 |
| 4573 | 0.361 | 0 |
| 4574 | 0.369 | 0.013 |
| 4575 | 0.368 | 0.034 |
| 4576 | 0.35 | 0.055 |
| 4577 | 0.347 | 0.092 |
| 4578 | 0.362 | 0.115 |
| 4579 | 0.389 | 0.127 |
| 4580 | 0.403 | 0.132 |
| 4581 | 0.419 | 0.122 |
| 4582 | 0.441 | 0.121 |
| 4583 | 0.504 | 0.14 |
| 4584 | 0.508 | 0.169 |
| 4585 | 0.42 | 0.203 |
| 4586 | 0.355 | 0.235 |
| 4587 | 0.323 | 0.262 |
| 4588 | 0.306 | 0.293 |
| 4589 | 0.305 | 0.311 |
| 4590 | 0.317 | 0.302 |
| 4591 | 0.26 | 0.273 |
| 4592 | 0.323 | 0.226 |
| 4593 | 0.396 | 0.165 |
| 4594 | 0.405 | 0.125 |
| 4595 | 0.426 | 0.117 |
| 4596 | 0.45 | 0.128 |
| 4597 | 0.469 | 0.142 |
| 4598 | 0.471 | 0.154 |
| 4599 | 0.51 | 0.132 |
| 4600 | 0.499 | 0.109 |
| 4601 | 0.575 | 0.142 |
| 4602 | 0.596 | 0.177 |
| 4603 | 0.634 | 0.234 |
| 4604 | 0.559 | 0.288 |
| 4605 | 0.458 | 0.324 |
| 4606 | 0.431 | 0.366 |
| 4607 | 0.427 | 0.398 |
| 4608 | 0.413 | 0.401 |
| 4609 | 0.415 | 0.395 |
| 4610 | 0.39 | 0.393 |
| 4611 | 0.388 | 0.407 |
| 4612 | 0.421 | 0.446 |
| 4613 | 0.418 | 0.458 |
| 4614 | 0.44 | 0.436 |
| 4615 | 0.433 | 0.398 |
| 4616 | 0.502 | 0.351 |
| 4617 | 0.546 | 0.322 |
| 4618 | 0.582 | 0.306 |
| 4619 | 0.596 | 0.287 |
| 4620 | 0.599 | 0.262 |
| 4621 | 0.586 | 0.22 |
| 4622 | 0.573 | 0.197 |
| 4623 | 0.554 | 0.2 |
| 4624 | 0.495 | 0.219 |
| 4625 | 0.49 | 0.259 |
| 4626 | 0.484 | 0.291 |
| 4627 | 0.453 | 0.28 |
| 4628 | 0.358 | 0.262 |
| 4629 | 0.377 | 0.243 |
| 4630 | 0.438 | 0.214 |
| 4631 | 0.452 | 0.193 |
| 4632 | 0.424 | 0.166 |
| 4633 | 0.373 | 0.13 |
| 4634 | 0.301 | 0.11 |
| 4635 | 0.284 | 0.112 |
| 4636 | 0.371 | 0.135 |
| 4637 | 0.374 | 0.175 |
| 4638 | 0.341 | 0.229 |
| 4639 | 0.278 | 0.284 |
| 4640 | 0.268 | 0.332 |
| 4641 | 0.179 | 0.371 |
| 4642 | 0.147 | 0.399 |
| 4643 | 0.09 | 0.398 |
| 4644 | 0.064 | 0.383 |
| 4645 | 0.058 | 0.354 |
| 4646 | 0.07 | 0.313 |
| 4647 | 0.073 | 0.282 |
| 4648 | 0.087 | 0.239 |
| 4649 | 0.111 | 0.213 |
| 4650 | 0.107 | 0.189 |
| 4651 | 0.109 | 0.182 |
| 4652 | 0.144 | 0.201 |
| 4653 | 0.25 | 0.218 |
| 4654 | 0.361 | 0.25 |
| 4655 | 0.407 | 0.278 |
| 4656 | 0.362 | 0.303 |
| 4657 | 0.418 | 0.33 |
| 4658 | 0.44 | 0.351 |
| 4659 | 0.389 | 0.381 |
| 4660 | 0.363 | 0.397 |
| 4661 | 0.343 | 0.401 |
| 4662 | 0.318 | 0.4 |
| 4663 | 0.233 | 0.392 |
| 4664 | 0.147 | 0.396 |
| 4665 | 0.115 | 0.381 |
| 4666 | 0.074 | 0.33 |
| 4667 | 0.033 | 0.278 |
| 4668 | 0.021 | 0.222 |
| 4669 | 0.034 | 0.194 |
| 4670 | 0.049 | 0.206 |
| 4671 | 0.058 | 0.245 |
| 4672 | 0.081 | 0.262 |
| 4673 | 0.062 | 0.275 |
| 4674 | 0.149 | 0.266 |
| 4675 | 0.212 | 0.227 |
| 4676 | 0.246 | 0.205 |
| 4677 | 0.229 | 0.181 |
| 4678 | 0.166 | 0.165 |
| 4679 | 0.143 | 0.117 |
| 4680 | 0.138 | 0.073 |
| 4681 | 0.128 | 0.034 |
| 4682 | 0.115 | 0 |
| 4683 | 0.134 | 0 |
| 4684 | 0.155 | 0 |
| 4685 | 0.189 | 0 |
| 4686 | 0.236 | 0 |
| 4687 | 0.238 | 0.008 |
| 4688 | 0.204 | 0.015 |
| 4689 | 0.157 | 0.033 |
| 4690 | 0.138 | 0.054 |
| 4691 | 0.14 | 0.067 |
| 4692 | 0.116 | 0.077 |
| 4693 | 0.128 | 0.118 |
| 4694 | 0.16 | 0.15 |
| 4695 | 0.185 | 0.172 |
| 4696 | 0.169 | 0.18 |
| 4697 | 0.12 | 0.154 |
| 4698 | 0.132 | 0.138 |
| 4699 | 0.196 | 0.149 |
| 4700 | 0.238 | 0.187 |
| 4701 | 0.229 | 0.229 |
| 4702 | 0.149 | 0.273 |
| 4703 | 0.122 | 0.302 |
| 4704 | 0.153 | 0.29 |
| 4705 | 0.145 | 0.272 |
| 4706 | 0.129 | 0.264 |
| 4707 | 0.113 | 0.27 |
| 4708 | 0.143 | 0.315 |
| 4709 | 0.204 | 0.344 |
| 4710 | 0.21 | 0.35 |
| 4711 | 0.193 | 0.323 |
| 4712 | 0.2 | 0.283 |
| 4713 | 0.239 | 0.233 |
| 4714 | 0.232 | 0.193 |
| 4715 | 0.205 | 0.196 |
| 4716 | 0.215 | 0.212 |
| 4717 | 0.252 | 0.262 |
| 4718 | 0.274 | 0.327 |
| 4719 | 0.267 | 0.356 |
| 4720 | 0.315 | 0.374 |
| 4721 | 0.339 | 0.368 |
| 4722 | 0.393 | 0.34 |
| 4723 | 0.413 | 0.314 |
| 4724 | 0.385 | 0.287 |
| 4725 | 0.509 | 0.275 |
| 4726 | 0.602 | 0.276 |
| 4727 | 0.599 | 0.288 |
| 4728 | 0.556 | 0.294 |
| 4729 | 0.572 | 0.284 |
| 4730 | 0.632 | 0.253 |
| 4731 | 0.62 | 0.223 |
| 4732 | 0.412 | 0.175 |
| 4733 | 0.353 | 0.128 |
| 4734 | 0.2 | 0.091 |
| 4735 | 0.168 | 0.044 |
| 4736 | 0.15 | 0.024 |
| 4737 | 0.125 | 0.011 |
| 4738 | 0.128 | 0.002 |
| 4739 | 0.114 | 0.009 |
| 4740 | 0.099 | 0.038 |
| 4741 | 0.107 | 0.069 |
| 4742 | 0.099 | 0.1 |
| 4743 | 0.133 | 0.13 |
| 4744 | 0.142 | 0.159 |
| 4745 | 0.171 | 0.177 |
| 4746 | 0.188 | 0.178 |
| 4747 | 0.182 | 0.162 |
| 4748 | 0.224 | 0.116 |
| 4749 | 0.245 | 0.068 |
| 4750 | 0.249 | 0.038 |
| 4751 | 0.243 | 0.019 |
| 4752 | 0.223 | 0.016 |
| 4753 | 0.212 | 0.025 |
| 4754 | 0.185 | 0.035 |
| 4755 | 0.146 | 0.057 |
| 4756 | 0.108 | 0.08 |
| 4757 | 0.066 | 0.111 |
| 4758 | 0.05 | 0.143 |
| 4759 | 0.064 | 0.13 |
| 4760 | 0.063 | 0.099 |
| 4761 | 0.059 | 0.079 |
| 4762 | 0.031 | 0.062 |
| 4763 | 0.009 | 0.081 |
| 4764 | 0.012 | 0.108 |
| 4765 | 0.008 | 0.109 |
| 4766 | 0.012 | 0.11 |
| 4767 | 0.01 | 0.108 |
| 4768 | 0.032 | 0.127 |
| 4769 | 0.058 | 0.154 |
| 4770 | 0.084 | 0.159 |
| 4771 | 0.116 | 0.16 |
| 4772 | 0.11 | 0.13 |
| 4773 | 0.117 | 0.088 |
| 4774 | 0.147 | 0.054 |
| 4775 | 0.179 | 0.024 |
| 4776 | 0.17 | 0.007 |
| 4777 | 0.195 | 0 |
| 4778 | 0.234 | 0 |
| 4779 | 0.242 | 0.022 |
| 4780 | 0.234 | 0.053 |
| 4781 | 0.23 | 0.104 |
| 4782 | 0.22 | 0.162 |
| 4783 | 0.23 | 0.192 |
| 4784 | 0.22 | 0.212 |
| 4785 | 0.183 | 0.198 |
| 4786 | 0.112 | 0.17 |
| 4787 | 0.072 | 0.142 |
| 4788 | 0.049 | 0.092 |
| 4789 | 0.043 | 0.055 |
| 4790 | 0.056 | 0.024 |
| 4791 | 0.106 | 0 |
| 4792 | 0.146 | 0 |
| 4793 | 0.164 | 0.001 |
| 4794 | 0.186 | 0.009 |
| 4795 | 0.198 | 0.036 |
| 4796 | 0.216 | 0.063 |
| 4797 | 0.292 | 0.091 |
| 4798 | 0.395 | 0.126 |
| 4799 | 0.392 | 0.142 |
| 4800 | 0.453 | 0.146 |
| 4801 | 0.412 | 0.142 |
| 4802 | 0.422 | 0.116 |
| 4803 | 0.402 | 0.088 |
| 4804 | 0.454 | 0.057 |
| 4805 | 0.413 | 0.031 |
| 4806 | 0.363 | 0.014 |
| 4807 | 0.32 | 0 |
| 4808 | 0.36 | 0 |
| 4809 | 0.374 | 0 |
| 4810 | 0.323 | 0.028 |
| 4811 | 0.214 | 0.072 |
| 4812 | 0.154 | 0.123 |
| 4813 | 0.141 | 0.184 |
| 4814 | 0.127 | 0.207 |
| 4815 | 0.133 | 0.229 |
| 4816 | 0.129 | 0.255 |
| 4817 | 0.143 | 0.275 |
| 4818 | 0.196 | 0.313 |
| 4819 | 0.25 | 0.339 |
| 4820 | 0.291 | 0.353 |
| 4821 | 0.383 | 0.364 |
| 4822 | 0.451 | 0.362 |
| 4823 | 0.485 | 0.357 |
| 4824 | 0.496 | 0.348 |
| 4825 | 0.465 | 0.345 |
| 4826 | 0.418 | 0.364 |
| 4827 | 0.4 | 0.38 |
| 4828 | 0.382 | 0.374 |
| 4829 | 0.371 | 0.338 |
| 4830 | 0.377 | 0.278 |
| 4831 | 0.296 | 0.244 |
| 4832 | 0.262 | 0.242 |
| 4833 | 0.244 | 0.273 |
| 4834 | 0.148 | 0.274 |
| 4835 | 0.095 | 0.256 |
| 4836 | 0.13 | 0.214 |
| 4837 | 0.155 | 0.158 |
| 4838 | 0.164 | 0.147 |
| 4839 | 0.163 | 0.136 |
| 4840 | 0.181 | 0.145 |
| 4841 | 0.187 | 0.167 |
| 4842 | 0.207 | 0.186 |
| 4843 | 0.274 | 0.199 |
| 4844 | 0.318 | 0.218 |
| 4845 | 0.387 | 0.212 |
| 4846 | 0.421 | 0.197 |
| 4847 | 0.384 | 0.18 |
| 4848 | 0.328 | 0.149 |
| 4849 | 0.344 | 0.114 |
| 4850 | 0.318 | 0.096 |
| 4851 | 0.27 | 0.099 |
| 4852 | 0.23 | 0.102 |
| 4853 | 0.185 | 0.121 |
| 4854 | 0.178 | 0.097 |
| 4855 | 0.158 | 0.079 |
| 4856 | 0.11 | 0.077 |
| 4857 | 0.094 | 0.086 |
| 4858 | 0.075 | 0.145 |
| 4859 | 0.041 | 0.171 |
| 4860 | 0.047 | 0.174 |
| 4861 | 0.05 | 0.152 |
| 4862 | 0.061 | 0.093 |
| 4863 | 0.054 | 0.047 |
| 4864 | 0.063 | 0.016 |
| 4865 | 0.083 | 0 |
| 4866 | 0.131 | 0 |
| 4867 | 0.18 | 0.012 |
| 4868 | 0.178 | 0.036 |
| 4869 | 0.188 | 0.048 |
| 4870 | 0.197 | 0.051 |
| 4871 | 0.243 | 0.048 |
| 4872 | 0.249 | 0.074 |
| 4873 | 0.228 | 0.12 |
| 4874 | 0.191 | 0.18 |
| 4875 | 0.143 | 0.242 |
| 4876 | 0.078 | 0.281 |
| 4877 | 0.063 | 0.301 |
| 4878 | 0.047 | 0.315 |
| 4879 | 0.035 | 0.312 |
| 4880 | 0.011 | 0.283 |
| 4881 | 0.006 | 0.252 |
| 4882 | 0.003 | 0.213 |
| 4883 | 0.017 | 0.183 |
| 4884 | 0.046 | 0.145 |
| 4885 | 0.056 | 0.108 |
| 4886 | 0.058 | 0.079 |
| 4887 | 0.077 | 0.042 |
| 4888 | 0.091 | 0.02 |
| 4889 | 0.099 | 0.008 |
| 4890 | 0.116 | 0 |
| 4891 | 0.144 | 0.016 |
| 4892 | 0.152 | 0.049 |
| 4893 | 0.188 | 0.063 |
| 4894 | 0.216 | 0.08 |
| 4895 | 0.197 | 0.089 |
| 4896 | 0.211 | 0.082 |
| 4897 | 0.227 | 0.098 |
| 4898 | 0.21 | 0.093 |
| 4899 | 0.197 | 0.079 |
| 4900 | 0.182 | 0.052 |
| 4901 | 0.145 | 0.023 |
| 4902 | 0.104 | 0.011 |
| 4903 | 0.079 | 0 |
| 4904 | 0.027 | 0 |
| 4905 | 0.006 | 0.018 |
| 4906 | 0 | 0.036 |
| 4907 | 0.01 | 0.042 |
| 4908 | 0.023 | 0.049 |
| 4909 | 0.027 | 0.04 |
| 4910 | 0.041 | 0.085 |
| 4911 | 0.068 | 0.141 |
| 4912 | 0.091 | 0.217 |
| 4913 | 0.11 | 0.284 |
| 4914 | 0.144 | 0.297 |
| 4915 | 0.21 | 0.312 |
| 4916 | 0.252 | 0.301 |
| 4917 | 0.282 | 0.282 |
| 4918 | 0.322 | 0.26 |
| 4919 | 0.375 | 0.234 |
| 4920 | 0.383 | 0.206 |
| 4921 | 0.36 | 0.183 |
| 4922 | 0.366 | 0.164 |
| 4923 | 0.359 | 0.13 |
| 4924 | 0.327 | 0.105 |
| 4925 | 0.29 | 0.09 |
| 4926 | 0.302 | 0.08 |
| 4927 | 0.253 | 0.088 |
| 4928 | 0.187 | 0.09 |
| 4929 | 0.148 | 0.078 |
| 4930 | 0.105 | 0.053 |
| 4931 | 0.1 | 0.027 |
| 4932 | 0.085 | 0.009 |
| 4933 | 0.091 | 0.03 |
| 4934 | 0.115 | 0.055 |
| 4935 | 0.089 | 0.069 |
| 4936 | 0.1 | 0.078 |
| 4937 | 0.14 | 0.088 |
| 4938 | 0.172 | 0.096 |
| 4939 | 0.216 | 0.094 |
| 4940 | 0.284 | 0.089 |
| 4941 | 0.366 | 0.052 |
| 4942 | 0.454 | 0.047 |
| 4943 | 0.492 | 0.081 |
| 4944 | 0.516 | 0.127 |
| 4945 | 0.516 | 0.18 |
| 4946 | 0.512 | 0.188 |
| 4947 | 0.522 | 0.164 |
| 4948 | 0.495 | 0.118 |
| 4949 | 0.454 | 0.064 |
| 4950 | 0.44 | 0.028 |
| 4951 | 0.32 | 0.006 |
| 4952 | 0.291 | 0 |
| 4953 | 0.29 | 0 |
| 4954 | 0.259 | 0.009 |
| 4955 | 0.225 | 0.03 |
| 4956 | 0.226 | 0.04 |
| 4957 | 0.191 | 0.043 |
| 4958 | 0.194 | 0.046 |
| 4959 | 0.209 | 0.066 |
| 4960 | 0.228 | 0.106 |
| 4961 | 0.243 | 0.159 |
| 4962 | 0.287 | 0.204 |
| 4963 | 0.314 | 0.229 |
| 4964 | 0.346 | 0.248 |
| 4965 | 0.434 | 0.272 |
| 4966 | 0.456 | 0.275 |
| 4967 | 0.483 | 0.248 |
| 4968 | 0.45 | 0.22 |
| 4969 | 0.454 | 0.186 |
| 4970 | 0.453 | 0.171 |
| 4971 | 0.474 | 0.179 |
| 4972 | 0.475 | 0.194 |
| 4973 | 0.421 | 0.207 |
| 4974 | 0.412 | 0.22 |
| 4975 | 0.343 | 0.238 |
| 4976 | 0.296 | 0.25 |
| 4977 | 0.194 | 0.267 |
| 4978 | 0.13 | 0.287 |
| 4979 | 0.095 | 0.306 |
| 4980 | 0.101 | 0.304 |
| 4981 | 0.131 | 0.316 |
| 4982 | 0.131 | 0.33 |
| 4983 | 0.1 | 0.337 |
| 4984 | 0.107 | 0.378 |
| 4985 | 0.129 | 0.402 |
| 4986 | 0.169 | 0.41 |
| 4987 | 0.23 | 0.414 |
| 4988 | 0.281 | 0.406 |
| 4989 | 0.356 | 0.401 |
| 4990 | 0.383 | 0.421 |
| 4991 | 0.416 | 0.451 |
| 4992 | 0.363 | 0.5 |
| 4993 | 0.35 | 0.56 |
| 4994 | 0.354 | 0.611 |
| 4995 | 0.332 | 0.641 |
| 4996 | 0.305 | 0.608 |
| 4997 | 0.257 | 0.55 |
| 4998 | 0.237 | 0.478 |
| 4999 | 0.17 | 0.414 |
| 5000 | 0.099 | 0.387 |
| 5001 | 0.066 | 0.366 |
| 5002 | 0.062 | 0.379 |
| 5003 | 0.102 | 0.39 |
| 5004 | 0.201 | 0.377 |
| 5005 | 0.282 | 0.374 |
| 5006 | 0.43 | 0.331 |
| 5007 | 0.413 | 0.29 |
| 5008 | 0.409 | 0.271 |
| 5009 | 0.394 | 0.237 |
| 5010 | 0.362 | 0.226 |
| 5011 | 0.303 | 0.219 |
| 5012 | 0.225 | 0.213 |
| 5013 | 0.227 | 0.212 |
| 5014 | 0.254 | 0.202 |
| 5015 | 0.25 | 0.201 |
| 5016 | 0.231 | 0.196 |
| 5017 | 0.208 | 0.186 |
| 5018 | 0.173 | 0.174 |
| 5019 | 0.151 | 0.149 |
| 5020 | 0.152 | 0.156 |
| 5021 | 0.144 | 0.17 |
| 5022 | 0.164 | 0.179 |
| 5023 | 0.122 | 0.189 |
| 5024 | 0.094 | 0.168 |
| 5025 | 0.062 | 0.135 |
| 5026 | 0.061 | 0.1 |
| 5027 | 0.06 | 0.065 |
| 5028 | 0.054 | 0.033 |
| 5029 | 0.061 | 0.015 |
| 5030 | 0.079 | 0.007 |
| 5031 | 0.166 | 0 |
| 5032 | 0.225 | 0.01 |
| 5033 | 0.252 | 0.03 |
| 5034 | 0.227 | 0.057 |
| 5035 | 0.34 | 0.101 |
| 5036 | 0.416 | 0.138 |
| 5037 | 0.416 | 0.166 |
| 5038 | 0.461 | 0.197 |
| 5039 | 0.496 | 0.218 |
| 5040 | 0.553 | 0.266 |
| 5041 | 0.557 | 0.32 |
| 5042 | 0.526 | 0.351 |
| 5043 | 0.564 | 0.396 |
| 5044 | 0.573 | 0.404 |
| 5045 | 0.581 | 0.396 |
| 5046 | 0.557 | 0.402 |
| 5047 | 0.525 | 0.376 |
| 5048 | 0.492 | 0.336 |
| 5049 | 0.501 | 0.296 |
| 5050 | 0.587 | 0.249 |
| 5051 | 0.57 | 0.21 |
| 5052 | 0.519 | 0.182 |
| 5053 | 0.394 | 0.157 |
| 5054 | 0.27 | 0.117 |
| 5055 | 0.161 | 0.076 |
| 5056 | 0.127 | 0.041 |
| 5057 | 0.13 | 0.021 |
| 5058 | 0.192 | 0.033 |
| 5059 | 0.309 | 0.05 |
| 5060 | 0.257 | 0.062 |
| 5061 | 0.192 | 0.063 |
| 5062 | 0.235 | 0.054 |
| 5063 | 0.276 | 0.049 |
| 5064 | 0.377 | 0.042 |
| 5065 | 0.482 | 0.037 |
| 5066 | 0.528 | 0.026 |
| 5067 | 0.471 | 0.011 |
| 5068 | 0.417 | 0.005 |
| 5069 | 0.456 | 0 |
| 5070 | 0.418 | 0.005 |
| 5071 | 0.392 | 0.016 |
| 5072 | 0.363 | 0.036 |
| 5073 | 0.342 | 0.062 |
| 5074 | 0.305 | 0.087 |
| 5075 | 0.24 | 0.115 |
| 5076 | 0.168 | 0.164 |
| 5077 | 0.152 | 0.196 |
| 5078 | 0.116 | 0.232 |
| 5079 | 0.126 | 0.261 |
| 5080 | 0.114 | 0.251 |
| 5081 | 0.088 | 0.225 |
| 5082 | 0.108 | 0.189 |
| 5083 | 0.107 | 0.149 |
| 5084 | 0.087 | 0.118 |
| 5085 | 0.08 | 0.087 |
| 5086 | 0.113 | 0.057 |
| 5087 | 0.104 | 0.028 |
| 5088 | 0.114 | 0.027 |
| 5089 | 0.114 | 0.045 |
| 5090 | 0.112 | 0.045 |
| 5091 | 0.071 | 0.045 |
| 5092 | 0.048 | 0.018 |
| 5093 | 0.037 | 0.008 |
| 5094 | 0.029 | 0.059 |
| 5095 | 0.017 | 0.087 |
| 5096 | 0.011 | 0.11 |
| 5097 | 0.024 | 0.128 |
| 5098 | 0.036 | 0.12 |
| 5099 | 0.032 | 0.12 |
| 5100 | 0.026 | 0.153 |
| 5101 | 0.014 | 0.194 |
| 5102 | 0.023 | 0.228 |
| 5103 | 0.043 | 0.286 |
| 5104 | 0.064 | 0.318 |
| 5105 | 0.054 | 0.335 |
| 5106 | 0.082 | 0.341 |
| 5107 | 0.108 | 0.336 |
| 5108 | 0.088 | 0.33 |
| 5109 | 0.086 | 0.335 |
| 5110 | 0.106 | 0.344 |
| 5111 | 0.11 | 0.341 |
| 5112 | 0.126 | 0.345 |
| 5113 | 0.108 | 0.328 |
| 5114 | 0.097 | 0.308 |
| 5115 | 0.077 | 0.311 |
| 5116 | 0.068 | 0.319 |
| 5117 | 0.067 | 0.344 |
| 5118 | 0.043 | 0.351 |
| 5119 | 0.025 | 0.347 |
| 5120 | 0.011 | 0.332 |
| 5121 | 0.012 | 0.317 |
| 5122 | 0.061 | 0.318 |
| 5123 | 0.078 | 0.31 |
| 5124 | 0.084 | 0.272 |
| 5125 | 0.099 | 0.214 |
| 5126 | 0.092 | 0.153 |
| 5127 | 0.096 | 0.084 |
| 5128 | 0.11 | 0.057 |
| 5129 | 0.108 | 0.04 |
| 5130 | 0.104 | 0.023 |
| 5131 | 0.092 | 0.035 |
| 5132 | 0.075 | 0.041 |
| 5133 | 0.104 | 0.052 |
| 5134 | 0.135 | 0.079 |
| 5135 | 0.171 | 0.068 |
| 5136 | 0.167 | 0.048 |
| 5137 | 0.173 | 0.027 |
| 5138 | 0.147 | 0 |
| 5139 | 0.119 | 0 |
| 5140 | 0.093 | 0.005 |
| 5141 | 0.081 | 0.005 |
| 5142 | 0.063 | 0.005 |
| 5143 | 0.034 | 0.005 |
| 5144 | 0.012 | 0 |
| 5145 | 0.015 | 0 |
| 5146 | 0.011 | 0 |
| 5147 | 0.027 | 0 |
| 5148 | 0.068 | 0 |
| 5149 | 0.078 | 0 |
| 5150 | 0.074 | 0 |
| 5151 | 0.062 | 0 |
| 5152 | 0.058 | 0 |
| 5153 | 0.063 | 0 |
| 5154 | 0.058 | 0 |
| 5155 | 0.056 | 0 |
| 5156 | 0.066 | 0 |
| 5157 | 0.115 | 0.018 |
| 5158 | 0.147 | 0.041 |
| 5159 | 0.186 | 0.079 |
| 5160 | 0.21 | 0.134 |
| 5161 | 0.216 | 0.182 |
| 5162 | 0.248 | 0.22 |
| 5163 | 0.267 | 0.235 |
| 5164 | 0.25 | 0.222 |
| 5165 | 0.235 | 0.199 |
| 5166 | 0.204 | 0.173 |
| 5167 | 0.136 | 0.155 |
| 5168 | 0.077 | 0.146 |
| 5169 | 0.063 | 0.127 |
| 5170 | 0.022 | 0.113 |
| 5171 | 0.003 | 0.113 |
| 5172 | 0.009 | 0.116 |
| 5173 | 0.015 | 0.145 |
| 5174 | 0.014 | 0.155 |
| 5175 | 0.017 | 0.161 |
| 5176 | 0.031 | 0.166 |
| 5177 | 0.044 | 0.157 |
| 5178 | 0.074 | 0.176 |
| 5179 | 0.078 | 0.188 |
| 5180 | 0.086 | 0.194 |
| 5181 | 0.121 | 0.196 |
| 5182 | 0.159 | 0.193 |
| 5183 | 0.215 | 0.18 |
| 5184 | 0.283 | 0.158 |
| 5185 | 0.336 | 0.116 |
| 5186 | 0.36 | 0.07 |
| 5187 | 0.32 | 0.03 |
| 5188 | 0.314 | 0.005 |
| 5189 | 0.35 | 0 |
| 5190 | 0.331 | 0.031 |
| 5191 | 0.261 | 0.041 |
| 5192 | 0.215 | 0.041 |
| 5193 | 0.212 | 0.041 |
| 5194 | 0.155 | 0.042 |
| 5195 | 0.081 | 0.07 |
| 5196 | 0.038 | 0.118 |
| 5197 | 0.032 | 0.155 |
| 5198 | 0.023 | 0.172 |
| 5199 | 0.022 | 0.205 |
| 5200 | 0.021 | 0.224 |
| 5201 | 0.029 | 0.249 |
| 5202 | 0.055 | 0.232 |
| 5203 | 0.083 | 0.189 |
| 5204 | 0.145 | 0.16 |
| 5205 | 0.256 | 0.137 |
| 5206 | 0.338 | 0.154 |
| 5207 | 0.408 | 0.175 |
| 5208 | 0.45 | 0.175 |
| 5209 | 0.44 | 0.171 |
| 5210 | 0.44 | 0.158 |
| 5211 | 0.438 | 0.128 |
| 5212 | 0.458 | 0.114 |
| 5213 | 0.477 | 0.079 |
| 5214 | 0.495 | 0.046 |
| 5215 | 0.427 | 0.052 |
| 5216 | 0.346 | 0.072 |
| 5217 | 0.341 | 0.131 |
| 5218 | 0.293 | 0.197 |
| 5219 | 0.212 | 0.238 |
| 5220 | 0.134 | 0.251 |
| 5221 | 0.077 | 0.255 |
| 5222 | 0.053 | 0.24 |
| 5223 | 0.058 | 0.229 |
| 5224 | 0.069 | 0.224 |
| 5225 | 0.101 | 0.208 |
| 5226 | 0.14 | 0.199 |
| 5227 | 0.218 | 0.189 |
| 5228 | 0.293 | 0.177 |
| 5229 | 0.378 | 0.172 |
| 5230 | 0.488 | 0.157 |
| 5231 | 0.549 | 0.14 |
| 5232 | 0.562 | 0.128 |
| 5233 | 0.544 | 0.126 |
| 5234 | 0.536 | 0.142 |
| 5235 | 0.559 | 0.141 |
| 5236 | 0.525 | 0.125 |
| 5237 | 0.523 | 0.085 |
| 5238 | 0.507 | 0.039 |
| 5239 | 0.436 | 0.015 |
| 5240 | 0.328 | 0 |
| 5241 | 0.258 | 0 |
| 5242 | 0.2 | 0 |
| 5243 | 0.114 | 0 |
| 5244 | 0.086 | 0.003 |
| 5245 | 0.096 | 0.014 |
| 5246 | 0.107 | 0.042 |
| 5247 | 0.126 | 0.078 |
| 5248 | 0.165 | 0.135 |
| 5249 | 0.203 | 0.212 |
| 5250 | 0.222 | 0.288 |
| 5251 | 0.268 | 0.366 |
| 5252 | 0.278 | 0.43 |
| 5253 | 0.407 | 0.459 |
| 5254 | 0.488 | 0.469 |
| 5255 | 0.497 | 0.462 |
| 5256 | 0.488 | 0.462 |
| 5257 | 0.474 | 0.471 |
| 5258 | 0.426 | 0.504 |
| 5259 | 0.346 | 0.546 |
| 5260 | 0.292 | 0.583 |
| 5261 | 0.254 | 0.63 |
| 5262 | 0.277 | 0.664 |
| 5263 | 0.238 | 0.708 |
| 5264 | 0.19 | 0.75 |
| 5265 | 0.142 | 0.789 |
| 5266 | 0.123 | 0.812 |
| 5267 | 0.083 | 0.811 |
| 5268 | 0.064 | 0.81 |
| 5269 | 0.104 | 0.815 |
| 5270 | 0.163 | 0.833 |
| 5271 | 0.183 | 0.867 |
| 5272 | 0.185 | 0.891 |
| 5273 | 0.196 | 0.898 |
| 5274 | 0.18 | 0.864 |
| 5275 | 0.238 | 0.817 |
| 5276 | 0.232 | 0.719 |
| 5277 | 0.251 | 0.628 |
| 5278 | 0.29 | 0.58 |
| 5279 | 0.339 | 0.552 |
| 5280 | 0.327 | 0.59 |
| 5281 | 0.24 | 0.604 |
| 5282 | 0.221 | 0.613 |
| 5283 | 0.177 | 0.624 |
| 5284 | 0.17 | 0.629 |
| 5285 | 0.181 | 0.661 |
| 5286 | 0.236 | 0.696 |
| 5287 | 0.224 | 0.734 |
| 5288 | 0.23 | 0.781 |
| 5289 | 0.27 | 0.821 |
| 5290 | 0.25 | 0.842 |
| 5291 | 0.255 | 0.82 |
| 5292 | 0.232 | 0.779 |
| 5293 | 0.181 | 0.728 |
| 5294 | 0.166 | 0.684 |
| 5295 | 0.154 | 0.655 |
| 5296 | 0.143 | 0.624 |
| 5297 | 0.114 | 0.593 |
| 5298 | 0.122 | 0.546 |
| 5299 | 0.138 | 0.505 |
| 5300 | 0.193 | 0.492 |
| 5301 | 0.243 | 0.496 |
| 5302 | 0.286 | 0.525 |
| 5303 | 0.296 | 0.576 |
| 5304 | 0.322 | 0.606 |
| 5305 | 0.416 | 0.604 |
| 5306 | 0.438 | 0.588 |
| 5307 | 0.399 | 0.544 |
| 5308 | 0.382 | 0.454 |
| 5309 | 0.356 | 0.382 |
| 5310 | 0.34 | 0.314 |
| 5311 | 0.278 | 0.25 |
| 5312 | 0.239 | 0.22 |
| 5313 | 0.19 | 0.187 |
| 5314 | 0.135 | 0.163 |
| 5315 | 0.094 | 0.137 |
| 5316 | 0.069 | 0.094 |
| 5317 | 0.063 | 0.082 |
| 5318 | 0.061 | 0.141 |
| 5319 | 0.076 | 0.195 |
| 5320 | 0.109 | 0.257 |
| 5321 | 0.139 | 0.287 |
| 5322 | 0.181 | 0.26 |
| 5323 | 0.278 | 0.251 |
| 5324 | 0.359 | 0.246 |
| 5325 | 0.403 | 0.252 |
| 5326 | 0.364 | 0.258 |
| 5327 | 0.272 | 0.262 |
| 5328 | 0.182 | 0.282 |
| 5329 | 0.122 | 0.306 |
| 5330 | 0.116 | 0.304 |
| 5331 | 0.092 | 0.321 |
| 5332 | 0.079 | 0.347 |
| 5333 | 0.077 | 0.371 |
| 5334 | 0.103 | 0.419 |
| 5335 | 0.096 | 0.438 |
| 5336 | 0.076 | 0.438 |
| 5337 | 0.171 | 0.392 |
| 5338 | 0.232 | 0.331 |
| 5339 | 0.194 | 0.271 |
| 5340 | 0.164 | 0.206 |
| 5341 | 0.148 | 0.173 |
| 5342 | 0.136 | 0.135 |
| 5343 | 0.124 | 0.104 |
| 5344 | 0.187 | 0.074 |
| 5345 | 0.143 | 0.059 |
| 5346 | 0.112 | 0.063 |
| 5347 | 0.09 | 0.067 |
| 5348 | 0.055 | 0.068 |
| 5349 | 0.066 | 0.076 |
| 5350 | 0.065 | 0.073 |
| 5351 | 0.057 | 0.066 |
| 5352 | 0.043 | 0.07 |
| 5353 | 0.04 | 0.067 |
| 5354 | 0.037 | 0.08 |
| 5355 | 0.044 | 0.12 |
| 5356 | 0.046 | 0.148 |
| 5357 | 0.072 | 0.156 |
| 5358 | 0.067 | 0.14 |
| 5359 | 0.056 | 0.096 |
| 5360 | 0.029 | 0.059 |
| 5361 | 0.013 | 0.034 |
| 5362 | 0.013 | 0.015 |
| 5363 | 0.008 | 0.004 |
| 5364 | 0.008 | 0 |
| 5365 | 0.02 | 0 |
| 5366 | 0.038 | 0 |
| 5367 | 0.059 | 0 |
| 5368 | 0.101 | 0 |
| 5369 | 0.12 | 0 |
| 5370 | 0.152 | 0.003 |
| 5371 | 0.247 | 0.013 |
| 5372 | 0.214 | 0.031 |
| 5373 | 0.225 | 0.056 |
| 5374 | 0.168 | 0.091 |
| 5375 | 0.201 | 0.11 |
| 5376 | 0.172 | 0.126 |
| 5377 | 0.118 | 0.148 |
| 5378 | 0.1 | 0.165 |
| 5379 | 0.104 | 0.211 |
| 5380 | 0.074 | 0.272 |
| 5381 | 0.065 | 0.316 |
| 5382 | 0.073 | 0.35 |
| 5383 | 0.062 | 0.352 |
| 5384 | 0.024 | 0.352 |
| 5385 | 0.046 | 0.375 |
| 5386 | 0.049 | 0.441 |
| 5387 | 0.035 | 0.523 |
| 5388 | 0.03 | 0.592 |
| 5389 | 0.031 | 0.648 |
| 5390 | 0.048 | 0.709 |
| 5391 | 0.071 | 0.743 |
| 5392 | 0.087 | 0.768 |
| 5393 | 0.097 | 0.78 |
| 5394 | 0.118 | 0.763 |
| 5395 | 0.173 | 0.748 |
| 5396 | 0.23 | 0.738 |
| 5397 | 0.308 | 0.751 |
| 5398 | 0.363 | 0.743 |
| 5399 | 0.412 | 0.751 |
| 5400 | 0.443 | 0.77 |
| 5401 | 0.421 | 0.772 |
| 5402 | 0.394 | 0.756 |
| 5403 | 0.402 | 0.743 |
| 5404 | 0.407 | 0.713 |
| 5405 | 0.381 | 0.676 |
| 5406 | 0.327 | 0.658 |
| 5407 | 0.312 | 0.631 |
| 5408 | 0.223 | 0.618 |
| 5409 | 0.238 | 0.629 |
| 5410 | 0.185 | 0.634 |
| 5411 | 0.108 | 0.642 |
| 5412 | 0.061 | 0.652 |
| 5413 | 0.067 | 0.644 |
| 5414 | 0.107 | 0.633 |
| 5415 | 0.127 | 0.636 |
| 5416 | 0.124 | 0.65 |
| 5417 | 0.141 | 0.682 |
| 5418 | 0.197 | 0.738 |
| 5419 | 0.254 | 0.794 |
| 5420 | 0.324 | 0.837 |
| 5421 | 0.426 | 0.845 |
| 5422 | 0.531 | 0.839 |
| 5423 | 0.571 | 0.836 |
| 5424 | 0.573 | 0.83 |
| 5425 | 0.538 | 0.852 |
| 5426 | 0.503 | 0.874 |
| 5427 | 0.464 | 0.861 |
| 5428 | 0.453 | 0.825 |
| 5429 | 0.45 | 0.776 |
| 5430 | 0.422 | 0.727 |
| 5431 | 0.336 | 0.693 |
| 5432 | 0.224 | 0.695 |
| 5433 | 0.222 | 0.709 |
| 5434 | 0.218 | 0.724 |
| 5435 | 0.161 | 0.739 |
| 5436 | 0.142 | 0.716 |
| 5437 | 0.143 | 0.716 |
| 5438 | 0.135 | 0.722 |
| 5439 | 0.106 | 0.743 |
| 5440 | 0.099 | 0.77 |
| 5441 | 0.131 | 0.748 |
| 5442 | 0.17 | 0.697 |
| 5443 | 0.196 | 0.636 |
| 5444 | 0.289 | 0.574 |
| 5445 | 0.403 | 0.526 |
| 5446 | 0.464 | 0.493 |
| 5447 | 0.464 | 0.448 |
| 5448 | 0.478 | 0.412 |
| 5449 | 0.384 | 0.4 |
| 5450 | 0.219 | 0.388 |
| 5451 | 0.226 | 0.411 |
| 5452 | 0.3 | 0.448 |
| 5453 | 0.491 | 0.482 |
| 5454 | 0.506 | 0.54 |
| 5455 | 0.412 | 0.599 |
| 5456 | 0.287 | 0.652 |
| 5457 | 0.193 | 0.699 |
| 5458 | 0.139 | 0.7 |
| 5459 | 0.123 | 0.706 |
| 5460 | 0.107 | 0.728 |
| 5461 | 0.089 | 0.747 |
| 5462 | 0.081 | 0.799 |
| 5463 | 0.079 | 0.825 |
| 5464 | 0.081 | 0.83 |
| 5465 | 0.096 | 0.82 |
| 5466 | 0.079 | 0.799 |
| 5467 | 0.096 | 0.78 |
| 5468 | 0.141 | 0.762 |
| 5469 | 0.119 | 0.753 |
| 5470 | 0.163 | 0.734 |
| 5471 | 0.219 | 0.716 |
| 5472 | 0.231 | 0.697 |
| 5473 | 0.265 | 0.688 |
| 5474 | 0.358 | 0.698 |
| 5475 | 0.418 | 0.716 |
| 5476 | 0.329 | 0.74 |
| 5477 | 0.314 | 0.758 |
| 5478 | 0.258 | 0.78 |
| 5479 | 0.242 | 0.785 |
| 5480 | 0.208 | 0.788 |
| 5481 | 0.184 | 0.789 |
| 5482 | 0.131 | 0.783 |
| 5483 | 0.071 | 0.801 |
| 5484 | 0.052 | 0.825 |
| 5485 | 0.086 | 0.849 |
| 5486 | 0.122 | 0.864 |
| 5487 | 0.158 | 0.861 |
| 5488 | 0.19 | 0.836 |
| 5489 | 0.212 | 0.793 |
| 5490 | 0.172 | 0.742 |
| 5491 | 0.192 | 0.693 |
| 5492 | 0.218 | 0.659 |
| 5493 | 0.259 | 0.654 |
| 5494 | 0.269 | 0.668 |
| 5495 | 0.211 | 0.648 |
| 5496 | 0.169 | 0.591 |
| 5497 | 0.127 | 0.496 |
| 5498 | 0.116 | 0.39 |
| 5499 | 0.148 | 0.347 |
| 5500 | 0.203 | 0.342 |
| 5501 | 0.276 | 0.37 |
| 5502 | 0.264 | 0.414 |
| 5503 | 0.231 | 0.432 |
| 5504 | 0.187 | 0.449 |
| 5505 | 0.14 | 0.455 |
| 5506 | 0.122 | 0.47 |
| 5507 | 0.158 | 0.502 |
| 5508 | 0.158 | 0.52 |
| 5509 | 0.211 | 0.55 |
| 5510 | 0.163 | 0.556 |
| 5511 | 0.117 | 0.552 |
| 5512 | 0.102 | 0.568 |
| 5513 | 0.169 | 0.581 |
| 5514 | 0.305 | 0.588 |
| 5515 | 0.321 | 0.575 |
| 5516 | 0.315 | 0.559 |
| 5517 | 0.269 | 0.548 |
| 5518 | 0.206 | 0.597 |
| 5519 | 0.2 | 0.66 |
| 5520 | 0.176 | 0.709 |
| 5521 | 0.222 | 0.741 |
| 5522 | 0.285 | 0.714 |
| 5523 | 0.353 | 0.689 |
| 5524 | 0.306 | 0.647 |
| 5525 | 0.277 | 0.612 |
| 5526 | 0.291 | 0.574 |
| 5527 | 0.289 | 0.557 |
| 5528 | 0.29 | 0.576 |
| 5529 | 0.361 | 0.579 |
| 5530 | 0.403 | 0.615 |
| 5531 | 0.366 | 0.652 |
| 5532 | 0.354 | 0.684 |
| 5533 | 0.332 | 0.723 |
| 5534 | 0.283 | 0.729 |
| 5535 | 0.299 | 0.696 |
| 5536 | 0.289 | 0.661 |
| 5537 | 0.309 | 0.64 |
| 5538 | 0.382 | 0.637 |
| 5539 | 0.44 | 0.65 |
| 5540 | 0.521 | 0.633 |
| 5541 | 0.557 | 0.611 |
| 5542 | 0.532 | 0.579 |
| 5543 | 0.489 | 0.539 |
| 5544 | 0.466 | 0.522 |
| 5545 | 0.502 | 0.495 |
| 5546 | 0.603 | 0.457 |
| 5547 | 0.633 | 0.422 |
| 5548 | 0.64 | 0.384 |
| 5549 | 0.596 | 0.349 |
| 5550 | 0.576 | 0.307 |
| 5551 | 0.575 | 0.271 |
| 5552 | 0.624 | 0.239 |
| 5553 | 0.672 | 0.216 |
| 5554 | 0.659 | 0.21 |
| 5555 | 0.626 | 0.184 |
| 5556 | 0.567 | 0.166 |
| 5557 | 0.509 | 0.152 |
| 5558 | 0.471 | 0.152 |
| 5559 | 0.426 | 0.156 |
| 5560 | 0.443 | 0.144 |
| 5561 | 0.512 | 0.12 |
| 5562 | 0.614 | 0.088 |
| 5563 | 0.61 | 0.082 |
| 5564 | 0.539 | 0.098 |
| 5565 | 0.53 | 0.118 |
| 5566 | 0.47 | 0.136 |
| 5567 | 0.53 | 0.151 |
| 5568 | 0.568 | 0.153 |
| 5569 | 0.695 | 0.117 |
| 5570 | 0.704 | 0.082 |
| 5571 | 0.63 | 0.04 |
| 5572 | 0.596 | 0 |
| 5573 | 0.589 | 0 |
| 5574 | 0.556 | 0.008 |
| 5575 | 0.557 | 0.034 |
| 5576 | 0.641 | 0.065 |
| 5577 | 0.686 | 0.09 |
| 5578 | 0.635 | 0.082 |
| 5579 | 0.51 | 0.056 |
| 5580 | 0.436 | 0.028 |
| 5581 | 0.375 | 0.038 |
| 5582 | 0.34 | 0.072 |
| 5583 | 0.353 | 0.096 |
| 5584 | 0.378 | 0.107 |
| 5585 | 0.462 | 0.074 |
| 5586 | 0.56 | 0.041 |
| 5587 | 0.576 | 0.017 |
| 5588 | 0.549 | 0.009 |
| 5589 | 0.556 | 0.008 |
| 5590 | 0.507 | 0.008 |
| 5591 | 0.466 | 0.008 |
| 5592 | 0.445 | 0.002 |
| 5593 | 0.565 | 0 |
| 5594 | 0.69 | 0 |
| 5595 | 0.703 | 0 |
| 5596 | 0.68 | 0 |
| 5597 | 0.647 | 0 |
| 5598 | 0.621 | 0 |
| 5599 | 0.575 | 0.034 |
| 5600 | 0.64 | 0.071 |
| 5601 | 0.635 | 0.105 |
| 5602 | 0.583 | 0.15 |
| 5603 | 0.535 | 0.169 |
| 5604 | 0.475 | 0.179 |
| 5605 | 0.414 | 0.17 |
| 5606 | 0.37 | 0.145 |
| 5607 | 0.376 | 0.106 |
| 5608 | 0.399 | 0.097 |
| 5609 | 0.489 | 0.118 |
| 5610 | 0.572 | 0.15 |
| 5611 | 0.579 | 0.188 |
| 5612 | 0.59 | 0.214 |
| 5613 | 0.661 | 0.229 |
| 5614 | 0.692 | 0.223 |
| 5615 | 0.686 | 0.211 |
| 5616 | 0.709 | 0.184 |
| 5617 | 0.74 | 0.157 |
| 5618 | 0.712 | 0.142 |
| 5619 | 0.645 | 0.132 |
| 5620 | 0.581 | 0.134 |
| 5621 | 0.563 | 0.139 |
| 5622 | 0.521 | 0.132 |
| 5623 | 0.451 | 0.101 |
| 5624 | 0.436 | 0.065 |
| 5625 | 0.442 | 0.025 |
| 5626 | 0.427 | 0 |
| 5627 | 0.407 | 0.008 |
| 5628 | 0.407 | 0.025 |
| 5629 | 0.338 | 0.046 |
| 5630 | 0.326 | 0.076 |
| 5631 | 0.292 | 0.119 |
| 5632 | 0.295 | 0.156 |
| 5633 | 0.336 | 0.195 |
| 5634 | 0.382 | 0.229 |
| 5635 | 0.398 | 0.237 |
| 5636 | 0.431 | 0.233 |
| 5637 | 0.491 | 0.239 |
| 5638 | 0.525 | 0.25 |
| 5639 | 0.553 | 0.278 |
| 5640 | 0.529 | 0.318 |
| 5641 | 0.518 | 0.35 |
| 5642 | 0.56 | 0.379 |
| 5643 | 0.568 | 0.416 |
| 5644 | 0.549 | 0.455 |
| 5645 | 0.504 | 0.505 |
| 5646 | 0.49 | 0.573 |
| 5647 | 0.5 | 0.595 |
| 5648 | 0.483 | 0.605 |
| 5649 | 0.478 | 0.6 |
| 5650 | 0.398 | 0.565 |
| 5651 | 0.339 | 0.544 |
| 5652 | 0.242 | 0.505 |
| 5653 | 0.186 | 0.463 |
| 5654 | 0.178 | 0.402 |
| 5655 | 0.174 | 0.345 |
| 5656 | 0.215 | 0.301 |
| 5657 | 0.247 | 0.248 |
| 5658 | 0.242 | 0.21 |
| 5659 | 0.199 | 0.194 |
| 5660 | 0.228 | 0.212 |
| 5661 | 0.242 | 0.244 |
| 5662 | 0.33 | 0.287 |
| 5663 | 0.368 | 0.323 |
| 5664 | 0.472 | 0.334 |
| 5665 | 0.502 | 0.354 |
| 5666 | 0.467 | 0.361 |
| 5667 | 0.451 | 0.358 |
| 5668 | 0.474 | 0.341 |
| 5669 | 0.447 | 0.325 |
| 5670 | 0.395 | 0.308 |
| 5671 | 0.336 | 0.306 |
| 5672 | 0.28 | 0.3 |
| 5673 | 0.249 | 0.275 |
| 5674 | 0.176 | 0.243 |
| 5675 | 0.088 | 0.194 |
| 5676 | 0.047 | 0.175 |
| 5677 | 0.05 | 0.186 |
| 5678 | 0.058 | 0.22 |
| 5679 | 0.071 | 0.262 |
| 5680 | 0.096 | 0.292 |
| 5681 | 0.123 | 0.304 |
| 5682 | 0.166 | 0.287 |
| 5683 | 0.155 | 0.258 |
| 5684 | 0.168 | 0.233 |
| 5685 | 0.211 | 0.209 |
| 5686 | 0.238 | 0.211 |
| 5687 | 0.289 | 0.218 |
| 5688 | 0.322 | 0.22 |
| 5689 | 0.353 | 0.206 |
| 5690 | 0.274 | 0.182 |
| 5691 | 0.198 | 0.165 |
| 5692 | 0.184 | 0.138 |
| 5693 | 0.164 | 0.116 |
| 5694 | 0.135 | 0.078 |
| 5695 | 0.13 | 0.043 |
| 5696 | 0.061 | 0.02 |
| 5697 | 0.074 | 0.015 |
| 5698 | 0.038 | 0.022 |
| 5699 | 0.009 | 0.033 |
| 5700 | 0.016 | 0.066 |
| 5701 | 0.026 | 0.078 |
| 5702 | 0.043 | 0.087 |
| 5703 | 0.067 | 0.075 |
| 5704 | 0.145 | 0.042 |
| 5705 | 0.173 | 0.016 |
| 5706 | 0.196 | 0 |
| 5707 | 0.166 | 0 |
| 5708 | 0.172 | 0.005 |
| 5709 | 0.221 | 0.032 |
| 5710 | 0.302 | 0.079 |
| 5711 | 0.35 | 0.116 |
| 5712 | 0.365 | 0.131 |
| 5713 | 0.323 | 0.104 |
| 5714 | 0.262 | 0.057 |
| 5715 | 0.257 | 0.021 |
| 5716 | 0.271 | 0 |
| 5717 | 0.258 | 0 |
| 5718 | 0.24 | 0.007 |
| 5719 | 0.205 | 0.024 |
| 5720 | 0.121 | 0.032 |
| 5721 | 0.116 | 0.032 |
| 5722 | 0.035 | 0.025 |
| 5723 | 0.006 | 0.02 |
| 5724 | 0.009 | 0.021 |
| 5725 | 0.021 | 0.028 |
| 5726 | 0.096 | 0.034 |
| 5727 | 0.15 | 0.023 |
| 5728 | 0.116 | 0.03 |
| 5729 | 0.116 | 0.05 |
| 5730 | 0.134 | 0.074 |
| 5731 | 0.146 | 0.112 |
| 5732 | 0.198 | 0.133 |
| 5733 | 0.258 | 0.139 |
| 5734 | 0.322 | 0.149 |
| 5735 | 0.373 | 0.16 |
| 5736 | 0.409 | 0.176 |
| 5737 | 0.432 | 0.204 |
| 5738 | 0.441 | 0.233 |
| 5739 | 0.405 | 0.27 |
| 5740 | 0.375 | 0.308 |
| 5741 | 0.384 | 0.348 |
| 5742 | 0.364 | 0.427 |
| 5743 | 0.333 | 0.493 |
| 5744 | 0.268 | 0.567 |
| 5745 | 0.279 | 0.64 |
| 5746 | 0.224 | 0.682 |
| 5747 | 0.144 | 0.724 |
| 5748 | 0.102 | 0.754 |
| 5749 | 0.085 | 0.784 |
| 5750 | 0.093 | 0.801 |
| 5751 | 0.169 | 0.815 |
| 5752 | 0.246 | 0.82 |
| 5753 | 0.334 | 0.813 |
| 5754 | 0.307 | 0.796 |
| 5755 | 0.279 | 0.788 |
| 5756 | 0.287 | 0.792 |
| 5757 | 0.402 | 0.757 |
| 5758 | 0.444 | 0.707 |
| 5759 | 0.442 | 0.659 |
| 5760 | 0.426 | 0.614 |
| 5761 | 0.331 | 0.603 |
| 5762 | 0.403 | 0.607 |
| 5763 | 0.364 | 0.595 |
| 5764 | 0.323 | 0.53 |
| 5765 | 0.338 | 0.467 |
| 5766 | 0.372 | 0.404 |
| 5767 | 0.34 | 0.328 |
| 5768 | 0.264 | 0.287 |
| 5769 | 0.172 | 0.269 |
| 5770 | 0.088 | 0.264 |
| 5771 | 0.051 | 0.282 |
| 5772 | 0.025 | 0.301 |
| 5773 | 0.016 | 0.295 |
| 5774 | 0.032 | 0.272 |
| 5775 | 0.054 | 0.202 |
| 5776 | 0.063 | 0.156 |
| 5777 | 0.074 | 0.129 |
| 5778 | 0.074 | 0.132 |
| 5779 | 0.094 | 0.208 |
| 5780 | 0.127 | 0.256 |
| 5781 | 0.132 | 0.312 |
| 5782 | 0.15 | 0.354 |
| 5783 | 0.177 | 0.377 |
| 5784 | 0.175 | 0.419 |
| 5785 | 0.188 | 0.451 |
| 5786 | 0.201 | 0.502 |
| 5787 | 0.229 | 0.543 |
| 5788 | 0.246 | 0.578 |
| 5789 | 0.201 | 0.614 |
| 5790 | 0.134 | 0.625 |
| 5791 | 0.109 | 0.613 |
| 5792 | 0.059 | 0.591 |
| 5793 | 0.056 | 0.568 |
| 5794 | 0.026 | 0.555 |
| 5795 | 0.013 | 0.548 |
| 5796 | 0.014 | 0.552 |
| 5797 | 0.019 | 0.555 |
| 5798 | 0.024 | 0.563 |
| 5799 | 0.039 | 0.588 |
| 5800 | 0.041 | 0.604 |
| 5801 | 0.052 | 0.611 |
| 5802 | 0.104 | 0.59 |
| 5803 | 0.131 | 0.554 |
| 5804 | 0.234 | 0.517 |
| 5805 | 0.32 | 0.477 |
| 5806 | 0.384 | 0.45 |
| 5807 | 0.403 | 0.434 |
| 5808 | 0.426 | 0.44 |
| 5809 | 0.394 | 0.469 |
| 5810 | 0.425 | 0.514 |
| 5811 | 0.492 | 0.551 |
| 5812 | 0.516 | 0.566 |
| 5813 | 0.496 | 0.553 |
| 5814 | 0.441 | 0.518 |
| 5815 | 0.413 | 0.492 |
| 5816 | 0.354 | 0.49 |
| 5817 | 0.406 | 0.506 |
| 5818 | 0.36 | 0.536 |
| 5819 | 0.3 | 0.551 |
| 5820 | 0.266 | 0.546 |
| 5821 | 0.287 | 0.528 |
| 5822 | 0.294 | 0.507 |
| 5823 | 0.29 | 0.485 |
| 5824 | 0.325 | 0.458 |
| 5825 | 0.392 | 0.426 |
| 5826 | 0.446 | 0.386 |
| 5827 | 0.457 | 0.384 |
| 5828 | 0.546 | 0.414 |
| 5829 | 0.657 | 0.467 |
| 5830 | 0.725 | 0.541 |
| 5831 | 0.764 | 0.558 |
| 5832 | 0.766 | 0.564 |
| 5833 | 0.754 | 0.55 |
| 5834 | 0.755 | 0.503 |
| 5835 | 0.729 | 0.479 |
| 5836 | 0.709 | 0.44 |
| 5837 | 0.692 | 0.36 |
| 5838 | 0.666 | 0.296 |
| 5839 | 0.652 | 0.229 |
| 5840 | 0.673 | 0.162 |
| 5841 | 0.685 | 0.158 |
| 5842 | 0.623 | 0.159 |
| 5843 | 0.53 | 0.173 |
| 5844 | 0.436 | 0.196 |
| 5845 | 0.337 | 0.197 |
| 5846 | 0.293 | 0.187 |
| 5847 | 0.264 | 0.168 |
| 5848 | 0.282 | 0.142 |
| 5849 | 0.352 | 0.117 |
| 5850 | 0.433 | 0.088 |
| 5851 | 0.489 | 0.059 |
| 5852 | 0.59 | 0.062 |
| 5853 | 0.697 | 0.067 |
| 5854 | 0.744 | 0.073 |
| 5855 | 0.761 | 0.086 |
| 5856 | 0.753 | 0.069 |
| 5857 | 0.712 | 0.064 |
| 5858 | 0.714 | 0.089 |
| 5859 | 0.676 | 0.126 |
| 5860 | 0.609 | 0.157 |
| 5861 | 0.555 | 0.148 |
| 5862 | 0.534 | 0.115 |
| 5863 | 0.512 | 0.093 |
| 5864 | 0.589 | 0.083 |
| 5865 | 0.551 | 0.09 |
| 5866 | 0.41 | 0.112 |
| 5867 | 0.311 | 0.111 |
| 5868 | 0.24 | 0.106 |
| 5869 | 0.27 | 0.124 |
| 5870 | 0.261 | 0.138 |
| 5871 | 0.338 | 0.145 |
| 5872 | 0.39 | 0.142 |
| 5873 | 0.465 | 0.119 |
| 5874 | 0.539 | 0.081 |
| 5875 | 0.483 | 0.048 |
| 5876 | 0.406 | 0.028 |
| 5877 | 0.404 | 0.017 |
| 5878 | 0.458 | 0.029 |
| 5879 | 0.472 | 0.042 |
| 5880 | 0.549 | 0.044 |
| 5881 | 0.555 | 0.037 |
| 5882 | 0.53 | 0.021 |
| 5883 | 0.513 | 0.007 |
| 5884 | 0.485 | 0 |
| 5885 | 0.481 | 0 |
| 5886 | 0.489 | 0 |
| 5887 | 0.406 | 0.007 |
| 5888 | 0.472 | 0.019 |
| 5889 | 0.51 | 0.025 |
| 5890 | 0.456 | 0.028 |
| 5891 | 0.466 | 0.022 |
| 5892 | 0.524 | 0.01 |
| 5893 | 0.642 | 0.003 |
| 5894 | 0.7 | 0 |
| 5895 | 0.708 | 0 |
| 5896 | 0.708 | 0.016 |
| 5897 | 0.695 | 0.036 |
| 5898 | 0.702 | 0.065 |
| 5899 | 0.739 | 0.099 |
| 5900 | 0.556 | 0.124 |
| 5901 | 0.524 | 0.147 |
| 5902 | 0.578 | 0.154 |
| 5903 | 0.624 | 0.15 |
| 5904 | 0.66 | 0.127 |
| 5905 | 0.676 | 0.121 |
| 5906 | 0.657 | 0.13 |
| 5907 | 0.635 | 0.152 |
| 5908 | 0.562 | 0.193 |
| 5909 | 0.476 | 0.219 |
| 5910 | 0.468 | 0.244 |
| 5911 | 0.438 | 0.271 |
| 5912 | 0.592 | 0.268 |
| 5913 | 0.692 | 0.27 |
| 5914 | 0.728 | 0.268 |
| 5915 | 0.693 | 0.268 |
| 5916 | 0.687 | 0.305 |
| 5917 | 0.683 | 0.345 |
| 5918 | 0.638 | 0.392 |
| 5919 | 0.599 | 0.43 |
| 5920 | 0.569 | 0.465 |
| 5921 | 0.602 | 0.49 |
| 5922 | 0.574 | 0.529 |
| 5923 | 0.437 | 0.558 |
| 5924 | 0.449 | 0.567 |
| 5925 | 0.487 | 0.57 |
| 5926 | 0.424 | 0.559 |
| 5927 | 0.392 | 0.576 |
| 5928 | 0.381 | 0.596 |
| 5929 | 0.355 | 0.615 |
| 5930 | 0.321 | 0.614 |
| 5931 | 0.322 | 0.591 |
| 5932 | 0.328 | 0.532 |
| 5933 | 0.323 | 0.497 |
| 5934 | 0.321 | 0.466 |
| 5935 | 0.272 | 0.424 |
| 5936 | 0.268 | 0.406 |
| 5937 | 0.278 | 0.362 |
| 5938 | 0.297 | 0.322 |
| 5939 | 0.275 | 0.284 |
| 5940 | 0.285 | 0.265 |
| 5941 | 0.321 | 0.242 |
| 5942 | 0.339 | 0.224 |
| 5943 | 0.357 | 0.208 |
| 5944 | 0.27 | 0.191 |
| 5945 | 0.351 | 0.175 |
| 5946 | 0.275 | 0.159 |
| 5947 | 0.178 | 0.158 |
| 5948 | 0.155 | 0.146 |
| 5949 | 0.16 | 0.151 |
| 5950 | 0.22 | 0.129 |
| 5951 | 0.208 | 0.112 |
| 5952 | 0.229 | 0.104 |
| 5953 | 0.244 | 0.069 |
| 5954 | 0.202 | 0.056 |
| 5955 | 0.166 | 0.029 |
| 5956 | 0.153 | 0.006 |
| 5957 | 0.173 | 0.006 |
| 5958 | 0.229 | 0.022 |
| 5959 | 0.252 | 0.044 |
| 5960 | 0.289 | 0.056 |
| 5961 | 0.302 | 0.097 |
| 5962 | 0.303 | 0.136 |
| 5963 | 0.285 | 0.179 |
| 5964 | 0.279 | 0.21 |
| 5965 | 0.306 | 0.185 |
| 5966 | 0.339 | 0.16 |
| 5967 | 0.376 | 0.129 |
| 5968 | 0.392 | 0.121 |
| 5969 | 0.402 | 0.124 |
| 5970 | 0.364 | 0.128 |
| 5971 | 0.32 | 0.128 |
| 5972 | 0.278 | 0.124 |
| 5973 | 0.212 | 0.126 |
| 5974 | 0.191 | 0.109 |
| 5975 | 0.242 | 0.076 |
| 5976 | 0.237 | 0.045 |
| 5977 | 0.198 | 0.027 |
| 5978 | 0.148 | 0.021 |
| 5979 | 0.111 | 0.021 |
| 5980 | 0.079 | 0.021 |
| 5981 | 0.054 | 0.012 |
| 5982 | 0.054 | 0.013 |
| 5983 | 0.05 | 0.03 |
| 5984 | 0.043 | 0.05 |
| 5985 | 0.021 | 0.066 |
| 5986 | 0.022 | 0.069 |
| 5987 | 0.013 | 0.092 |
| 5988 | 0.013 | 0.114 |
| 5989 | 0.014 | 0.131 |
| 5990 | 0.014 | 0.139 |
| 5991 | 0.015 | 0.115 |
| 5992 | 0.016 | 0.083 |
| 5993 | 0.019 | 0.053 |
| 5994 | 0.047 | 0.029 |
| 5995 | 0.039 | 0.014 |
| 5996 | 0.04 | 0.009 |
| 5997 | 0.055 | 0.029 |
| 5998 | 0.07 | 0.044 |
| 5999 | 0.082 | 0.061 |
| 6000 | 0.093 | 0.076 |
| 6001 | 0.087 | 0.081 |
| 6002 | 0.087 | 0.083 |
| 6003 | 0.101 | 0.081 |
| 6004 | 0.148 | 0.06 |
| 6005 | 0.144 | 0.049 |
| 6006 | 0.151 | 0.05 |
| 6007 | 0.135 | 0.064 |
| 6008 | 0.078 | 0.083 |
| 6009 | 0.11 | 0.07 |
| 6010 | 0.142 | 0.059 |
| 6011 | 0.122 | 0.03 |
| 6012 | 0.124 | 0.012 |
| 6013 | 0.17 | 0.007 |
| 6014 | 0.156 | 0 |
| 6015 | 0.166 | 0.015 |
| 6016 | 0.156 | 0.046 |
| 6017 | 0.147 | 0.063 |
| 6018 | 0.16 | 0.073 |
| 6019 | 0.168 | 0.061 |
| 6020 | 0.245 | 0.03 |
| 6021 | 0.367 | 0.012 |
| 6022 | 0.383 | 0.003 |
| 6023 | 0.417 | 0 |
| 6024 | 0.461 | 0 |
| 6025 | 0.493 | 0 |
| 6026 | 0.541 | 0 |
| 6027 | 0.546 | 0 |
| 6028 | 0.558 | 0 |
| 6029 | 0.577 | 0.003 |
| 6030 | 0.582 | 0.01 |
| 6031 | 0.528 | 0.032 |
| 6032 | 0.462 | 0.047 |
| 6033 | 0.519 | 0.067 |
| 6034 | 0.537 | 0.085 |
| 6035 | 0.487 | 0.086 |
| 6036 | 0.446 | 0.077 |
| 6037 | 0.404 | 0.06 |
| 6038 | 0.371 | 0.047 |
| 6039 | 0.366 | 0.054 |
| 6040 | 0.37 | 0.079 |
| 6041 | 0.429 | 0.115 |
| 6042 | 0.475 | 0.163 |
| 6043 | 0.449 | 0.222 |
| 6044 | 0.536 | 0.276 |
| 6045 | 0.64 | 0.29 |
| 6046 | 0.672 | 0.272 |
| 6047 | 0.706 | 0.226 |
| 6048 | 0.69 | 0.179 |
| 6049 | 0.662 | 0.164 |
| 6050 | 0.645 | 0.176 |
| 6051 | 0.626 | 0.211 |
| 6052 | 0.631 | 0.258 |
| 6053 | 0.613 | 0.326 |
| 6054 | 0.587 | 0.373 |
| 6055 | 0.522 | 0.429 |
| 6056 | 0.441 | 0.484 |
| 6057 | 0.419 | 0.526 |
| 6058 | 0.323 | 0.563 |
| 6059 | 0.256 | 0.605 |
| 6060 | 0.19 | 0.64 |
| 6061 | 0.183 | 0.665 |
| 6062 | 0.202 | 0.706 |
| 6063 | 0.154 | 0.719 |
| 6064 | 0.111 | 0.728 |
| 6065 | 0.119 | 0.727 |
| 6066 | 0.184 | 0.72 |
| 6067 | 0.369 | 0.676 |
| 6068 | 0.598 | 0.63 |
| 6069 | 0.675 | 0.594 |
| 6070 | 0.637 | 0.558 |
| 6071 | 0.553 | 0.493 |
| 6072 | 0.396 | 0.434 |
| 6073 | 0.301 | 0.361 |
| 6074 | 0.271 | 0.29 |
| 6075 | 0.251 | 0.274 |
| 6076 | 0.274 | 0.246 |
| 6077 | 0.253 | 0.216 |
| 6078 | 0.216 | 0.184 |
| 6079 | 0.195 | 0.154 |
| 6080 | 0.176 | 0.136 |
| 6081 | 0.139 | 0.144 |
| 6082 | 0.136 | 0.156 |
| 6083 | 0.156 | 0.187 |
| 6084 | 0.228 | 0.226 |
| 6085 | 0.256 | 0.247 |
| 6086 | 0.23 | 0.264 |
| 6087 | 0.228 | 0.253 |
| 6088 | 0.228 | 0.233 |
| 6089 | 0.204 | 0.204 |
| 6090 | 0.136 | 0.17 |
| 6091 | 0.137 | 0.134 |
| 6092 | 0.143 | 0.106 |
| 6093 | 0.123 | 0.099 |
| 6094 | 0.125 | 0.089 |
| 6095 | 0.114 | 0.09 |
| 6096 | 0.1 | 0.116 |
| 6097 | 0.083 | 0.129 |
| 6098 | 0.098 | 0.122 |
| 6099 | 0.131 | 0.102 |
| 6100 | 0.171 | 0.051 |
| 6101 | 0.215 | 0.009 |
| 6102 | 0.241 | 0.01 |
| 6103 | 0.254 | 0.022 |
| 6104 | 0.312 | 0.05 |
| 6105 | 0.415 | 0.094 |
| 6106 | 0.506 | 0.136 |
| 6107 | 0.603 | 0.175 |
| 6108 | 0.676 | 0.194 |
| 6109 | 0.74 | 0.193 |
| 6110 | 0.794 | 0.169 |
| 6111 | 0.826 | 0.156 |
| 6112 | 0.832 | 0.156 |
| 6113 | 0.82 | 0.156 |
| 6114 | 0.804 | 0.16 |
| 6115 | 0.793 | 0.15 |
| 6116 | 0.773 | 0.128 |
| 6117 | 0.739 | 0.111 |
| 6118 | 0.716 | 0.098 |
| 6119 | 0.689 | 0.081 |
| 6120 | 0.649 | 0.055 |
| 6121 | 0.639 | 0.04 |
| 6122 | 0.596 | 0.036 |
| 6123 | 0.575 | 0.052 |
| 6124 | 0.577 | 0.094 |
| 6125 | 0.587 | 0.129 |
| 6126 | 0.542 | 0.172 |
| 6127 | 0.511 | 0.207 |
| 6128 | 0.465 | 0.233 |
| 6129 | 0.387 | 0.266 |
| 6130 | 0.25 | 0.295 |
| 6131 | 0.176 | 0.322 |
| 6132 | 0.117 | 0.314 |
| 6133 | 0.083 | 0.248 |
| 6134 | 0.064 | 0.164 |
| 6135 | 0.04 | 0.076 |
| 6136 | 0.03 | 0.037 |
| 6137 | 0.028 | 0.048 |
| 6138 | 0.023 | 0.092 |
| 6139 | 0.021 | 0.16 |
| 6140 | 0.021 | 0.189 |
| 6141 | 0.024 | 0.207 |
| 6142 | 0.025 | 0.221 |
| 6143 | 0.031 | 0.21 |
| 6144 | 0.027 | 0.214 |
| 6145 | 0.026 | 0.221 |
| 6146 | 0.024 | 0.2 |
| 6147 | 0.025 | 0.174 |
| 6148 | 0.024 | 0.14 |
| 6149 | 0.032 | 0.105 |
| 6150 | 0.032 | 0.07 |
| 6151 | 0.039 | 0.065 |
| 6152 | 0.017 | 0.086 |
| 6153 | 0.015 | 0.129 |
| 6154 | 0.01 | 0.174 |
| 6155 | 0.012 | 0.191 |
| 6156 | 0.016 | 0.182 |
| 6157 | 0.029 | 0.155 |
| 6158 | 0.033 | 0.121 |
| 6159 | 0.053 | 0.078 |
| 6160 | 0.044 | 0.05 |
| 6161 | 0.051 | 0.03 |
| 6162 | 0.032 | 0.038 |
| 6163 | 0.041 | 0.083 |
| 6164 | 0.043 | 0.127 |
| 6165 | 0.062 | 0.176 |
| 6166 | 0.065 | 0.207 |
| 6167 | 0.07 | 0.206 |
| 6168 | 0.099 | 0.197 |
| 6169 | 0.12 | 0.194 |
| 6170 | 0.133 | 0.194 |
| 6171 | 0.165 | 0.21 |
| 6172 | 0.138 | 0.24 |
| 6173 | 0.1 | 0.258 |
| 6174 | 0.077 | 0.266 |
| 6175 | 0.074 | 0.251 |
| 6176 | 0.045 | 0.21 |
| 6177 | 0.046 | 0.171 |
| 6178 | 0.06 | 0.139 |
| 6179 | 0.069 | 0.121 |
| 6180 | 0.063 | 0.112 |
| 6181 | 0.06 | 0.094 |
| 6182 | 0.051 | 0.063 |
| 6183 | 0.037 | 0.036 |
| 6184 | 0.023 | 0.025 |
| 6185 | 0.028 | 0.039 |
| 6186 | 0.043 | 0.089 |
| 6187 | 0.085 | 0.107 |
| 6188 | 0.104 | 0.097 |
| 6189 | 0.114 | 0.068 |
| 6190 | 0.106 | 0.018 |
| 6191 | 0.098 | 0 |
| 6192 | 0.085 | 0.01 |
| 6193 | 0.098 | 0.025 |
| 6194 | 0.097 | 0.038 |
| 6195 | 0.073 | 0.056 |
| 6196 | 0.061 | 0.072 |
| 6197 | 0.043 | 0.083 |
| 6198 | 0.023 | 0.098 |
| 6199 | 0.019 | 0.126 |
| 6200 | 0.013 | 0.139 |
| 6201 | 0.011 | 0.148 |
| 6202 | 0.024 | 0.145 |
| 6203 | 0.018 | 0.155 |
| 6204 | 0.016 | 0.174 |
| 6205 | 0.021 | 0.205 |
| 6206 | 0.019 | 0.263 |
| 6207 | 0.015 | 0.306 |
| 6208 | 0.014 | 0.361 |
| 6209 | 0.017 | 0.401 |
| 6210 | 0.023 | 0.412 |
| 6211 | 0.041 | 0.399 |
| 6212 | 0.054 | 0.375 |
| 6213 | 0.059 | 0.356 |
| 6214 | 0.06 | 0.347 |
| 6215 | 0.069 | 0.341 |
| 6216 | 0.081 | 0.325 |
| 6217 | 0.106 | 0.308 |
| 6218 | 0.126 | 0.302 |
| 6219 | 0.108 | 0.287 |
| 6220 | 0.074 | 0.3 |
| 6221 | 0.058 | 0.306 |
| 6222 | 0.059 | 0.3 |
| 6223 | 0.053 | 0.308 |
| 6224 | 0.032 | 0.278 |
| 6225 | 0.038 | 0.235 |
| 6226 | 0.035 | 0.188 |
| 6227 | 0.012 | 0.139 |
| 6228 | 0.008 | 0.105 |
| 6229 | 0.01 | 0.072 |
| 6230 | 0.025 | 0.056 |
| 6231 | 0.058 | 0.051 |
| 6232 | 0.091 | 0.059 |
| 6233 | 0.115 | 0.099 |
| 6234 | 0.124 | 0.123 |
| 6235 | 0.114 | 0.138 |
| 6236 | 0.118 | 0.142 |
| 6237 | 0.165 | 0.14 |
| 6238 | 0.179 | 0.175 |
| 6239 | 0.158 | 0.223 |
| 6240 | 0.158 | 0.272 |
| 6241 | 0.181 | 0.304 |
| 6242 | 0.16 | 0.306 |
| 6243 | 0.204 | 0.3 |
| 6244 | 0.115 | 0.32 |
| 6245 | 0.112 | 0.378 |
| 6246 | 0.084 | 0.45 |
| 6247 | 0.036 | 0.509 |
| 6248 | 0.017 | 0.548 |
| 6249 | 0.018 | 0.551 |
| 6250 | 0.02 | 0.536 |
| 6251 | 0.022 | 0.526 |
| 6252 | 0.056 | 0.492 |
| 6253 | 0.119 | 0.456 |
| 6254 | 0.18 | 0.419 |
| 6255 | 0.231 | 0.378 |
| 6256 | 0.231 | 0.37 |
| 6257 | 0.186 | 0.346 |
| 6258 | 0.148 | 0.301 |
| 6259 | 0.17 | 0.26 |
| 6260 | 0.198 | 0.193 |
| 6261 | 0.203 | 0.16 |
| 6262 | 0.234 | 0.163 |
| 6263 | 0.216 | 0.149 |
| 6264 | 0.181 | 0.152 |
| 6265 | 0.11 | 0.133 |
| 6266 | 0.102 | 0.144 |
| 6267 | 0.09 | 0.171 |
| 6268 | 0.075 | 0.168 |
| 6269 | 0.072 | 0.191 |
| 6270 | 0.05 | 0.178 |
| 6271 | 0.032 | 0.191 |
| 6272 | 0.026 | 0.229 |
| 6273 | 0.024 | 0.26 |
| 6274 | 0.031 | 0.283 |
| 6275 | 0.047 | 0.268 |
| 6276 | 0.056 | 0.242 |
| 6277 | 0.042 | 0.21 |
| 6278 | 0.05 | 0.192 |
| 6279 | 0.089 | 0.182 |
| 6280 | 0.107 | 0.176 |
| 6281 | 0.115 | 0.165 |
| 6282 | 0.114 | 0.113 |
| 6283 | 0.119 | 0.084 |
| 6284 | 0.171 | 0.061 |
| 6285 | 0.23 | 0.062 |
| 6286 | 0.248 | 0.091 |
| 6287 | 0.246 | 0.113 |
| 6288 | 0.211 | 0.144 |
| 6289 | 0.208 | 0.158 |
| 6290 | 0.242 | 0.184 |
| 6291 | 0.242 | 0.209 |
| 6292 | 0.249 | 0.238 |
| 6293 | 0.209 | 0.272 |
| 6294 | 0.173 | 0.279 |
| 6295 | 0.134 | 0.273 |
| 6296 | 0.091 | 0.238 |
| 6297 | 0.121 | 0.208 |
| 6298 | 0.118 | 0.202 |
| 6299 | 0.092 | 0.207 |
| 6300 | 0.059 | 0.237 |
| 6301 | 0.044 | 0.257 |
| 6302 | 0.028 | 0.274 |
| 6303 | 0.043 | 0.288 |
| 6304 | 0.057 | 0.299 |
| 6305 | 0.06 | 0.32 |
| 6306 | 0.079 | 0.346 |
| 6307 | 0.129 | 0.379 |
| 6308 | 0.143 | 0.408 |
| 6309 | 0.135 | 0.418 |
| 6310 | 0.123 | 0.402 |
| 6311 | 0.14 | 0.33 |
| 6312 | 0.141 | 0.221 |
| 6313 | 0.136 | 0.119 |
| 6314 | 0.118 | 0.039 |
| 6315 | 0.097 | 0.027 |
| 6316 | 0.081 | 0.057 |
| 6317 | 0.054 | 0.08 |
| 6318 | 0.044 | 0.094 |
| 6319 | 0.031 | 0.092 |
| 6320 | 0.021 | 0.117 |
| 6321 | 0.015 | 0.133 |
| 6322 | 0.018 | 0.138 |
| 6323 | 0.025 | 0.116 |
| 6324 | 0.042 | 0.061 |
| 6325 | 0.051 | 0.022 |
| 6326 | 0.059 | 0 |
| 6327 | 0.042 | 0 |
| 6328 | 0.051 | 0 |
| 6329 | 0.058 | 0.018 |
| 6330 | 0.058 | 0.042 |
| 6331 | 0.057 | 0.072 |
| 6332 | 0.078 | 0.107 |
| 6333 | 0.086 | 0.116 |
| 6334 | 0.072 | 0.091 |
| 6335 | 0.066 | 0.062 |
| 6336 | 0.068 | 0.027 |
| 6337 | 0.065 | 0 |
| 6338 | 0.076 | 0 |
| 6339 | 0.088 | 0 |
| 6340 | 0.08 | 0 |
| 6341 | 0.084 | 0.004 |
| 6342 | 0.089 | 0.04 |
| 6343 | 0.09 | 0.112 |
| 6344 | 0.067 | 0.217 |
| 6345 | 0.061 | 0.268 |
| 6346 | 0.049 | 0.282 |
| 6347 | 0.05 | 0.253 |
| 6348 | 0.052 | 0.187 |
| 6349 | 0.053 | 0.172 |
| 6350 | 0.071 | 0.148 |
| 6351 | 0.071 | 0.15 |
| 6352 | 0.086 | 0.137 |
| 6353 | 0.091 | 0.116 |
| 6354 | 0.077 | 0.113 |
| 6355 | 0.088 | 0.093 |
| 6356 | 0.128 | 0.106 |
| 6357 | 0.143 | 0.138 |
| 6358 | 0.162 | 0.171 |
| 6359 | 0.17 | 0.201 |
| 6360 | 0.228 | 0.218 |
| 6361 | 0.285 | 0.228 |
| 6362 | 0.33 | 0.215 |
| 6363 | 0.316 | 0.173 |
| 6364 | 0.312 | 0.128 |
| 6365 | 0.283 | 0.086 |
| 6366 | 0.301 | 0.073 |
| 6367 | 0.259 | 0.097 |
| 6368 | 0.194 | 0.132 |
| 6369 | 0.194 | 0.152 |
| 6370 | 0.194 | 0.158 |
| 6371 | 0.175 | 0.151 |
| 6372 | 0.137 | 0.126 |
| 6373 | 0.078 | 0.099 |
| 6374 | 0.071 | 0.072 |
| 6375 | 0.065 | 0.044 |
| 6376 | 0.054 | 0.023 |
| 6377 | 0.073 | 0.012 |
| 6378 | 0.106 | 0.023 |
| 6379 | 0.163 | 0.057 |
| 6380 | 0.269 | 0.113 |
| 6381 | 0.346 | 0.176 |
| 6382 | 0.381 | 0.244 |
| 6383 | 0.392 | 0.286 |
| 6384 | 0.405 | 0.308 |
| 6385 | 0.386 | 0.324 |
| 6386 | 0.387 | 0.315 |
| 6387 | 0.401 | 0.303 |
| 6388 | 0.372 | 0.311 |
| 6389 | 0.355 | 0.339 |
| 6390 | 0.324 | 0.378 |
| 6391 | 0.283 | 0.435 |
| 6392 | 0.197 | 0.468 |
| 6393 | 0.188 | 0.491 |
| 6394 | 0.143 | 0.495 |
| 6395 | 0.106 | 0.472 |
| 6396 | 0.064 | 0.452 |
| 6397 | 0.027 | 0.402 |
| 6398 | 0.024 | 0.351 |
| 6399 | 0.026 | 0.318 |
| 6400 | 0.047 | 0.269 |
| 6401 | 0.062 | 0.236 |
| 6402 | 0.107 | 0.211 |
| 6403 | 0.178 | 0.177 |
| 6404 | 0.225 | 0.154 |
| 6405 | 0.228 | 0.147 |
| 6406 | 0.258 | 0.162 |
| 6407 | 0.221 | 0.214 |
| 6408 | 0.227 | 0.277 |
| 6409 | 0.182 | 0.339 |
| 6410 | 0.135 | 0.381 |
| 6411 | 0.149 | 0.402 |
| 6412 | 0.148 | 0.412 |
| 6413 | 0.132 | 0.405 |
| 6414 | 0.164 | 0.402 |
| 6415 | 0.175 | 0.414 |
| 6416 | 0.124 | 0.442 |
| 6417 | 0.094 | 0.462 |
| 6418 | 0.049 | 0.474 |
| 6419 | 0.013 | 0.47 |
| 6420 | 0.006 | 0.439 |
| 6421 | 0.006 | 0.416 |
| 6422 | 0.008 | 0.386 |
| 6423 | 0.02 | 0.342 |
| 6424 | 0.028 | 0.308 |
| 6425 | 0.052 | 0.279 |
| 6426 | 0.09 | 0.268 |
| 6427 | 0.123 | 0.265 |
| 6428 | 0.146 | 0.261 |
| 6429 | 0.152 | 0.29 |
| 6430 | 0.158 | 0.311 |
| 6431 | 0.158 | 0.354 |
| 6432 | 0.177 | 0.412 |
| 6433 | 0.169 | 0.456 |
| 6434 | 0.145 | 0.496 |
| 6435 | 0.142 | 0.509 |
| 6436 | 0.121 | 0.516 |
| 6437 | 0.1 | 0.503 |
| 6438 | 0.095 | 0.483 |
| 6439 | 0.087 | 0.478 |
| 6440 | 0.068 | 0.466 |
| 6441 | 0.06 | 0.449 |
| 6442 | 0.062 | 0.436 |
| 6443 | 0.067 | 0.418 |
| 6444 | 0.095 | 0.411 |
| 6445 | 0.091 | 0.412 |
| 6446 | 0.097 | 0.437 |
| 6447 | 0.09 | 0.459 |
| 6448 | 0.107 | 0.488 |
| 6449 | 0.1 | 0.542 |
| 6450 | 0.09 | 0.577 |
| 6451 | 0.102 | 0.63 |
| 6452 | 0.129 | 0.67 |
| 6453 | 0.147 | 0.694 |
| 6454 | 0.139 | 0.716 |
| 6455 | 0.119 | 0.718 |
| 6456 | 0.087 | 0.725 |
| 6457 | 0.089 | 0.733 |
| 6458 | 0.089 | 0.774 |
| 6459 | 0.078 | 0.819 |
| 6460 | 0.078 | 0.862 |
| 6461 | 0.052 | 0.895 |
| 6462 | 0.043 | 0.9 |
| 6463 | 0.046 | 0.9 |
| 6464 | 0.027 | 0.881 |
| 6465 | 0.02 | 0.869 |
| 6466 | 0.055 | 0.853 |
| 6467 | 0.088 | 0.852 |
| 6468 | 0.064 | 0.871 |
| 6469 | 0.085 | 0.882 |
| 6470 | 0.09 | 0.884 |
| 6471 | 0.101 | 0.869 |
| 6472 | 0.105 | 0.868 |
| 6473 | 0.12 | 0.868 |
| 6474 | 0.142 | 0.862 |
| 6475 | 0.204 | 0.851 |
| 6476 | 0.266 | 0.815 |
| 6477 | 0.259 | 0.783 |
| 6478 | 0.272 | 0.779 |
| 6479 | 0.255 | 0.778 |
| 6480 | 0.227 | 0.795 |
| 6481 | 0.192 | 0.814 |
| 6482 | 0.145 | 0.838 |
| 6483 | 0.117 | 0.866 |
| 6484 | 0.086 | 0.887 |
| 6485 | 0.059 | 0.9 |
| 6486 | 0.04 | 0.9 |
| 6487 | 0.032 | 0.879 |
| 6488 | 0.024 | 0.839 |
| 6489 | 0.025 | 0.816 |
| 6490 | 0.032 | 0.816 |
| 6491 | 0.049 | 0.837 |
| 6492 | 0.06 | 0.86 |
| 6493 | 0.067 | 0.858 |
| 6494 | 0.052 | 0.834 |
| 6495 | 0.042 | 0.808 |
| 6496 | 0.046 | 0.8 |
| 6497 | 0.044 | 0.789 |
| 6498 | 0.051 | 0.769 |
| 6499 | 0.077 | 0.771 |
| 6500 | 0.118 | 0.792 |
| 6501 | 0.14 | 0.825 |
| 6502 | 0.184 | 0.869 |
| 6503 | 0.212 | 0.892 |
| 6504 | 0.197 | 0.898 |
| 6505 | 0.193 | 0.892 |
| 6506 | 0.185 | 0.877 |
| 6507 | 0.172 | 0.857 |
| 6508 | 0.152 | 0.819 |
| 6509 | 0.131 | 0.802 |
| 6510 | 0.111 | 0.802 |
| 6511 | 0.097 | 0.808 |
| 6512 | 0.055 | 0.841 |
| 6513 | 0.034 | 0.866 |
| 6514 | 0.042 | 0.881 |
| 6515 | 0.046 | 0.895 |
| 6516 | 0.05 | 0.89 |
| 6517 | 0.053 | 0.884 |
| 6518 | 0.057 | 0.884 |
| 6519 | 0.049 | 0.884 |
| 6520 | 0.056 | 0.893 |
| 6521 | 0.082 | 0.9 |
| 6522 | 0.104 | 0.893 |
| 6523 | 0.174 | 0.885 |
| 6524 | 0.258 | 0.885 |
| 6525 | 0.316 | 0.885 |
| 6526 | 0.392 | 0.886 |
| 6527 | 0.446 | 0.878 |
| 6528 | 0.478 | 0.878 |
| 6529 | 0.504 | 0.878 |
| 6530 | 0.484 | 0.884 |
| 6531 | 0.485 | 0.892 |
| 6532 | 0.449 | 0.874 |
| 6533 | 0.458 | 0.829 |
| 6534 | 0.464 | 0.775 |
| 6535 | 0.475 | 0.711 |
| 6536 | 0.383 | 0.657 |
| 6537 | 0.422 | 0.608 |
| 6538 | 0.438 | 0.542 |
| 6539 | 0.391 | 0.472 |
| 6540 | 0.306 | 0.413 |
| 6541 | 0.239 | 0.372 |
| 6542 | 0.226 | 0.35 |
| 6543 | 0.194 | 0.345 |
| 6544 | 0.247 | 0.311 |
| 6545 | 0.316 | 0.28 |
| 6546 | 0.343 | 0.24 |
| 6547 | 0.408 | 0.203 |
| 6548 | 0.504 | 0.186 |
| 6549 | 0.557 | 0.146 |
| 6550 | 0.615 | 0.136 |
| 6551 | 0.614 | 0.134 |
| 6552 | 0.604 | 0.141 |
| 6553 | 0.595 | 0.176 |
| 6554 | 0.562 | 0.187 |
| 6555 | 0.555 | 0.184 |
| 6556 | 0.521 | 0.167 |
| 6557 | 0.489 | 0.141 |
| 6558 | 0.481 | 0.124 |
| 6559 | 0.487 | 0.124 |
| 6560 | 0.374 | 0.124 |
| 6561 | 0.447 | 0.136 |
| 6562 | 0.388 | 0.159 |
| 6563 | 0.271 | 0.172 |
| 6564 | 0.187 | 0.198 |
| 6565 | 0.152 | 0.218 |
| 6566 | 0.179 | 0.231 |
| 6567 | 0.204 | 0.258 |
| 6568 | 0.218 | 0.28 |
| 6569 | 0.235 | 0.322 |
| 6570 | 0.223 | 0.356 |
| 6571 | 0.289 | 0.366 |
| 6572 | 0.396 | 0.368 |
| 6573 | 0.435 | 0.353 |
| 6574 | 0.503 | 0.346 |
| 6575 | 0.556 | 0.348 |
| 6576 | 0.565 | 0.38 |
| 6577 | 0.568 | 0.405 |
| 6578 | 0.548 | 0.428 |
| 6579 | 0.533 | 0.479 |
| 6580 | 0.452 | 0.521 |
| 6581 | 0.388 | 0.548 |
| 6582 | 0.412 | 0.56 |
| 6583 | 0.413 | 0.537 |
| 6584 | 0.348 | 0.495 |
| 6585 | 0.391 | 0.475 |
| 6586 | 0.357 | 0.468 |
| 6587 | 0.311 | 0.46 |
| 6588 | 0.297 | 0.45 |
| 6589 | 0.315 | 0.427 |
| 6590 | 0.402 | 0.402 |
| 6591 | 0.395 | 0.375 |
| 6592 | 0.436 | 0.368 |
| 6593 | 0.385 | 0.378 |
| 6594 | 0.294 | 0.391 |
| 6595 | 0.277 | 0.398 |
| 6596 | 0.293 | 0.381 |
| 6597 | 0.276 | 0.352 |
| 6598 | 0.248 | 0.352 |
| 6599 | 0.204 | 0.361 |
| 6600 | 0.144 | 0.376 |
| 6601 | 0.103 | 0.396 |
| 6602 | 0.066 | 0.379 |
| 6603 | 0.052 | 0.343 |
| 6604 | 0.054 | 0.316 |
| 6605 | 0.051 | 0.28 |
| 6606 | 0.056 | 0.246 |
| 6607 | 0.043 | 0.223 |
| 6608 | 0.028 | 0.19 |
| 6609 | 0.032 | 0.147 |
| 6610 | 0.036 | 0.116 |
| 6611 | 0.061 | 0.101 |
| 6612 | 0.066 | 0.099 |
| 6613 | 0.096 | 0.114 |
| 6614 | 0.191 | 0.136 |
| 6615 | 0.34 | 0.16 |
| 6616 | 0.305 | 0.189 |
| 6617 | 0.384 | 0.237 |
| 6618 | 0.33 | 0.256 |
| 6619 | 0.329 | 0.24 |
| 6620 | 0.403 | 0.208 |
| 6621 | 0.385 | 0.127 |
| 6622 | 0.353 | 0.064 |
| 6623 | 0.345 | 0.027 |
| 6624 | 0.287 | 0.007 |
| 6625 | 0.27 | 0.032 |
| 6626 | 0.259 | 0.063 |
| 6627 | 0.25 | 0.103 |
| 6628 | 0.283 | 0.178 |
| 6629 | 0.312 | 0.257 |
| 6630 | 0.336 | 0.332 |
| 6631 | 0.384 | 0.398 |
| 6632 | 0.277 | 0.43 |
| 6633 | 0.388 | 0.446 |
| 6634 | 0.434 | 0.476 |
| 6635 | 0.485 | 0.488 |
| 6636 | 0.422 | 0.456 |
| 6637 | 0.363 | 0.41 |
| 6638 | 0.332 | 0.345 |
| 6639 | 0.288 | 0.297 |
| 6640 | 0.28 | 0.293 |
| 6641 | 0.298 | 0.3 |
| 6642 | 0.287 | 0.317 |
| 6643 | 0.384 | 0.352 |
| 6644 | 0.518 | 0.384 |
| 6645 | 0.611 | 0.42 |
| 6646 | 0.64 | 0.463 |
| 6647 | 0.684 | 0.484 |
| 6648 | 0.698 | 0.482 |
| 6649 | 0.663 | 0.479 |
| 6650 | 0.636 | 0.481 |
| 6651 | 0.604 | 0.494 |
| 6652 | 0.586 | 0.532 |
| 6653 | 0.53 | 0.563 |
| 6654 | 0.495 | 0.57 |
| 6655 | 0.461 | 0.591 |
| 6656 | 0.324 | 0.598 |
| 6657 | 0.266 | 0.615 |
| 6658 | 0.198 | 0.636 |
| 6659 | 0.138 | 0.634 |
| 6660 | 0.115 | 0.645 |
| 6661 | 0.093 | 0.646 |
| 6662 | 0.092 | 0.641 |
| 6663 | 0.105 | 0.63 |
| 6664 | 0.102 | 0.613 |
| 6665 | 0.107 | 0.6 |
| 6666 | 0.107 | 0.596 |
| 6667 | 0.154 | 0.605 |
| 6668 | 0.181 | 0.625 |
| 6669 | 0.226 | 0.652 |
| 6670 | 0.248 | 0.67 |
| 6671 | 0.265 | 0.688 |
| 6672 | 0.293 | 0.698 |
| 6673 | 0.331 | 0.713 |
| 6674 | 0.304 | 0.742 |
| 6675 | 0.313 | 0.779 |
| 6676 | 0.26 | 0.816 |
| 6677 | 0.207 | 0.844 |
| 6678 | 0.166 | 0.87 |
| 6679 | 0.118 | 0.884 |
| 6680 | 0.063 | 0.896 |
| 6681 | 0.032 | 0.9 |
| 6682 | 0.016 | 0.9 |
| 6683 | 0.007 | 0.9 |
| 6684 | 0.008 | 0.891 |
| 6685 | 0.007 | 0.888 |
| 6686 | 0.01 | 0.886 |
| 6687 | 0.022 | 0.886 |
| 6688 | 0.038 | 0.888 |
| 6689 | 0.063 | 0.862 |
| 6690 | 0.079 | 0.837 |
| 6691 | 0.167 | 0.806 |
| 6692 | 0.211 | 0.759 |
| 6693 | 0.259 | 0.73 |
| 6694 | 0.319 | 0.699 |
| 6695 | 0.367 | 0.667 |
| 6696 | 0.456 | 0.661 |
| 6697 | 0.578 | 0.637 |
| 6698 | 0.658 | 0.611 |
| 6699 | 0.632 | 0.632 |
| 6700 | 0.583 | 0.652 |
| 6701 | 0.562 | 0.678 |
| 6702 | 0.554 | 0.725 |
| 6703 | 0.532 | 0.736 |
| 6704 | 0.421 | 0.767 |
| 6705 | 0.351 | 0.822 |
| 6706 | 0.272 | 0.859 |
| 6707 | 0.22 | 0.885 |
| 6708 | 0.185 | 0.894 |
| 6709 | 0.164 | 0.894 |
| 6710 | 0.167 | 0.894 |
| 6711 | 0.194 | 0.9 |
| 6712 | 0.194 | 0.898 |
| 6713 | 0.19 | 0.884 |
| 6714 | 0.185 | 0.884 |
| 6715 | 0.296 | 0.884 |
| 6716 | 0.39 | 0.887 |
| 6717 | 0.447 | 0.9 |
| 6718 | 0.539 | 0.9 |
| 6719 | 0.628 | 0.9 |
| 6720 | 0.664 | 0.891 |
| 6721 | 0.653 | 0.885 |
| 6722 | 0.622 | 0.885 |
| 6723 | 0.611 | 0.885 |
| 6724 | 0.611 | 0.867 |
| 6725 | 0.6 | 0.867 |
| 6726 | 0.634 | 0.867 |
| 6727 | 0.657 | 0.86 |
| 6728 | 0.585 | 0.887 |
| 6729 | 0.598 | 0.893 |
| 6730 | 0.565 | 0.893 |
| 6731 | 0.444 | 0.9 |
| 6732 | 0.379 | 0.9 |
| 6733 | 0.34 | 0.891 |
| 6734 | 0.327 | 0.877 |
| 6735 | 0.326 | 0.859 |
| 6736 | 0.353 | 0.845 |
| 6737 | 0.39 | 0.823 |
| 6738 | 0.404 | 0.805 |
| 6739 | 0.512 | 0.782 |
| 6740 | 0.604 | 0.745 |
| 6741 | 0.662 | 0.719 |
| 6742 | 0.706 | 0.684 |
| 6743 | 0.747 | 0.661 |
| 6744 | 0.75 | 0.642 |
| 6745 | 0.75 | 0.634 |
| 6746 | 0.739 | 0.645 |
| 6747 | 0.752 | 0.652 |
| 6748 | 0.707 | 0.658 |
| 6749 | 0.694 | 0.652 |
| 6750 | 0.664 | 0.63 |
| 6751 | 0.614 | 0.612 |
| 6752 | 0.621 | 0.604 |
| 6753 | 0.733 | 0.593 |
| 6754 | 0.764 | 0.593 |
| 6755 | 0.67 | 0.579 |
| 6756 | 0.574 | 0.584 |
| 6757 | 0.492 | 0.608 |
| 6758 | 0.421 | 0.632 |
| 6759 | 0.413 | 0.67 |
| 6760 | 0.443 | 0.693 |
| 6761 | 0.489 | 0.716 |
| 6762 | 0.483 | 0.742 |
| 6763 | 0.489 | 0.783 |
| 6764 | 0.558 | 0.807 |
| 6765 | 0.651 | 0.837 |
| 6766 | 0.649 | 0.849 |
| 6767 | 0.63 | 0.859 |
| 6768 | 0.599 | 0.876 |
| 6769 | 0.604 | 0.883 |
| 6770 | 0.632 | 0.9 |
| 6771 | 0.623 | 0.895 |
| 6772 | 0.569 | 0.894 |
| 6773 | 0.555 | 0.875 |
| 6774 | 0.432 | 0.848 |
| 6775 | 0.307 | 0.814 |
| 6776 | 0.201 | 0.816 |
| 6777 | 0.149 | 0.812 |
| 6778 | 0.121 | 0.82 |
| 6779 | 0.109 | 0.817 |
| 6780 | 0.085 | 0.775 |
| 6781 | 0.085 | 0.757 |
| 6782 | 0.098 | 0.742 |
| 6783 | 0.173 | 0.77 |
| 6784 | 0.377 | 0.793 |
| 6785 | 0.601 | 0.81 |
| 6786 | 0.698 | 0.816 |
| 6787 | 0.687 | 0.8 |
| 6788 | 0.723 | 0.773 |
| 6789 | 0.734 | 0.758 |
| 6790 | 0.714 | 0.752 |
| 6791 | 0.592 | 0.739 |
| 6792 | 0.468 | 0.743 |
| 6793 | 0.476 | 0.737 |
| 6794 | 0.454 | 0.724 |
| 6795 | 0.441 | 0.699 |
| 6796 | 0.392 | 0.668 |
| 6797 | 0.36 | 0.638 |
| 6798 | 0.279 | 0.601 |
| 6799 | 0.203 | 0.579 |
| 6800 | 0.174 | 0.543 |
| 6801 | 0.138 | 0.502 |
| 6802 | 0.121 | 0.467 |
| 6803 | 0.1 | 0.429 |
| 6804 | 0.106 | 0.381 |
| 6805 | 0.087 | 0.332 |
| 6806 | 0.061 | 0.313 |
| 6807 | 0.028 | 0.301 |
| 6808 | 0.011 | 0.3 |
| 6809 | 0.003 | 0.304 |
| 6810 | 0.012 | 0.26 |
| 6811 | 0.013 | 0.211 |
| 6812 | 0.013 | 0.19 |
| 6813 | 0.011 | 0.182 |
| 6814 | 0.031 | 0.193 |
| 6815 | 0.059 | 0.205 |
| 6816 | 0.093 | 0.194 |
| 6817 | 0.11 | 0.166 |
| 6818 | 0.161 | 0.159 |
| 6819 | 0.21 | 0.176 |
| 6820 | 0.268 | 0.218 |
| 6821 | 0.318 | 0.255 |
| 6822 | 0.388 | 0.269 |
| 6823 | 0.497 | 0.286 |
| 6824 | 0.425 | 0.271 |
| 6825 | 0.384 | 0.263 |
| 6826 | 0.448 | 0.258 |
| 6827 | 0.458 | 0.241 |
| 6828 | 0.513 | 0.254 |
| 6829 | 0.541 | 0.277 |
| 6830 | 0.569 | 0.31 |
| 6831 | 0.628 | 0.351 |
| 6832 | 0.673 | 0.383 |
| 6833 | 0.686 | 0.387 |
| 6834 | 0.67 | 0.391 |
| 6835 | 0.716 | 0.31 |
| 6836 | 0.758 | 0.224 |
| 6837 | 0.802 | 0.177 |
| 6838 | 0.687 | 0.139 |
| 6839 | 0.601 | 0.172 |
| 6840 | 0.388 | 0.217 |
| 6841 | 0.271 | 0.236 |
| 6842 | 0.537 | 0.239 |
| 6843 | 0.742 | 0.239 |
| 6844 | 0.773 | 0.244 |
| 6845 | 0.816 | 0.272 |
| 6846 | 0.814 | 0.288 |
| 6847 | 0.816 | 0.293 |
| 6848 | 0.831 | 0.277 |
| 6849 | 0.863 | 0.253 |
| 6850 | 0.883 | 0.233 |
| 6851 | 0.894 | 0.22 |
| 6852 | 0.893 | 0.206 |
| 6853 | 0.883 | 0.178 |
| 6854 | 0.875 | 0.148 |
| 6855 | 0.861 | 0.126 |
| 6856 | 0.84 | 0.12 |
| 6857 | 0.788 | 0.139 |
| 6858 | 0.57 | 0.185 |
| 6859 | 0.439 | 0.226 |
| 6860 | 0.481 | 0.253 |
| 6861 | 0.472 | 0.243 |
| 6862 | 0.409 | 0.204 |
| 6863 | 0.343 | 0.164 |
| 6864 | 0.276 | 0.127 |
| 6865 | 0.259 | 0.102 |
| 6866 | 0.24 | 0.084 |
| 6867 | 0.193 | 0.059 |
| 6868 | 0.181 | 0.036 |
| 6869 | 0.223 | 0.018 |
| 6870 | 0.226 | 0.006 |
| 6871 | 0.17 | 0.001 |
| 6872 | 0.105 | 0 |
| 6873 | 0.038 | 0.028 |
| 6874 | 0.04 | 0.064 |
| 6875 | 0.071 | 0.114 |
| 6876 | 0.085 | 0.164 |
| 6877 | 0.074 | 0.172 |
| 6878 | 0.084 | 0.147 |
| 6879 | 0.094 | 0.107 |
| 6880 | 0.084 | 0.057 |
| 6881 | 0.05 | 0.021 |
| 6882 | 0.017 | 0.01 |
| 6883 | 0.018 | 0 |
| 6884 | 0.041 | 0 |
| 6885 | 0.054 | 0 |
| 6886 | 0.065 | 0 |
| 6887 | 0.073 | 0 |
| 6888 | 0.126 | 0 |
| 6889 | 0.178 | 0.006 |
| 6890 | 0.252 | 0.013 |
| 6891 | 0.312 | 0.027 |
| 6892 | 0.342 | 0.035 |
| 6893 | 0.328 | 0.034 |
| 6894 | 0.31 | 0.031 |
| 6895 | 0.304 | 0.018 |
| 6896 | 0.249 | 0.01 |
| 6897 | 0.125 | 0.023 |
| 6898 | 0.111 | 0.045 |
| 6899 | 0.058 | 0.069 |
| 6900 | 0.031 | 0.077 |
| 6901 | 0.016 | 0.064 |
| 6902 | 0.021 | 0.042 |
| 6903 | 0.022 | 0.025 |
| 6904 | 0.018 | 0.017 |
| 6905 | 0.026 | 0.022 |
| 6906 | 0.068 | 0.033 |
| 6907 | 0.135 | 0.048 |
| 6908 | 0.228 | 0.071 |
| 6909 | 0.35 | 0.093 |
| 6910 | 0.488 | 0.102 |
| 6911 | 0.529 | 0.087 |
| 6912 | 0.6 | 0.064 |
| 6913 | 0.634 | 0.039 |
| 6914 | 0.611 | 0.021 |
| 6915 | 0.652 | 0.04 |
| 6916 | 0.648 | 0.04 |
| 6917 | 0.661 | 0.038 |
| 6918 | 0.599 | 0.046 |
| 6919 | 0.573 | 0.027 |
| 6920 | 0.455 | 0.034 |
| 6921 | 0.277 | 0.048 |
| 6922 | 0.218 | 0.06 |
| 6923 | 0.169 | 0.102 |
| 6924 | 0.152 | 0.151 |
| 6925 | 0.156 | 0.207 |
| 6926 | 0.167 | 0.262 |
| 6927 | 0.169 | 0.289 |
| 6928 | 0.127 | 0.295 |
| 6929 | 0.109 | 0.272 |
| 6930 | 0.146 | 0.243 |
| 6931 | 0.232 | 0.238 |
| 6932 | 0.304 | 0.243 |
| 6933 | 0.484 | 0.248 |
| 6934 | 0.649 | 0.247 |
| 6935 | 0.672 | 0.211 |
| 6936 | 0.603 | 0.174 |
| 6937 | 0.549 | 0.15 |
| 6938 | 0.406 | 0.139 |
| 6939 | 0.243 | 0.152 |
| 6940 | 0.154 | 0.159 |
| 6941 | 0.139 | 0.139 |
| 6942 | 0.134 | 0.111 |
| 6943 | 0.159 | 0.065 |
| 6944 | 0.136 | 0.028 |
| 6945 | 0.069 | 0.015 |
| 6946 | 0.058 | 0.002 |
| 6947 | 0.06 | 0 |
| 6948 | 0.082 | 0 |
| 6949 | 0.098 | 0.004 |
| 6950 | 0.119 | 0.025 |
| 6951 | 0.134 | 0.045 |
| 6952 | 0.167 | 0.073 |
| 6953 | 0.196 | 0.081 |
| 6954 | 0.21 | 0.075 |
| 6955 | 0.337 | 0.077 |
| 6956 | 0.439 | 0.069 |
| 6957 | 0.454 | 0.066 |
| 6958 | 0.432 | 0.059 |
| 6959 | 0.371 | 0.07 |
| 6960 | 0.328 | 0.092 |
| 6961 | 0.331 | 0.13 |
| 6962 | 0.344 | 0.175 |
| 6963 | 0.353 | 0.202 |
| 6964 | 0.376 | 0.226 |
| 6965 | 0.374 | 0.25 |
| 6966 | 0.356 | 0.27 |
| 6967 | 0.336 | 0.285 |
| 6968 | 0.28 | 0.3 |
| 6969 | 0.285 | 0.314 |
| 6970 | 0.209 | 0.325 |
| 6971 | 0.157 | 0.329 |
| 6972 | 0.134 | 0.306 |
| 6973 | 0.129 | 0.261 |
| 6974 | 0.122 | 0.218 |
| 6975 | 0.118 | 0.189 |
| 6976 | 0.131 | 0.192 |
| 6977 | 0.17 | 0.22 |
| 6978 | 0.184 | 0.24 |
| 6979 | 0.23 | 0.247 |
| 6980 | 0.278 | 0.235 |
| 6981 | 0.296 | 0.232 |
| 6982 | 0.305 | 0.232 |
| 6983 | 0.288 | 0.231 |
| 6984 | 0.288 | 0.222 |
| 6985 | 0.28 | 0.218 |
| 6986 | 0.291 | 0.209 |
| 6987 | 0.246 | 0.197 |
| 6988 | 0.185 | 0.197 |
| 6989 | 0.133 | 0.18 |
| 6990 | 0.112 | 0.181 |
| 6991 | 0.128 | 0.197 |
| 6992 | 0.108 | 0.227 |
| 6993 | 0.07 | 0.249 |
| 6994 | 0.066 | 0.262 |
| 6995 | 0.062 | 0.255 |
| 6996 | 0.068 | 0.23 |
| 6997 | 0.06 | 0.202 |
| 6998 | 0.065 | 0.179 |
| 6999 | 0.099 | 0.172 |
| 7000 | 0.114 | 0.176 |
| 7001 | 0.187 | 0.19 |
| 7002 | 0.207 | 0.204 |
| 7003 | 0.309 | 0.242 |
| 7004 | 0.377 | 0.267 |
| 7005 | 0.396 | 0.28 |
| 7006 | 0.375 | 0.29 |
| 7007 | 0.373 | 0.282 |
| 7008 | 0.376 | 0.287 |
| 7009 | 0.343 | 0.317 |
| 7010 | 0.372 | 0.359 |
| 7011 | 0.331 | 0.393 |
| 7012 | 0.264 | 0.426 |
| 7013 | 0.185 | 0.45 |
| 7014 | 0.152 | 0.472 |
| 7015 | 0.145 | 0.492 |
| 7016 | 0.115 | 0.511 |
| 7017 | 0.085 | 0.544 |
| 7018 | 0.087 | 0.578 |
| 7019 | 0.035 | 0.612 |
| 7020 | 0.016 | 0.683 |
| 7021 | 0.017 | 0.749 |
| 7022 | 0.028 | 0.809 |
| 7023 | 0.049 | 0.87 |
| 7024 | 0.06 | 0.892 |
| 7025 | 0.067 | 0.897 |
| 7026 | 0.077 | 0.9 |
| 7027 | 0.125 | 0.9 |
| 7028 | 0.175 | 0.89 |
| 7029 | 0.218 | 0.867 |
| 7030 | 0.264 | 0.842 |
| 7031 | 0.279 | 0.823 |
| 7032 | 0.296 | 0.805 |
| 7033 | 0.292 | 0.8 |
| 7034 | 0.264 | 0.812 |
| 7035 | 0.226 | 0.827 |
| 7036 | 0.189 | 0.822 |
| 7037 | 0.176 | 0.81 |
| 7038 | 0.144 | 0.779 |
| 7039 | 0.113 | 0.751 |
| 7040 | 0.084 | 0.754 |
| 7041 | 0.051 | 0.743 |
| 7042 | 0.049 | 0.731 |
| 7043 | 0.047 | 0.711 |
| 7044 | 0.054 | 0.698 |
| 7045 | 0.067 | 0.713 |
| 7046 | 0.076 | 0.74 |
| 7047 | 0.074 | 0.774 |
| 7048 | 0.086 | 0.814 |
| 7049 | 0.086 | 0.851 |
| 7050 | 0.098 | 0.874 |
| 7051 | 0.148 | 0.894 |
| 7052 | 0.193 | 0.896 |
| 7053 | 0.238 | 0.881 |
| 7054 | 0.314 | 0.865 |
| 7055 | 0.363 | 0.844 |
| 7056 | 0.383 | 0.806 |
| 7057 | 0.382 | 0.776 |
| 7058 | 0.355 | 0.782 |
| 7059 | 0.331 | 0.783 |
| 7060 | 0.285 | 0.79 |
| 7061 | 0.226 | 0.807 |
| 7062 | 0.231 | 0.796 |
| 7063 | 0.218 | 0.796 |
| 7064 | 0.219 | 0.824 |
| 7065 | 0.17 | 0.842 |
| 7066 | 0.147 | 0.853 |
| 7067 | 0.149 | 0.868 |
| 7068 | 0.131 | 0.852 |
| 7069 | 0.11 | 0.846 |
| 7070 | 0.084 | 0.852 |
| 7071 | 0.091 | 0.856 |
| 7072 | 0.108 | 0.876 |
| 7073 | 0.115 | 0.892 |
| 7074 | 0.15 | 0.89 |
| 7075 | 0.176 | 0.87 |
| 7076 | 0.197 | 0.838 |
| 7077 | 0.221 | 0.802 |
| 7078 | 0.307 | 0.76 |
| 7079 | 0.263 | 0.734 |
| 7080 | 0.234 | 0.722 |
| 7081 | 0.264 | 0.718 |
| 7082 | 0.231 | 0.736 |
| 7083 | 0.21 | 0.752 |
| 7084 | 0.164 | 0.787 |
| 7085 | 0.162 | 0.826 |
| 7086 | 0.172 | 0.851 |
| 7087 | 0.147 | 0.859 |
| 7088 | 0.137 | 0.843 |
| 7089 | 0.09 | 0.836 |
| 7090 | 0.116 | 0.832 |
| 7091 | 0.121 | 0.835 |
| 7092 | 0.087 | 0.825 |
| 7093 | 0.05 | 0.787 |
| 7094 | 0.034 | 0.754 |
| 7095 | 0.035 | 0.719 |
| 7096 | 0.032 | 0.709 |
| 7097 | 0.048 | 0.731 |
| 7098 | 0.096 | 0.774 |
| 7099 | 0.166 | 0.827 |
| 7100 | 0.241 | 0.869 |
| 7101 | 0.284 | 0.893 |
| 7102 | 0.306 | 0.897 |
| 7103 | 0.321 | 0.897 |
| 7104 | 0.351 | 0.9 |
| 7105 | 0.363 | 0.892 |
| 7106 | 0.373 | 0.892 |
| 7107 | 0.377 | 0.892 |
| 7108 | 0.321 | 0.892 |
| 7109 | 0.303 | 0.894 |
| 7110 | 0.302 | 0.888 |
| 7111 | 0.286 | 0.883 |
| 7112 | 0.242 | 0.883 |
| 7113 | 0.127 | 0.89 |
| 7114 | 0.09 | 0.89 |
| 7115 | 0.057 | 0.885 |
| 7116 | 0.061 | 0.868 |
| 7117 | 0.075 | 0.863 |
| 7118 | 0.072 | 0.854 |
| 7119 | 0.062 | 0.839 |
| 7120 | 0.04 | 0.838 |
| 7121 | 0.04 | 0.84 |
| 7122 | 0.073 | 0.854 |
| 7123 | 0.171 | 0.878 |
| 7124 | 0.271 | 0.896 |
| 7125 | 0.374 | 0.889 |
| 7126 | 0.47 | 0.882 |
| 7127 | 0.482 | 0.882 |
| 7128 | 0.505 | 0.882 |
| 7129 | 0.531 | 0.892 |
| 7130 | 0.551 | 0.9 |
| 7131 | 0.524 | 0.897 |
| 7132 | 0.501 | 0.85 |
| 7133 | 0.465 | 0.796 |
| 7134 | 0.433 | 0.787 |
| 7135 | 0.407 | 0.788 |
| 7136 | 0.34 | 0.836 |
| 7137 | 0.235 | 0.889 |
| 7138 | 0.207 | 0.899 |
| 7139 | 0.125 | 0.9 |
| 7140 | 0.084 | 0.899 |
| 7141 | 0.091 | 0.899 |
| 7142 | 0.1 | 0.899 |
| 7143 | 0.108 | 0.899 |
| 7144 | 0.103 | 0.9 |
| 7145 | 0.114 | 0.897 |
| 7146 | 0.154 | 0.897 |
| 7147 | 0.306 | 0.897 |
| 7148 | 0.462 | 0.897 |
| 7149 | 0.599 | 0.898 |
| 7150 | 0.635 | 0.894 |
| 7151 | 0.669 | 0.892 |
| 7152 | 0.687 | 0.873 |
| 7153 | 0.686 | 0.854 |
| 7154 | 0.68 | 0.845 |
| 7155 | 0.659 | 0.82 |
| 7156 | 0.632 | 0.804 |
| 7157 | 0.54 | 0.8 |
| 7158 | 0.599 | 0.805 |
| 7159 | 0.595 | 0.814 |
| 7160 | 0.51 | 0.819 |
| 7161 | 0.433 | 0.826 |
| 7162 | 0.45 | 0.789 |
| 7163 | 0.421 | 0.754 |
| 7164 | 0.382 | 0.725 |
| 7165 | 0.367 | 0.69 |
| 7166 | 0.352 | 0.704 |
| 7167 | 0.329 | 0.747 |
| 7168 | 0.307 | 0.805 |
| 7169 | 0.312 | 0.832 |
| 7170 | 0.378 | 0.824 |
| 7171 | 0.607 | 0.79 |
| 7172 | 0.676 | 0.743 |
| 7173 | 0.705 | 0.726 |
| 7174 | 0.746 | 0.73 |
| 7175 | 0.707 | 0.749 |
| 7176 | 0.71 | 0.779 |
| 7177 | 0.69 | 0.809 |
| 7178 | 0.702 | 0.843 |
| 7179 | 0.705 | 0.866 |
| 7180 | 0.693 | 0.881 |
| 7181 | 0.71 | 0.895 |
| 7182 | 0.705 | 0.877 |
| 7183 | 0.692 | 0.876 |
| 7184 | 0.64 | 0.879 |
| 7185 | 0.584 | 0.879 |
| 7186 | 0.523 | 0.888 |
| 7187 | 0.475 | 0.872 |
| 7188 | 0.431 | 0.864 |
| 7189 | 0.384 | 0.864 |
| 7190 | 0.344 | 0.867 |
| 7191 | 0.323 | 0.868 |
| 7192 | 0.29 | 0.837 |
| 7193 | 0.274 | 0.784 |
| 7194 | 0.284 | 0.733 |
| 7195 | 0.366 | 0.709 |
| 7196 | 0.455 | 0.712 |
| 7197 | 0.464 | 0.719 |
| 7198 | 0.448 | 0.706 |
| 7199 | 0.302 | 0.681 |
| 7200 | 0.316 | 0.658 |
| 7201 | 0.297 | 0.642 |
| 7202 | 0.371 | 0.636 |
| 7203 | 0.47 | 0.625 |
| 7204 | 0.496 | 0.591 |
| 7205 | 0.538 | 0.551 |
| 7206 | 0.565 | 0.528 |
| 7207 | 0.559 | 0.512 |
| 7208 | 0.475 | 0.511 |
| 7209 | 0.486 | 0.516 |
| 7210 | 0.314 | 0.512 |
| 7211 | 0.213 | 0.499 |
| 7212 | 0.153 | 0.486 |
| 7213 | 0.111 | 0.493 |
| 7214 | 0.106 | 0.516 |
| 7215 | 0.096 | 0.552 |
| 7216 | 0.097 | 0.604 |
| 7217 | 0.076 | 0.653 |
| 7218 | 0.065 | 0.692 |
| 7219 | 0.125 | 0.704 |
| 7220 | 0.173 | 0.729 |
| 7221 | 0.208 | 0.772 |
| 7222 | 0.232 | 0.793 |
| 7223 | 0.234 | 0.832 |
| 7224 | 0.253 | 0.838 |
| 7225 | 0.227 | 0.81 |
| 7226 | 0.202 | 0.787 |
| 7227 | 0.197 | 0.77 |
| 7228 | 0.173 | 0.744 |
| 7229 | 0.154 | 0.716 |
| 7230 | 0.129 | 0.703 |
| 7231 | 0.1 | 0.694 |
| 7232 | 0.076 | 0.698 |
| 7233 | 0.033 | 0.71 |
| 7234 | 0.029 | 0.713 |
| 7235 | 0.025 | 0.727 |
| 7236 | 0.013 | 0.729 |
| 7237 | 0.004 | 0.698 |
| 7238 | 0.003 | 0.662 |
| 7239 | 0.005 | 0.596 |
| 7240 | 0.005 | 0.555 |
| 7241 | 0.009 | 0.549 |
| 7242 | 0.037 | 0.56 |
| 7243 | 0.099 | 0.57 |
| 7244 | 0.16 | 0.554 |
| 7245 | 0.304 | 0.522 |
| 7246 | 0.449 | 0.493 |
| 7247 | 0.392 | 0.484 |
| 7248 | 0.427 | 0.474 |
| 7249 | 0.461 | 0.476 |
| 7250 | 0.438 | 0.47 |
| 7251 | 0.412 | 0.445 |
| 7252 | 0.423 | 0.42 |
| 7253 | 0.435 | 0.412 |
| 7254 | 0.411 | 0.402 |
| 7255 | 0.38 | 0.403 |
| 7256 | 0.326 | 0.454 |
| 7257 | 0.203 | 0.5 |
| 7258 | 0.203 | 0.546 |
| 7259 | 0.091 | 0.586 |
| 7260 | 0.024 | 0.579 |
| 7261 | 0.009 | 0.58 |
| 7262 | 0.015 | 0.58 |
| 7263 | 0.027 | 0.576 |
| 7264 | 0.062 | 0.578 |
| 7265 | 0.162 | 0.566 |
| 7266 | 0.281 | 0.568 |
| 7267 | 0.375 | 0.589 |
| 7268 | 0.413 | 0.618 |
| 7269 | 0.448 | 0.664 |
| 7270 | 0.484 | 0.739 |
| 7271 | 0.508 | 0.803 |
| 7272 | 0.459 | 0.862 |
| 7273 | 0.427 | 0.9 |
| 7274 | 0.41 | 0.9 |
| 7275 | 0.404 | 0.9 |
| 7276 | 0.443 | 0.893 |
| 7277 | 0.416 | 0.881 |
| 7278 | 0.46 | 0.865 |
| 7279 | 0.458 | 0.843 |
| 7280 | 0.352 | 0.83 |
| 7281 | 0.361 | 0.818 |
| 7282 | 0.292 | 0.808 |
| 7283 | 0.25 | 0.785 |
| 7284 | 0.2 | 0.766 |
| 7285 | 0.191 | 0.756 |
| 7286 | 0.184 | 0.771 |
| 7287 | 0.163 | 0.808 |
| 7288 | 0.153 | 0.846 |
| 7289 | 0.134 | 0.869 |
| 7290 | 0.131 | 0.862 |
| 7291 | 0.203 | 0.85 |
| 7292 | 0.236 | 0.829 |
| 7293 | 0.258 | 0.803 |
| 7294 | 0.298 | 0.755 |
| 7295 | 0.278 | 0.69 |
| 7296 | 0.282 | 0.617 |
| 7297 | 0.274 | 0.557 |
| 7298 | 0.275 | 0.516 |
| 7299 | 0.278 | 0.483 |
| 7300 | 0.329 | 0.448 |
| 7301 | 0.378 | 0.41 |
| 7302 | 0.459 | 0.384 |
| 7303 | 0.463 | 0.377 |
| 7304 | 0.421 | 0.379 |
| 7305 | 0.427 | 0.376 |
| 7306 | 0.396 | 0.363 |
| 7307 | 0.321 | 0.346 |
| 7308 | 0.307 | 0.334 |
| 7309 | 0.328 | 0.333 |
| 7310 | 0.386 | 0.35 |
| 7311 | 0.447 | 0.328 |
| 7312 | 0.51 | 0.299 |
| 7313 | 0.509 | 0.276 |
| 7314 | 0.539 | 0.258 |
| 7315 | 0.688 | 0.293 |
| 7316 | 0.811 | 0.326 |
| 7317 | 0.845 | 0.342 |
| 7318 | 0.845 | 0.33 |
| 7319 | 0.813 | 0.294 |
| 7320 | 0.833 | 0.274 |
| 7321 | 0.822 | 0.271 |
| 7322 | 0.808 | 0.286 |
| 7323 | 0.79 | 0.31 |
| 7324 | 0.808 | 0.339 |
| 7325 | 0.81 | 0.362 |
| 7326 | 0.815 | 0.384 |
| 7327 | 0.84 | 0.42 |
| 7328 | 0.835 | 0.462 |
| 7329 | 0.845 | 0.514 |
| 7330 | 0.881 | 0.562 |
| 7331 | 0.879 | 0.597 |
| 7332 | 0.861 | 0.631 |
| 7333 | 0.838 | 0.662 |
| 7334 | 0.817 | 0.7 |
| 7335 | 0.816 | 0.741 |
| 7336 | 0.836 | 0.76 |
| 7337 | 0.822 | 0.778 |
| 7338 | 0.814 | 0.8 |
| 7339 | 0.791 | 0.806 |
| 7340 | 0.787 | 0.823 |
| 7341 | 0.797 | 0.832 |
| 7342 | 0.835 | 0.844 |
| 7343 | 0.846 | 0.868 |
| 7344 | 0.834 | 0.882 |
| 7345 | 0.844 | 0.899 |
| 7346 | 0.846 | 0.9 |
| 7347 | 0.852 | 0.9 |
| 7348 | 0.831 | 0.9 |
| 7349 | 0.795 | 0.9 |
| 7350 | 0.744 | 0.9 |
| 7351 | 0.716 | 0.894 |
| 7352 | 0.732 | 0.889 |
| 7353 | 0.786 | 0.885 |
| 7354 | 0.828 | 0.885 |
| 7355 | 0.834 | 0.891 |
| 7356 | 0.802 | 0.896 |
| 7357 | 0.776 | 0.898 |
| 7358 | 0.703 | 0.897 |
| 7359 | 0.655 | 0.897 |
| 7360 | 0.648 | 0.897 |
| 7361 | 0.622 | 0.899 |
| 7362 | 0.624 | 0.9 |
| 7363 | 0.677 | 0.889 |
| 7364 | 0.749 | 0.852 |
| 7365 | 0.726 | 0.818 |
| 7366 | 0.671 | 0.785 |
| 7367 | 0.547 | 0.752 |
| 7368 | 0.459 | 0.725 |
| 7369 | 0.391 | 0.674 |
| 7370 | 0.258 | 0.62 |
| 7371 | 0.206 | 0.563 |
| 7372 | 0.344 | 0.513 |
| 7373 | 0.406 | 0.48 |
| 7374 | 0.5 | 0.445 |
| 7375 | 0.6 | 0.425 |
| 7376 | 0.565 | 0.456 |
| 7377 | 0.531 | 0.482 |
| 7378 | 0.649 | 0.492 |
| 7379 | 0.67 | 0.511 |
| 7380 | 0.654 | 0.494 |
| 7381 | 0.68 | 0.499 |
| 7382 | 0.598 | 0.525 |
| 7383 | 0.545 | 0.534 |
| 7384 | 0.438 | 0.527 |
| 7385 | 0.274 | 0.498 |
| 7386 | 0.175 | 0.468 |
| 7387 | 0.147 | 0.41 |
| 7388 | 0.123 | 0.381 |
| 7389 | 0.107 | 0.329 |
| 7390 | 0.146 | 0.26 |
| 7391 | 0.114 | 0.229 |
| 7392 | 0.108 | 0.172 |
| 7393 | 0.078 | 0.148 |
| 7394 | 0.066 | 0.152 |
| 7395 | 0.06 | 0.152 |
| 7396 | 0.052 | 0.157 |
| 7397 | 0.05 | 0.146 |
| 7398 | 0.077 | 0.115 |
| 7399 | 0.068 | 0.071 |
| 7400 | 0.048 | 0.037 |
| 7401 | 0.041 | 0.025 |
| 7402 | 0.046 | 0.038 |
| 7403 | 0.048 | 0.062 |
| 7404 | 0.055 | 0.078 |
| 7405 | 0.037 | 0.081 |
| 7406 | 0.034 | 0.056 |
| 7407 | 0.035 | 0.032 |
| 7408 | 0.034 | 0.013 |
| 7409 | 0.058 | 0 |
| 7410 | 0.05 | 0 |
| 7411 | 0.055 | 0.006 |
| 7412 | 0.043 | 0.022 |
| 7413 | 0.041 | 0.043 |
| 7414 | 0.019 | 0.043 |
| 7415 | 0.023 | 0.046 |
| 7416 | 0.05 | 0.051 |
| 7417 | 0.071 | 0.056 |
| 7418 | 0.084 | 0.145 |
| 7419 | 0.094 | 0.23 |
| 7420 | 0.122 | 0.29 |
| 7421 | 0.148 | 0.341 |
| 7422 | 0.157 | 0.3 |
| 7423 | 0.163 | 0.277 |
| 7424 | 0.126 | 0.275 |
| 7425 | 0.103 | 0.284 |
| 7426 | 0.09 | 0.317 |
| 7427 | 0.099 | 0.326 |
| 7428 | 0.123 | 0.325 |
| 7429 | 0.104 | 0.295 |
| 7430 | 0.093 | 0.269 |
| 7431 | 0.107 | 0.23 |
| 7432 | 0.086 | 0.191 |
| 7433 | 0.068 | 0.186 |
| 7434 | 0.07 | 0.185 |
| 7435 | 0.082 | 0.205 |
| 7436 | 0.083 | 0.257 |
| 7437 | 0.063 | 0.303 |
| 7438 | 0.051 | 0.348 |
| 7439 | 0.044 | 0.391 |
| 7440 | 0.053 | 0.409 |
| 7441 | 0.046 | 0.412 |
| 7442 | 0.052 | 0.406 |
| 7443 | 0.07 | 0.389 |
| 7444 | 0.1 | 0.357 |
| 7445 | 0.149 | 0.32 |
| 7446 | 0.186 | 0.279 |
| 7447 | 0.23 | 0.258 |
| 7448 | 0.241 | 0.256 |
| 7449 | 0.145 | 0.276 |
| 7450 | 0.196 | 0.28 |
| 7451 | 0.28 | 0.282 |
| 7452 | 0.372 | 0.28 |
| 7453 | 0.426 | 0.272 |
| 7454 | 0.504 | 0.306 |
| 7455 | 0.547 | 0.337 |
| 7456 | 0.6 | 0.361 |
| 7457 | 0.5 | 0.39 |
| 7458 | 0.431 | 0.4 |
| 7459 | 0.53 | 0.415 |
| 7460 | 0.592 | 0.45 |
| 7461 | 0.613 | 0.466 |
| 7462 | 0.565 | 0.474 |
| 7463 | 0.523 | 0.471 |
| 7464 | 0.418 | 0.443 |
| 7465 | 0.368 | 0.428 |
| 7466 | 0.26 | 0.412 |
| 7467 | 0.194 | 0.388 |
| 7468 | 0.173 | 0.348 |
| 7469 | 0.288 | 0.3 |
| 7470 | 0.458 | 0.253 |
| 7471 | 0.688 | 0.211 |
| 7472 | 0.719 | 0.19 |
| 7473 | 0.748 | 0.214 |
| 7474 | 0.818 | 0.267 |
| 7475 | 0.795 | 0.305 |
| 7476 | 0.66 | 0.338 |
| 7477 | 0.558 | 0.33 |
| 7478 | 0.543 | 0.294 |
| 7479 | 0.476 | 0.27 |
| 7480 | 0.373 | 0.24 |
| 7481 | 0.205 | 0.203 |
| 7482 | 0.085 | 0.193 |
| 7483 | 0.056 | 0.191 |
| 7484 | 0.051 | 0.221 |
| 7485 | 0.046 | 0.241 |
| 7486 | 0.033 | 0.265 |
| 7487 | 0.036 | 0.26 |
| 7488 | 0.07 | 0.218 |
| 7489 | 0.11 | 0.206 |
| 7490 | 0.187 | 0.178 |
| 7491 | 0.268 | 0.187 |
| 7492 | 0.312 | 0.22 |
| 7493 | 0.354 | 0.248 |
| 7494 | 0.384 | 0.291 |
| 7495 | 0.463 | 0.322 |
| 7496 | 0.472 | 0.343 |
| 7497 | 0.341 | 0.359 |
| 7498 | 0.358 | 0.361 |
| 7499 | 0.455 | 0.342 |
| 7500 | 0.537 | 0.333 |
| 7501 | 0.634 | 0.327 |
| 7502 | 0.672 | 0.308 |
| 7503 | 0.662 | 0.301 |
| 7504 | 0.652 | 0.278 |
| 7505 | 0.503 | 0.256 |
| 7506 | 0.514 | 0.242 |
| 7507 | 0.679 | 0.223 |
| 7508 | 0.794 | 0.263 |
| 7509 | 0.855 | 0.296 |
| 7510 | 0.853 | 0.325 |
| 7511 | 0.806 | 0.374 |
| 7512 | 0.793 | 0.382 |
| 7513 | 0.758 | 0.394 |
| 7514 | 0.782 | 0.407 |
| 7515 | 0.782 | 0.402 |
| 7516 | 0.777 | 0.389 |
| 7517 | 0.803 | 0.377 |
| 7518 | 0.84 | 0.377 |
| 7519 | 0.825 | 0.395 |
| 7520 | 0.776 | 0.403 |
| 7521 | 0.671 | 0.407 |
| 7522 | 0.666 | 0.395 |
| 7523 | 0.724 | 0.376 |
| 7524 | 0.728 | 0.36 |
| 7525 | 0.764 | 0.335 |
| 7526 | 0.742 | 0.298 |
| 7527 | 0.724 | 0.254 |
| 7528 | 0.727 | 0.199 |
| 7529 | 0.674 | 0.148 |
| 7530 | 0.691 | 0.11 |
| 7531 | 0.789 | 0.063 |
| 7532 | 0.79 | 0.036 |
| 7533 | 0.765 | 0.016 |
| 7534 | 0.719 | 0 |
| 7535 | 0.688 | 0.02 |
| 7536 | 0.612 | 0.043 |
| 7537 | 0.721 | 0.065 |
| 7538 | 0.786 | 0.086 |
| 7539 | 0.758 | 0.066 |
| 7540 | 0.758 | 0.05 |
| 7541 | 0.767 | 0.031 |
| 7542 | 0.782 | 0.009 |
| 7543 | 0.737 | 0.009 |
| 7544 | 0.741 | 0.002 |
| 7545 | 0.702 | 0 |
| 7546 | 0.652 | 0 |
| 7547 | 0.533 | 0 |
| 7548 | 0.406 | 0 |
| 7549 | 0.345 | 0.01 |
| 7550 | 0.286 | 0.04 |
| 7551 | 0.19 | 0.051 |
| 7552 | 0.162 | 0.054 |
| 7553 | 0.145 | 0.044 |
| 7554 | 0.146 | 0.027 |
| 7555 | 0.216 | 0.034 |
| 7556 | 0.297 | 0.039 |
| 7557 | 0.364 | 0.05 |
| 7558 | 0.459 | 0.037 |
| 7559 | 0.491 | 0.02 |
| 7560 | 0.519 | 0.011 |
| 7561 | 0.582 | 0 |
| 7562 | 0.554 | 0.01 |
| 7563 | 0.538 | 0.031 |
| 7564 | 0.507 | 0.042 |
| 7565 | 0.446 | 0.046 |
| 7566 | 0.475 | 0.036 |
| 7567 | 0.507 | 0.015 |
| 7568 | 0.548 | 0.004 |
| 7569 | 0.552 | 0 |
| 7570 | 0.497 | 0.003 |
| 7571 | 0.436 | 0.008 |
| 7572 | 0.425 | 0.022 |
| 7573 | 0.448 | 0.041 |
| 7574 | 0.493 | 0.07 |
| 7575 | 0.565 | 0.105 |
| 7576 | 0.61 | 0.121 |
| 7577 | 0.614 | 0.126 |
| 7578 | 0.613 | 0.111 |
| 7579 | 0.609 | 0.087 |
| 7580 | 0.621 | 0.077 |
| 7581 | 0.629 | 0.084 |
| 7582 | 0.614 | 0.105 |
| 7583 | 0.617 | 0.136 |
| 7584 | 0.629 | 0.169 |
| 7585 | 0.616 | 0.174 |
| 7586 | 0.577 | 0.152 |
| 7587 | 0.513 | 0.116 |
| 7588 | 0.463 | 0.092 |
| 7589 | 0.461 | 0.079 |
| 7590 | 0.413 | 0.084 |
| 7591 | 0.364 | 0.113 |
| 7592 | 0.311 | 0.128 |
| 7593 | 0.291 | 0.149 |
| 7594 | 0.253 | 0.163 |
| 7595 | 0.215 | 0.151 |
| 7596 | 0.151 | 0.117 |
| 7597 | 0.106 | 0.096 |
| 7598 | 0.08 | 0.076 |
| 7599 | 0.058 | 0.066 |
| 7600 | 0.042 | 0.093 |
| 7601 | 0.026 | 0.116 |
| 7602 | 0.014 | 0.152 |
| 7603 | 0.021 | 0.185 |
| 7604 | 0.029 | 0.197 |
| 7605 | 0.031 | 0.212 |
| 7606 | 0.026 | 0.233 |
| 7607 | 0.032 | 0.262 |
| 7608 | 0.034 | 0.3 |
| 7609 | 0.04 | 0.325 |
| 7610 | 0.042 | 0.349 |
| 7611 | 0.061 | 0.385 |
| 7612 | 0.056 | 0.414 |
| 7613 | 0.066 | 0.459 |
| 7614 | 0.084 | 0.489 |
| 7615 | 0.102 | 0.486 |
| 7616 | 0.124 | 0.47 |
| 7617 | 0.156 | 0.443 |
| 7618 | 0.16 | 0.416 |
| 7619 | 0.14 | 0.402 |
| 7620 | 0.132 | 0.4 |
| 7621 | 0.15 | 0.411 |
| 7622 | 0.172 | 0.437 |
| 7623 | 0.167 | 0.467 |
| 7624 | 0.182 | 0.524 |
| 7625 | 0.18 | 0.571 |
| 7626 | 0.204 | 0.632 |
| 7627 | 0.28 | 0.674 |
| 7628 | 0.384 | 0.682 |
| 7629 | 0.502 | 0.696 |
| 7630 | 0.635 | 0.688 |
| 7631 | 0.626 | 0.684 |
| 7632 | 0.607 | 0.658 |
| 7633 | 0.618 | 0.609 |
| 7634 | 0.596 | 0.558 |
| 7635 | 0.643 | 0.522 |
| 7636 | 0.677 | 0.522 |
| 7637 | 0.691 | 0.52 |
| 7638 | 0.677 | 0.509 |
| 7639 | 0.669 | 0.444 |
| 7640 | 0.64 | 0.361 |
| 7641 | 0.68 | 0.297 |
| 7642 | 0.655 | 0.219 |
| 7643 | 0.53 | 0.185 |
| 7644 | 0.441 | 0.158 |
| 7645 | 0.407 | 0.112 |
| 7646 | 0.373 | 0.075 |
| 7647 | 0.344 | 0.044 |
| 7648 | 0.321 | 0.012 |
| 7649 | 0.292 | 0 |
| 7650 | 0.42 | 0.006 |
| 7651 | 0.523 | 0.013 |
| 7652 | 0.574 | 0.022 |
| 7653 | 0.577 | 0.041 |
| 7654 | 0.494 | 0.038 |
| 7655 | 0.513 | 0.032 |
| 7656 | 0.495 | 0.022 |
| 7657 | 0.408 | 0.004 |
| 7658 | 0.302 | 0.011 |
| 7659 | 0.239 | 0.019 |
| 7660 | 0.307 | 0.024 |
| 7661 | 0.359 | 0.028 |
| 7662 | 0.371 | 0.018 |
| 7663 | 0.524 | 0.009 |
| 7664 | 0.598 | 0.005 |
| 7665 | 0.609 | 0 |
| 7666 | 0.524 | 0.009 |
| 7667 | 0.416 | 0.026 |
| 7668 | 0.329 | 0.026 |
| 7669 | 0.27 | 0.026 |
| 7670 | 0.258 | 0.027 |
| 7671 | 0.283 | 0.027 |
| 7672 | 0.246 | 0.046 |
| 7673 | 0.22 | 0.07 |
| 7674 | 0.251 | 0.087 |
| 7675 | 0.26 | 0.098 |
| 7676 | 0.241 | 0.108 |
| 7677 | 0.216 | 0.116 |
| 7678 | 0.215 | 0.145 |
| 7679 | 0.214 | 0.173 |
| 7680 | 0.231 | 0.197 |
| 7681 | 0.257 | 0.204 |
| 7682 | 0.275 | 0.169 |
| 7683 | 0.28 | 0.133 |
| 7684 | 0.281 | 0.117 |
| 7685 | 0.292 | 0.118 |
| 7686 | 0.308 | 0.106 |
| 7687 | 0.264 | 0.085 |
| 7688 | 0.207 | 0.051 |
| 7689 | 0.132 | 0.019 |
| 7690 | 0.092 | 0.024 |
| 7691 | 0.088 | 0.054 |
| 7692 | 0.075 | 0.087 |
| 7693 | 0.066 | 0.09 |
| 7694 | 0.064 | 0.076 |
| 7695 | 0.055 | 0.064 |
| 7696 | 0.034 | 0.039 |
| 7697 | 0.022 | 0.036 |
| 7698 | 0.022 | 0.042 |
| 7699 | 0.038 | 0.023 |
| 7700 | 0.074 | 0.014 |
| 7701 | 0.125 | 0.006 |
| 7702 | 0.169 | 0 |
| 7703 | 0.251 | 0 |
| 7704 | 0.315 | 0.009 |
| 7705 | 0.392 | 0.009 |
| 7706 | 0.446 | 0.009 |
| 7707 | 0.508 | 0.019 |
| 7708 | 0.569 | 0.046 |
| 7709 | 0.563 | 0.086 |
| 7710 | 0.549 | 0.159 |
| 7711 | 0.525 | 0.223 |
| 7712 | 0.529 | 0.25 |
| 7713 | 0.408 | 0.258 |
| 7714 | 0.429 | 0.22 |
| 7715 | 0.448 | 0.166 |
| 7716 | 0.484 | 0.118 |
| 7717 | 0.449 | 0.102 |
| 7718 | 0.447 | 0.103 |
| 7719 | 0.46 | 0.127 |
| 7720 | 0.486 | 0.164 |
| 7721 | 0.465 | 0.189 |
| 7722 | 0.472 | 0.216 |
| 7723 | 0.665 | 0.235 |
| 7724 | 0.772 | 0.237 |
| 7725 | 0.816 | 0.18 |
| 7726 | 0.814 | 0.118 |
| 7727 | 0.813 | 0.06 |
| 7728 | 0.78 | 0.022 |
| 7729 | 0.761 | 0.038 |
| 7730 | 0.721 | 0.064 |
| 7731 | 0.702 | 0.059 |
| 7732 | 0.649 | 0.042 |
| 7733 | 0.635 | 0.026 |
| 7734 | 0.612 | 0 |
| 7735 | 0.593 | 0 |
| 7736 | 0.54 | 0 |
| 7737 | 0.348 | 0 |
| 7738 | 0.222 | 0 |
| 7739 | 0.14 | 0.004 |
| 7740 | 0.121 | 0.004 |
| 7741 | 0.106 | 0.004 |
| 7742 | 0.052 | 0.004 |
| 7743 | 0.058 | 0 |
| 7744 | 0.063 | 0 |
| 7745 | 0.037 | 0.003 |
| 7746 | 0.052 | 0.011 |
| 7747 | 0.107 | 0.03 |
| 7748 | 0.166 | 0.052 |
| 7749 | 0.28 | 0.075 |
| 7750 | 0.416 | 0.094 |
| 7751 | 0.51 | 0.11 |
| 7752 | 0.556 | 0.138 |
| 7753 | 0.57 | 0.172 |
| 7754 | 0.539 | 0.21 |
| 7755 | 0.509 | 0.227 |
| 7756 | 0.518 | 0.22 |
| 7757 | 0.53 | 0.191 |
| 7758 | 0.502 | 0.135 |
| 7759 | 0.481 | 0.096 |
| 7760 | 0.48 | 0.053 |
| 7761 | 0.39 | 0.022 |
| 7762 | 0.312 | 0.014 |
| 7763 | 0.335 | 0 |
| 7764 | 0.299 | 0 |
| 7765 | 0.299 | 0.011 |
| 7766 | 0.314 | 0.011 |
| 7767 | 0.321 | 0.011 |
| 7768 | 0.291 | 0.011 |
| 7769 | 0.228 | 0 |
| 7770 | 0.254 | 0 |
| 7771 | 0.39 | 0.019 |
| 7772 | 0.548 | 0.046 |
| 7773 | 0.653 | 0.084 |
| 7774 | 0.656 | 0.133 |
| 7775 | 0.641 | 0.184 |
| 7776 | 0.613 | 0.234 |
| 7777 | 0.557 | 0.283 |
| 7778 | 0.483 | 0.36 |
| 7779 | 0.408 | 0.426 |
| 7780 | 0.422 | 0.493 |
| 7781 | 0.383 | 0.56 |
| 7782 | 0.352 | 0.594 |
| 7783 | 0.316 | 0.614 |
| 7784 | 0.275 | 0.612 |
| 7785 | 0.255 | 0.589 |
| 7786 | 0.251 | 0.582 |
| 7787 | 0.244 | 0.579 |
| 7788 | 0.244 | 0.612 |
| 7789 | 0.222 | 0.637 |
| 7790 | 0.229 | 0.635 |
| 7791 | 0.253 | 0.624 |
| 7792 | 0.253 | 0.598 |
| 7793 | 0.206 | 0.639 |
| 7794 | 0.203 | 0.684 |
| 7795 | 0.283 | 0.746 |
| 7796 | 0.408 | 0.806 |
| 7797 | 0.512 | 0.828 |
| 7798 | 0.545 | 0.859 |
| 7799 | 0.478 | 0.872 |
| 7800 | 0.407 | 0.889 |
| 7801 | 0.391 | 0.894 |
| 7802 | 0.398 | 0.894 |
| 7803 | 0.431 | 0.898 |
| 7804 | 0.465 | 0.886 |
| 7805 | 0.403 | 0.881 |
| 7806 | 0.361 | 0.881 |
| 7807 | 0.349 | 0.874 |
| 7808 | 0.308 | 0.868 |
| 7809 | 0.315 | 0.853 |
| 7810 | 0.266 | 0.825 |
| 7811 | 0.218 | 0.796 |
| 7812 | 0.167 | 0.766 |
| 7813 | 0.228 | 0.723 |
| 7814 | 0.125 | 0.688 |
| 7815 | 0.202 | 0.696 |
| 7816 | 0.142 | 0.719 |
| 7817 | 0.172 | 0.772 |
| 7818 | 0.202 | 0.835 |
| 7819 | 0.202 | 0.865 |
| 7820 | 0.261 | 0.89 |
| 7821 | 0.368 | 0.9 |
| 7822 | 0.368 | 0.883 |
| 7823 | 0.343 | 0.878 |
| 7824 | 0.367 | 0.878 |
| 7825 | 0.384 | 0.878 |
| 7826 | 0.496 | 0.894 |
| 7827 | 0.547 | 0.9 |
| 7828 | 0.593 | 0.87 |
| 7829 | 0.62 | 0.837 |
| 7830 | 0.632 | 0.789 |
| 7831 | 0.71 | 0.758 |
| 7832 | 0.686 | 0.775 |
| 7833 | 0.594 | 0.794 |
| 7834 | 0.595 | 0.833 |
| 7835 | 0.727 | 0.857 |
| 7836 | 0.775 | 0.87 |
| 7837 | 0.832 | 0.86 |
| 7838 | 0.832 | 0.815 |
| 7839 | 0.776 | 0.772 |
| 7840 | 0.728 | 0.723 |
| 7841 | 0.732 | 0.699 |
| 7842 | 0.818 | 0.717 |
| 7843 | 0.836 | 0.731 |
| 7844 | 0.8 | 0.724 |
| 7845 | 0.595 | 0.714 |
| 7846 | 0.344 | 0.69 |
| 7847 | 0.198 | 0.664 |
| 7848 | 0.173 | 0.665 |
| 7849 | 0.203 | 0.688 |
| 7850 | 0.263 | 0.729 |
| 7851 | 0.311 | 0.772 |
| 7852 | 0.317 | 0.804 |
| 7853 | 0.284 | 0.832 |
| 7854 | 0.276 | 0.836 |
| 7855 | 0.207 | 0.847 |
| 7856 | 0.118 | 0.857 |
| 7857 | 0.046 | 0.835 |
| 7858 | 0.019 | 0.818 |
| 7859 | 0.02 | 0.785 |
| 7860 | 0.039 | 0.753 |
| 7861 | 0.093 | 0.717 |
| 7862 | 0.11 | 0.684 |
| 7863 | 0.071 | 0.617 |
| 7864 | 0.042 | 0.559 |
| 7865 | 0.03 | 0.528 |
| 7866 | 0.033 | 0.501 |
| 7867 | 0.031 | 0.558 |
| 7868 | 0.028 | 0.605 |
| 7869 | 0.044 | 0.7 |
| 7870 | 0.064 | 0.792 |
| 7871 | 0.063 | 0.84 |
| 7872 | 0.062 | 0.892 |
| 7873 | 0.066 | 0.891 |
| 7874 | 0.082 | 0.878 |
| 7875 | 0.097 | 0.88 |
| 7876 | 0.138 | 0.882 |
| 7877 | 0.2 | 0.871 |
| 7878 | 0.348 | 0.841 |
| 7879 | 0.332 | 0.791 |
| 7880 | 0.278 | 0.736 |
| 7881 | 0.152 | 0.684 |
| 7882 | 0.076 | 0.641 |
| 7883 | 0.047 | 0.602 |
| 7884 | 0.017 | 0.56 |
| 7885 | 0.023 | 0.522 |
| 7886 | 0.174 | 0.502 |
| 7887 | 0.288 | 0.465 |
| 7888 | 0.35 | 0.449 |
| 7889 | 0.373 | 0.442 |
| 7890 | 0.366 | 0.45 |
| 7891 | 0.475 | 0.484 |
| 7892 | 0.593 | 0.521 |
| 7893 | 0.63 | 0.593 |
| 7894 | 0.707 | 0.659 |
| 7895 | 0.756 | 0.722 |
| 7896 | 0.762 | 0.781 |
| 7897 | 0.732 | 0.814 |
| 7898 | 0.71 | 0.847 |
| 7899 | 0.633 | 0.876 |
| 7900 | 0.588 | 0.891 |
| 7901 | 0.549 | 0.883 |
| 7902 | 0.496 | 0.883 |
| 7903 | 0.48 | 0.88 |
| 7904 | 0.46 | 0.886 |
| 7905 | 0.417 | 0.896 |
| 7906 | 0.358 | 0.876 |
| 7907 | 0.329 | 0.854 |
| 7908 | 0.231 | 0.832 |
| 7909 | 0.166 | 0.816 |
| 7910 | 0.1 | 0.801 |
| 7911 | 0.073 | 0.781 |
| 7912 | 0.057 | 0.747 |
| 7913 | 0.027 | 0.732 |
| 7914 | 0.07 | 0.741 |
| 7915 | 0.14 | 0.774 |
| 7916 | 0.151 | 0.8 |
| 7917 | 0.165 | 0.807 |
| 7918 | 0.195 | 0.806 |
| 7919 | 0.22 | 0.795 |
| 7920 | 0.242 | 0.811 |
| 7921 | 0.227 | 0.836 |
| 7922 | 0.243 | 0.853 |
| 7923 | 0.255 | 0.873 |
| 7924 | 0.292 | 0.886 |
| 7925 | 0.252 | 0.888 |
| 7926 | 0.236 | 0.886 |
| 7927 | 0.194 | 0.862 |
| 7928 | 0.173 | 0.859 |
| 7929 | 0.108 | 0.856 |
| 7930 | 0.096 | 0.836 |
| 7931 | 0.079 | 0.828 |
| 7932 | 0.094 | 0.771 |
| 7933 | 0.099 | 0.72 |
| 7934 | 0.098 | 0.717 |
| 7935 | 0.129 | 0.715 |
| 7936 | 0.164 | 0.713 |
| 7937 | 0.199 | 0.687 |
| 7938 | 0.265 | 0.661 |
| 7939 | 0.446 | 0.662 |
| 7940 | 0.613 | 0.686 |
| 7941 | 0.776 | 0.761 |
| 7942 | 0.844 | 0.813 |
| 7943 | 0.87 | 0.853 |
| 7944 | 0.867 | 0.891 |
| 7945 | 0.865 | 0.895 |
| 7946 | 0.849 | 0.9 |
| 7947 | 0.846 | 0.9 |
| 7948 | 0.837 | 0.899 |
| 7949 | 0.822 | 0.899 |
| 7950 | 0.802 | 0.891 |
| 7951 | 0.776 | 0.863 |
| 7952 | 0.765 | 0.826 |
| 7953 | 0.659 | 0.771 |
| 7954 | 0.687 | 0.718 |
| 7955 | 0.673 | 0.678 |
| 7956 | 0.687 | 0.642 |
| 7957 | 0.69 | 0.608 |
| 7958 | 0.668 | 0.586 |
| 7959 | 0.676 | 0.585 |
| 7960 | 0.65 | 0.593 |
| 7961 | 0.588 | 0.61 |
| 7962 | 0.665 | 0.624 |
| 7963 | 0.804 | 0.617 |
| 7964 | 0.872 | 0.621 |
| 7965 | 0.884 | 0.635 |
| 7966 | 0.888 | 0.65 |
| 7967 | 0.885 | 0.665 |
| 7968 | 0.852 | 0.629 |
| 7969 | 0.772 | 0.588 |
| 7970 | 0.758 | 0.534 |
| 7971 | 0.768 | 0.486 |
| 7972 | 0.766 | 0.467 |
| 7973 | 0.796 | 0.447 |
| 7974 | 0.767 | 0.453 |
| 7975 | 0.838 | 0.456 |
| 7976 | 0.819 | 0.466 |
| 7977 | 0.75 | 0.467 |
| 7978 | 0.65 | 0.443 |
| 7979 | 0.62 | 0.42 |
| 7980 | 0.609 | 0.403 |
| 7981 | 0.625 | 0.414 |
| 7982 | 0.609 | 0.434 |
| 7983 | 0.623 | 0.451 |
| 7984 | 0.604 | 0.474 |
| 7985 | 0.519 | 0.482 |
| 7986 | 0.638 | 0.484 |
| 7987 | 0.768 | 0.49 |
| 7988 | 0.843 | 0.485 |
| 7989 | 0.865 | 0.466 |
| 7990 | 0.877 | 0.448 |
| 7991 | 0.85 | 0.45 |
| 7992 | 0.805 | 0.454 |
| 7993 | 0.758 | 0.478 |
| 7994 | 0.679 | 0.521 |
| 7995 | 0.618 | 0.537 |
| 7996 | 0.639 | 0.543 |
| 7997 | 0.612 | 0.531 |
| 7998 | 0.612 | 0.486 |
| 7999 | 0.676 | 0.443 |
| 8000 | 0.652 | 0.406 |
| 8001 | 0.521 | 0.358 |
| 8002 | 0.431 | 0.32 |
| 8003 | 0.386 | 0.281 |
| 8004 | 0.35 | 0.285 |
| 8005 | 0.27 | 0.302 |
| 8006 | 0.197 | 0.307 |
| 8007 | 0.147 | 0.28 |
| 8008 | 0.144 | 0.215 |
| 8009 | 0.147 | 0.167 |
| 8010 | 0.231 | 0.131 |
| 8011 | 0.334 | 0.121 |
| 8012 | 0.43 | 0.119 |
| 8013 | 0.493 | 0.082 |
| 8014 | 0.52 | 0.055 |
| 8015 | 0.497 | 0.045 |
| 8016 | 0.565 | 0.047 |
| 8017 | 0.577 | 0.098 |
| 8018 | 0.622 | 0.094 |
| 8019 | 0.622 | 0.092 |
| 8020 | 0.658 | 0.075 |
| 8021 | 0.726 | 0.052 |
| 8022 | 0.738 | 0.098 |
| 8023 | 0.784 | 0.147 |
| 8024 | 0.767 | 0.195 |
| 8025 | 0.694 | 0.232 |
| 8026 | 0.611 | 0.258 |
| 8027 | 0.528 | 0.276 |
| 8028 | 0.439 | 0.282 |
| 8029 | 0.343 | 0.27 |
| 8030 | 0.245 | 0.226 |
| 8031 | 0.219 | 0.18 |
| 8032 | 0.154 | 0.115 |
| 8033 | 0.092 | 0.059 |
| 8034 | 0.062 | 0.028 |
| 8035 | 0.056 | 0.004 |
| 8036 | 0.037 | 0.023 |
| 8037 | 0.035 | 0.048 |
| 8038 | 0.015 | 0.075 |
| 8039 | 0.014 | 0.083 |
| 8040 | 0.012 | 0.076 |
| 8041 | 0.009 | 0.06 |
| 8042 | 0.012 | 0.041 |
| 8043 | 0.007 | 0.036 |
| 8044 | 0.01 | 0.052 |
| 8045 | 0.012 | 0.079 |
| 8046 | 0.014 | 0.125 |
| 8047 | 0.03 | 0.155 |
| 8048 | 0.052 | 0.196 |
| 8049 | 0.058 | 0.229 |
| 8050 | 0.098 | 0.252 |
| 8051 | 0.065 | 0.296 |
| 8052 | 0.061 | 0.304 |
| 8053 | 0.09 | 0.307 |
| 8054 | 0.14 | 0.294 |
| 8055 | 0.215 | 0.293 |
| 8056 | 0.238 | 0.284 |
| 8057 | 0.32 | 0.259 |
| 8058 | 0.432 | 0.245 |
| 8059 | 0.577 | 0.219 |
| 8060 | 0.645 | 0.212 |
| 8061 | 0.633 | 0.224 |
| 8062 | 0.628 | 0.191 |
| 8063 | 0.573 | 0.135 |
| 8064 | 0.532 | 0.076 |
| 8065 | 0.526 | 0.02 |
| 8066 | 0.576 | 0.007 |
| 8067 | 0.601 | 0.025 |
| 8068 | 0.566 | 0.044 |
| 8069 | 0.495 | 0.059 |
| 8070 | 0.448 | 0.074 |
| 8071 | 0.357 | 0.076 |
| 8072 | 0.346 | 0.07 |
| 8073 | 0.309 | 0.068 |
| 8074 | 0.279 | 0.057 |
| 8075 | 0.193 | 0.038 |
| 8076 | 0.148 | 0.026 |
| 8077 | 0.111 | 0.011 |
| 8078 | 0.058 | 0.005 |
| 8079 | 0.04 | 0.012 |
| 8080 | 0.05 | 0.019 |
| 8081 | 0.052 | 0.024 |
| 8082 | 0.095 | 0.021 |
| 8083 | 0.16 | 0.014 |
| 8084 | 0.18 | 0.006 |
| 8085 | 0.206 | 0.007 |
| 8086 | 0.193 | 0.025 |
| 8087 | 0.224 | 0.045 |
| 8088 | 0.226 | 0.066 |
| 8089 | 0.192 | 0.082 |
| 8090 | 0.184 | 0.097 |
| 8091 | 0.175 | 0.112 |
| 8092 | 0.184 | 0.142 |
| 8093 | 0.216 | 0.17 |
| 8094 | 0.269 | 0.159 |
| 8095 | 0.298 | 0.142 |
| 8096 | 0.341 | 0.106 |
| 8097 | 0.315 | 0.069 |
| 8098 | 0.337 | 0.052 |
| 8099 | 0.418 | 0.035 |
| 8100 | 0.463 | 0.036 |
| 8101 | 0.519 | 0.04 |
| 8102 | 0.519 | 0.048 |
| 8103 | 0.51 | 0.067 |
| 8104 | 0.458 | 0.087 |
| 8105 | 0.357 | 0.108 |
| 8106 | 0.344 | 0.133 |
| 8107 | 0.449 | 0.207 |
| 8108 | 0.568 | 0.274 |
| 8109 | 0.6 | 0.342 |
| 8110 | 0.6 | 0.388 |
| 8111 | 0.599 | 0.415 |
| 8112 | 0.642 | 0.437 |
| 8113 | 0.654 | 0.443 |
| 8114 | 0.622 | 0.466 |
| 8115 | 0.562 | 0.46 |
| 8116 | 0.555 | 0.459 |
| 8117 | 0.503 | 0.464 |
| 8118 | 0.469 | 0.466 |
| 8119 | 0.455 | 0.47 |
| 8120 | 0.387 | 0.444 |
| 8121 | 0.25 | 0.437 |
| 8122 | 0.285 | 0.451 |
| 8123 | 0.287 | 0.46 |
| 8124 | 0.277 | 0.494 |
| 8125 | 0.304 | 0.529 |
| 8126 | 0.264 | 0.548 |
| 8127 | 0.223 | 0.565 |
| 8128 | 0.242 | 0.579 |
| 8129 | 0.202 | 0.584 |
| 8130 | 0.277 | 0.606 |
| 8131 | 0.3 | 0.626 |
| 8132 | 0.296 | 0.654 |
| 8133 | 0.269 | 0.685 |
| 8134 | 0.253 | 0.729 |
| 8135 | 0.232 | 0.761 |
| 8136 | 0.214 | 0.776 |
| 8137 | 0.224 | 0.787 |
| 8138 | 0.244 | 0.779 |
| 8139 | 0.272 | 0.783 |
| 8140 | 0.291 | 0.794 |
| 8141 | 0.276 | 0.791 |
| 8142 | 0.268 | 0.75 |
| 8143 | 0.277 | 0.727 |
| 8144 | 0.248 | 0.711 |
| 8145 | 0.152 | 0.713 |
| 8146 | 0.081 | 0.754 |
| 8147 | 0.049 | 0.782 |
| 8148 | 0.028 | 0.822 |
| 8149 | 0.029 | 0.856 |
| 8150 | 0.034 | 0.873 |
| 8151 | 0.053 | 0.886 |
| 8152 | 0.097 | 0.859 |
| 8153 | 0.134 | 0.826 |
| 8154 | 0.187 | 0.796 |
| 8155 | 0.253 | 0.773 |
| 8156 | 0.254 | 0.78 |
| 8157 | 0.25 | 0.776 |
| 8158 | 0.226 | 0.766 |
| 8159 | 0.173 | 0.726 |
| 8160 | 0.109 | 0.673 |
| 8161 | 0.077 | 0.632 |
| 8162 | 0.069 | 0.597 |
| 8163 | 0.078 | 0.585 |
| 8164 | 0.051 | 0.565 |
| 8165 | 0.028 | 0.521 |
| 8166 | 0.043 | 0.488 |
| 8167 | 0.038 | 0.458 |
| 8168 | 0.024 | 0.423 |
| 8169 | 0.021 | 0.368 |
| 8170 | 0.038 | 0.297 |
| 8171 | 0.029 | 0.219 |
| 8172 | 0.027 | 0.127 |
| 8173 | 0.009 | 0.09 |
| 8174 | 0.006 | 0.058 |
| 8175 | 0.003 | 0.025 |
| 8176 | 0.005 | 0.02 |
| 8177 | 0.003 | 0.007 |
| 8178 | 0.015 | 0 |
| 8179 | 0.015 | 0 |
| 8180 | 0.015 | 0 |
| 8181 | 0.02 | 0 |
| 8182 | 0.027 | 0.003 |
| 8183 | 0.035 | 0.003 |
| 8184 | 0.037 | 0.003 |
| 8185 | 0.032 | 0.011 |
| 8186 | 0.041 | 0.008 |
| 8187 | 0.044 | 0.008 |
| 8188 | 0.041 | 0.008 |
| 8189 | 0.046 | 0.002 |
| 8190 | 0.059 | 0.002 |
| 8191 | 0.057 | 0.002 |
| 8192 | 0.052 | 0.002 |
| 8193 | 0.037 | 0.006 |
| 8194 | 0.016 | 0.008 |
| 8195 | 0.004 | 0.008 |
| 8196 | 0.002 | 0.008 |
| 8197 | 0 | 0.002 |
| 8198 | 0.005 | 0 |
| 8199 | 0 | 0 |
| 8200 | 0 | 0 |
| 8201 | 0.009 | 0 |
| 8202 | 0.031 | 0 |
| 8203 | 0.036 | 0.005 |
| 8204 | 0.041 | 0.024 |
| 8205 | 0.055 | 0.049 |
| 8206 | 0.08 | 0.082 |
| 8207 | 0.093 | 0.116 |
| 8208 | 0.123 | 0.141 |
| 8209 | 0.161 | 0.14 |
| 8210 | 0.16 | 0.116 |
| 8211 | 0.144 | 0.079 |
| 8212 | 0.097 | 0.035 |
| 8213 | 0.083 | 0.017 |
| 8214 | 0.059 | 0.02 |
| 8215 | 0.05 | 0.019 |
| 8216 | 0.056 | 0.022 |
| 8217 | 0.047 | 0.015 |
| 8218 | 0.027 | 0.003 |
| 8219 | 0.035 | 0.003 |
| 8220 | 0.045 | 0.002 |
| 8221 | 0.037 | 0.013 |
| 8222 | 0.03 | 0.013 |
| 8223 | 0.031 | 0.013 |
| 8224 | 0.028 | 0.011 |
| 8225 | 0.026 | 0 |
| 8226 | 0.043 | 0 |
| 8227 | 0.072 | 0 |
| 8228 | 0.092 | 0.01 |
| 8229 | 0.16 | 0.046 |
| 8230 | 0.242 | 0.087 |
| 8231 | 0.314 | 0.132 |
| 8232 | 0.339 | 0.168 |
| 8233 | 0.301 | 0.185 |
| 8234 | 0.268 | 0.207 |
| 8235 | 0.215 | 0.218 |
| 8236 | 0.201 | 0.217 |
| 8237 | 0.215 | 0.204 |
| 8238 | 0.252 | 0.153 |
| 8239 | 0.257 | 0.097 |
| 8240 | 0.232 | 0.06 |
| 8241 | 0.196 | 0.034 |
| 8242 | 0.151 | 0.032 |
| 8243 | 0.155 | 0.032 |
| 8244 | 0.164 | 0.06 |
| 8245 | 0.152 | 0.084 |
| 8246 | 0.147 | 0.124 |
| 8247 | 0.166 | 0.19 |
| 8248 | 0.157 | 0.21 |
| 8249 | 0.147 | 0.236 |
| 8250 | 0.168 | 0.276 |
| 8251 | 0.189 | 0.306 |
| 8252 | 0.218 | 0.352 |
| 8253 | 0.246 | 0.396 |
| 8254 | 0.244 | 0.421 |
| 8255 | 0.247 | 0.45 |
| 8256 | 0.179 | 0.475 |
| 8257 | 0.128 | 0.502 |
| 8258 | 0.097 | 0.542 |
| 8259 | 0.064 | 0.575 |
| 8260 | 0.054 | 0.613 |
| 8261 | 0.052 | 0.653 |
| 8262 | 0.054 | 0.72 |
| 8263 | 0.051 | 0.786 |
| 8264 | 0.045 | 0.845 |
| 8265 | 0.038 | 0.896 |
| 8266 | 0.041 | 0.9 |
| 8267 | 0.052 | 0.886 |
| 8268 | 0.062 | 0.882 |
| 8269 | 0.051 | 0.882 |
| 8270 | 0.03 | 0.882 |
| 8271 | 0.021 | 0.896 |
| 8272 | 0.02 | 0.896 |
| 8273 | 0.029 | 0.892 |
| 8274 | 0.059 | 0.886 |
| 8275 | 0.096 | 0.877 |
| 8276 | 0.119 | 0.859 |
| 8277 | 0.144 | 0.82 |
| 8278 | 0.165 | 0.765 |
| 8279 | 0.178 | 0.682 |
| 8280 | 0.207 | 0.575 |
| 8281 | 0.235 | 0.488 |
| 8282 | 0.248 | 0.453 |
| 8283 | 0.268 | 0.455 |
| 8284 | 0.286 | 0.494 |
| 8285 | 0.254 | 0.541 |
| 8286 | 0.186 | 0.566 |
| 8287 | 0.186 | 0.586 |
| 8288 | 0.203 | 0.631 |
| 8289 | 0.218 | 0.662 |
| 8290 | 0.282 | 0.674 |
| 8291 | 0.346 | 0.677 |
| 8292 | 0.307 | 0.661 |
| 8293 | 0.261 | 0.658 |
| 8294 | 0.217 | 0.671 |
| 8295 | 0.175 | 0.688 |
| 8296 | 0.182 | 0.688 |
| 8297 | 0.189 | 0.691 |
| 8298 | 0.28 | 0.714 |
| 8299 | 0.489 | 0.736 |
| 8300 | 0.629 | 0.766 |
| 8301 | 0.684 | 0.788 |
| 8302 | 0.661 | 0.774 |
| 8303 | 0.655 | 0.758 |
| 8304 | 0.622 | 0.744 |
| 8305 | 0.62 | 0.722 |
| 8306 | 0.638 | 0.702 |
| 8307 | 0.631 | 0.676 |
| 8308 | 0.594 | 0.651 |
| 8309 | 0.579 | 0.626 |
| 8310 | 0.553 | 0.6 |
| 8311 | 0.55 | 0.57 |
| 8312 | 0.562 | 0.522 |
| 8313 | 0.555 | 0.482 |
| 8314 | 0.641 | 0.452 |
| 8315 | 0.627 | 0.467 |
| 8316 | 0.612 | 0.514 |
| 8317 | 0.589 | 0.566 |
| 8318 | 0.643 | 0.608 |
| 8319 | 0.681 | 0.614 |
| 8320 | 0.724 | 0.6 |
| 8321 | 0.75 | 0.578 |
| 8322 | 0.737 | 0.568 |
| 8323 | 0.783 | 0.571 |
| 8324 | 0.853 | 0.582 |
| 8325 | 0.86 | 0.617 |
| 8326 | 0.899 | 0.671 |
| 8327 | 0.91 | 0.719 |
| 8328 | 0.903 | 0.766 |
| 8329 | 0.882 | 0.799 |
| 8330 | 0.872 | 0.817 |
| 8331 | 0.865 | 0.82 |
| 8332 | 0.836 | 0.832 |
| 8333 | 0.808 | 0.85 |
| 8334 | 0.783 | 0.863 |
| 8335 | 0.722 | 0.887 |
| 8336 | 0.69 | 0.9 |
| 8337 | 0.64 | 0.9 |
| 8338 | 0.612 | 0.889 |
| 8339 | 0.647 | 0.868 |
| 8340 | 0.723 | 0.84 |
| 8341 | 0.786 | 0.804 |
| 8342 | 0.809 | 0.766 |
| 8343 | 0.801 | 0.727 |
| 8344 | 0.809 | 0.687 |
| 8345 | 0.752 | 0.654 |
| 8346 | 0.586 | 0.626 |
| 8347 | 0.569 | 0.59 |
| 8348 | 0.622 | 0.581 |
| 8349 | 0.648 | 0.582 |
| 8350 | 0.672 | 0.61 |
| 8351 | 0.604 | 0.662 |
| 8352 | 0.628 | 0.693 |
| 8353 | 0.637 | 0.705 |
| 8354 | 0.658 | 0.688 |
| 8355 | 0.643 | 0.658 |
| 8356 | 0.626 | 0.616 |
| 8357 | 0.566 | 0.576 |
| 8358 | 0.479 | 0.543 |
| 8359 | 0.433 | 0.51 |
| 8360 | 0.399 | 0.487 |
| 8361 | 0.274 | 0.467 |
| 8362 | 0.369 | 0.448 |
| 8363 | 0.308 | 0.424 |
| 8364 | 0.265 | 0.419 |
| 8365 | 0.215 | 0.427 |
| 8366 | 0.18 | 0.445 |
| 8367 | 0.142 | 0.468 |
| 8368 | 0.117 | 0.471 |
| 8369 | 0.081 | 0.478 |
| 8370 | 0.092 | 0.472 |
| 8371 | 0.105 | 0.464 |
| 8372 | 0.15 | 0.46 |
| 8373 | 0.182 | 0.437 |
| 8374 | 0.23 | 0.413 |
| 8375 | 0.247 | 0.414 |
| 8376 | 0.263 | 0.427 |
| 8377 | 0.309 | 0.462 |
| 8378 | 0.343 | 0.508 |
| 8379 | 0.396 | 0.55 |
| 8380 | 0.384 | 0.581 |
| 8381 | 0.419 | 0.601 |
| 8382 | 0.397 | 0.621 |
| 8383 | 0.387 | 0.604 |
| 8384 | 0.37 | 0.58 |
| 8385 | 0.288 | 0.548 |
| 8386 | 0.236 | 0.504 |
| 8387 | 0.138 | 0.477 |
| 8388 | 0.094 | 0.464 |
| 8389 | 0.077 | 0.466 |
| 8390 | 0.089 | 0.485 |
| 8391 | 0.057 | 0.494 |
| 8392 | 0.092 | 0.492 |
| 8393 | 0.105 | 0.473 |
| 8394 | 0.094 | 0.457 |
| 8395 | 0.097 | 0.447 |
| 8396 | 0.154 | 0.442 |
| 8397 | 0.187 | 0.437 |
| 8398 | 0.213 | 0.428 |
| 8399 | 0.237 | 0.424 |
| 8400 | 0.259 | 0.459 |
| 8401 | 0.245 | 0.498 |
| 8402 | 0.238 | 0.549 |
| 8403 | 0.263 | 0.603 |
| 8404 | 0.29 | 0.617 |
| 8405 | 0.315 | 0.631 |
| 8406 | 0.23 | 0.644 |
| 8407 | 0.218 | 0.656 |
| 8408 | 0.262 | 0.659 |
| 8409 | 0.362 | 0.672 |
| 8410 | 0.388 | 0.677 |
| 8411 | 0.32 | 0.677 |
| 8412 | 0.345 | 0.695 |
| 8413 | 0.361 | 0.714 |
| 8414 | 0.283 | 0.716 |
| 8415 | 0.257 | 0.721 |
| 8416 | 0.124 | 0.702 |
| 8417 | 0.084 | 0.668 |
| 8418 | 0.149 | 0.631 |
| 8419 | 0.237 | 0.609 |
| 8420 | 0.299 | 0.602 |
| 8421 | 0.31 | 0.586 |
| 8422 | 0.306 | 0.564 |
| 8423 | 0.27 | 0.53 |
| 8424 | 0.232 | 0.52 |
| 8425 | 0.25 | 0.524 |
| 8426 | 0.243 | 0.534 |
| 8427 | 0.206 | 0.535 |
| 8428 | 0.174 | 0.509 |
| 8429 | 0.155 | 0.462 |
| 8430 | 0.146 | 0.403 |
| 8431 | 0.138 | 0.352 |
| 8432 | 0.124 | 0.326 |
| 8433 | 0.108 | 0.342 |
| 8434 | 0.023 | 0.394 |
| 8435 | 0.014 | 0.449 |
| 8436 | 0.009 | 0.487 |
| 8437 | 0.008 | 0.505 |
| 8438 | 0.002 | 0.516 |
| 8439 | 0.003 | 0.528 |
| 8440 | 0.006 | 0.522 |
| 8441 | 0.055 | 0.516 |
| 8442 | 0.153 | 0.47 |
| 8443 | 0.212 | 0.419 |
| 8444 | 0.203 | 0.362 |
| 8445 | 0.213 | 0.304 |
| 8446 | 0.23 | 0.284 |
| 8447 | 0.215 | 0.256 |
| 8448 | 0.18 | 0.242 |
| 8449 | 0.128 | 0.228 |
| 8450 | 0.121 | 0.199 |
| 8451 | 0.088 | 0.173 |
| 8452 | 0.057 | 0.157 |
| 8453 | 0.066 | 0.146 |
| 8454 | 0.075 | 0.152 |
| 8455 | 0.034 | 0.176 |
| 8456 | 0.022 | 0.205 |
| 8457 | 0.019 | 0.235 |
| 8458 | 0.014 | 0.266 |
| 8459 | 0.016 | 0.289 |
| 8460 | 0.015 | 0.312 |
| 8461 | 0.011 | 0.333 |
| 8462 | 0.014 | 0.353 |
| 8463 | 0.015 | 0.386 |
| 8464 | 0.017 | 0.428 |
| 8465 | 0.014 | 0.481 |
| 8466 | 0.01 | 0.536 |
| 8467 | 0.015 | 0.574 |
| 8468 | 0.025 | 0.591 |
| 8469 | 0.027 | 0.591 |
| 8470 | 0.035 | 0.594 |
| 8471 | 0.03 | 0.618 |
| 8472 | 0.034 | 0.678 |
| 8473 | 0.039 | 0.752 |
| 8474 | 0.033 | 0.8 |
| 8475 | 0.036 | 0.826 |
| 8476 | 0.032 | 0.829 |
| 8477 | 0.028 | 0.819 |
| 8478 | 0.023 | 0.799 |
| 8479 | 0.033 | 0.786 |
| 8480 | 0.028 | 0.764 |
| 8481 | 0.024 | 0.74 |
| 8482 | 0.031 | 0.734 |
| 8483 | 0.029 | 0.726 |
| 8484 | 0.038 | 0.725 |
| 8485 | 0.05 | 0.735 |
| 8486 | 0.071 | 0.755 |
| 8487 | 0.084 | 0.762 |
| 8488 | 0.076 | 0.748 |
| 8489 | 0.075 | 0.723 |
| 8490 | 0.103 | 0.691 |
| 8491 | 0.156 | 0.664 |
| 8492 | 0.209 | 0.655 |
| 8493 | 0.295 | 0.656 |
| 8494 | 0.412 | 0.651 |
| 8495 | 0.469 | 0.639 |
| 8496 | 0.513 | 0.61 |
| 8497 | 0.522 | 0.576 |
| 8498 | 0.499 | 0.55 |
| 8499 | 0.449 | 0.526 |
| 8500 | 0.44 | 0.514 |
| 8501 | 0.415 | 0.518 |
| 8502 | 0.357 | 0.531 |
| 8503 | 0.414 | 0.56 |
| 8504 | 0.424 | 0.615 |
| 8505 | 0.477 | 0.656 |
| 8506 | 0.538 | 0.666 |
| 8507 | 0.534 | 0.663 |
| 8508 | 0.56 | 0.657 |
| 8509 | 0.557 | 0.661 |
| 8510 | 0.579 | 0.699 |
| 8511 | 0.596 | 0.746 |
| 8512 | 0.642 | 0.775 |
| 8513 | 0.607 | 0.788 |
| 8514 | 0.555 | 0.784 |
| 8515 | 0.64 | 0.768 |
| 8516 | 0.7 | 0.73 |
| 8517 | 0.736 | 0.675 |
| 8518 | 0.758 | 0.617 |
| 8519 | 0.763 | 0.564 |
| 8520 | 0.736 | 0.509 |
| 8521 | 0.702 | 0.464 |
| 8522 | 0.675 | 0.438 |
| 8523 | 0.645 | 0.415 |
| 8524 | 0.602 | 0.424 |
| 8525 | 0.571 | 0.449 |
| 8526 | 0.532 | 0.473 |
| 8527 | 0.55 | 0.489 |
| 8528 | 0.504 | 0.494 |
| 8529 | 0.385 | 0.48 |
| 8530 | 0.383 | 0.455 |
| 8531 | 0.313 | 0.423 |
| 8532 | 0.268 | 0.37 |
| 8533 | 0.176 | 0.301 |
| 8534 | 0.12 | 0.246 |
| 8535 | 0.097 | 0.208 |
| 8536 | 0.049 | 0.201 |
| 8537 | 0.052 | 0.215 |
| 8538 | 0.129 | 0.212 |
| 8539 | 0.127 | 0.212 |
| 8540 | 0.148 | 0.196 |
| 8541 | 0.271 | 0.197 |
| 8542 | 0.295 | 0.212 |
| 8543 | 0.341 | 0.229 |
| 8544 | 0.544 | 0.255 |
| 8545 | 0.375 | 0.247 |
| 8546 | 0.283 | 0.236 |
| 8547 | 0.27 | 0.212 |
| 8548 | 0.303 | 0.177 |
| 8549 | 0.399 | 0.165 |
| 8550 | 0.23 | 0.158 |
| 8551 | 0.18 | 0.166 |
| 8552 | 0.34 | 0.182 |
| 8553 | 0.58 | 0.2 |
| 8554 | 0.459 | 0.198 |
| 8555 | 0.466 | 0.181 |
| 8556 | 0.529 | 0.176 |
| 8557 | 0.521 | 0.18 |
| 8558 | 0.571 | 0.185 |
| 8559 | 0.674 | 0.187 |
| 8560 | 0.738 | 0.164 |
| 8561 | 0.825 | 0.124 |
| 8562 | 0.714 | 0.097 |
| 8563 | 0.733 | 0.082 |
| 8564 | 0.741 | 0.079 |
| 8565 | 0.802 | 0.064 |
| 8566 | 0.828 | 0.044 |
| 8567 | 0.813 | 0.021 |
| 8568 | 0.811 | 0 |
| 8569 | 0.674 | 0 |
| 8570 | 0.652 | 0 |
| 8571 | 0.623 | 0 |
| 8572 | 0.541 | 0 |
| 8573 | 0.473 | 0 |
| 8574 | 0.415 | 0.01 |
| 8575 | 0.481 | 0.026 |
| 8576 | 0.537 | 0.058 |
| 8577 | 0.457 | 0.101 |
| 8578 | 0.493 | 0.136 |
| 8579 | 0.4 | 0.154 |
| 8580 | 0.317 | 0.149 |
| 8581 | 0.292 | 0.145 |
| 8582 | 0.287 | 0.136 |
| 8583 | 0.299 | 0.144 |
| 8584 | 0.315 | 0.164 |
| 8585 | 0.272 | 0.175 |
| 8586 | 0.19 | 0.194 |
| 8587 | 0.267 | 0.202 |
| 8588 | 0.33 | 0.196 |
| 8589 | 0.399 | 0.198 |
| 8590 | 0.445 | 0.203 |
| 8591 | 0.576 | 0.215 |
| 8592 | 0.726 | 0.241 |
| 8593 | 0.777 | 0.252 |
| 8594 | 0.842 | 0.25 |
| 8595 | 0.89 | 0.27 |
| 8596 | 0.896 | 0.32 |
| 8597 | 0.904 | 0.38 |
| 8598 | 0.905 | 0.448 |
| 8599 | 0.9 | 0.478 |
| 8600 | 0.909 | 0.46 |
| 8601 | 0.898 | 0.442 |
| 8602 | 0.893 | 0.409 |
| 8603 | 0.894 | 0.396 |
| 8604 | 0.904 | 0.394 |
| 8605 | 0.829 | 0.383 |
| 8606 | 0.807 | 0.383 |
| 8607 | 0.799 | 0.364 |
| 8608 | 0.794 | 0.339 |
| 8609 | 0.807 | 0.321 |
| 8610 | 0.827 | 0.3 |
| 8611 | 0.868 | 0.288 |
| 8612 | 0.872 | 0.28 |
| 8613 | 0.88 | 0.286 |
| 8614 | 0.881 | 0.305 |
| 8615 | 0.89 | 0.338 |
| 8616 | 0.884 | 0.381 |
| 8617 | 0.843 | 0.41 |
| 8618 | 0.803 | 0.424 |
| 8619 | 0.778 | 0.425 |
| 8620 | 0.824 | 0.408 |
| 8621 | 0.814 | 0.378 |
| 8622 | 0.728 | 0.34 |
| 8623 | 0.751 | 0.301 |
| 8624 | 0.697 | 0.269 |
| 8625 | 0.643 | 0.25 |
| 8626 | 0.587 | 0.244 |
| 8627 | 0.508 | 0.239 |
| 8628 | 0.427 | 0.232 |
| 8629 | 0.339 | 0.238 |
| 8630 | 0.253 | 0.284 |
| 8631 | 0.224 | 0.347 |
| 8632 | 0.173 | 0.422 |
| 8633 | 0.172 | 0.491 |
| 8634 | 0.309 | 0.523 |
| 8635 | 0.374 | 0.555 |
| 8636 | 0.432 | 0.561 |
| 8637 | 0.395 | 0.543 |
| 8638 | 0.352 | 0.506 |
| 8639 | 0.432 | 0.444 |
| 8640 | 0.553 | 0.428 |
| 8641 | 0.572 | 0.403 |
| 8642 | 0.518 | 0.392 |
| 8643 | 0.564 | 0.391 |
| 8644 | 0.577 | 0.358 |
| 8645 | 0.586 | 0.355 |
| 8646 | 0.567 | 0.357 |
| 8647 | 0.566 | 0.35 |
| 8648 | 0.562 | 0.351 |
| 8649 | 0.518 | 0.334 |
| 8650 | 0.487 | 0.308 |
| 8651 | 0.436 | 0.291 |
| 8652 | 0.45 | 0.282 |
| 8653 | 0.465 | 0.299 |
| 8654 | 0.425 | 0.352 |
| 8655 | 0.355 | 0.384 |
| 8656 | 0.292 | 0.383 |
| 8657 | 0.226 | 0.375 |
| 8658 | 0.141 | 0.342 |
| 8659 | 0.135 | 0.338 |
| 8660 | 0.072 | 0.361 |
| 8661 | 0.087 | 0.376 |
| 8662 | 0.092 | 0.357 |
| 8663 | 0.064 | 0.372 |
| 8664 | 0.056 | 0.39 |
| 8665 | 0.06 | 0.409 |
| 8666 | 0.047 | 0.463 |
| 8667 | 0.053 | 0.471 |
| 8668 | 0.076 | 0.461 |
| 8669 | 0.072 | 0.444 |
| 8670 | 0.056 | 0.407 |
| 8671 | 0.055 | 0.349 |
| 8672 | 0.056 | 0.276 |
| 8673 | 0.063 | 0.207 |
| 8674 | 0.053 | 0.154 |
| 8675 | 0.091 | 0.134 |
| 8676 | 0.127 | 0.125 |
| 8677 | 0.183 | 0.116 |
| 8678 | 0.238 | 0.101 |
| 8679 | 0.286 | 0.072 |
| 8680 | 0.331 | 0.045 |
| 8681 | 0.313 | 0.025 |
| 8682 | 0.255 | 0.008 |
| 8683 | 0.357 | 0.006 |
| 8684 | 0.478 | 0.012 |
| 8685 | 0.522 | 0.014 |
| 8686 | 0.51 | 0.038 |
| 8687 | 0.554 | 0.066 |
| 8688 | 0.594 | 0.09 |
| 8689 | 0.555 | 0.108 |
| 8690 | 0.516 | 0.085 |
| 8691 | 0.482 | 0.051 |
| 8692 | 0.478 | 0.02 |
| 8693 | 0.439 | 0.001 |
| 8694 | 0.352 | 0.01 |
| 8695 | 0.297 | 0.029 |
| 8696 | 0.257 | 0.029 |
| 8697 | 0.196 | 0.029 |
| 8698 | 0.068 | 0.019 |
| 8699 | 0.049 | 0.019 |
| 8700 | 0.033 | 0.059 |
| 8701 | 0.02 | 0.107 |
| 8702 | 0.036 | 0.161 |
| 8703 | 0.044 | 0.195 |
| 8704 | 0.075 | 0.196 |
| 8705 | 0.056 | 0.209 |
| 8706 | 0.048 | 0.23 |
| 8707 | 0.128 | 0.287 |
| 8708 | 0.197 | 0.365 |
| 8709 | 0.238 | 0.434 |
| 8710 | 0.327 | 0.515 |
| 8711 | 0.346 | 0.565 |
| 8712 | 0.386 | 0.606 |
| 8713 | 0.396 | 0.632 |
| 8714 | 0.458 | 0.642 |
| 8715 | 0.462 | 0.649 |
| 8716 | 0.512 | 0.65 |
| 8717 | 0.531 | 0.637 |
| 8718 | 0.498 | 0.623 |
| 8719 | 0.458 | 0.603 |
| 8720 | 0.433 | 0.57 |
| 8721 | 0.412 | 0.566 |
| 8722 | 0.346 | 0.565 |
| 8723 | 0.281 | 0.563 |
| 8724 | 0.235 | 0.57 |
| 8725 | 0.189 | 0.566 |
| 8726 | 0.163 | 0.538 |
| 8727 | 0.146 | 0.505 |
| 8728 | 0.14 | 0.487 |
| 8729 | 0.139 | 0.471 |
| 8730 | 0.13 | 0.477 |
| 8731 | 0.122 | 0.495 |
| 8732 | 0.114 | 0.518 |
| 8733 | 0.108 | 0.558 |
| 8734 | 0.117 | 0.579 |
| 8735 | 0.098 | 0.603 |